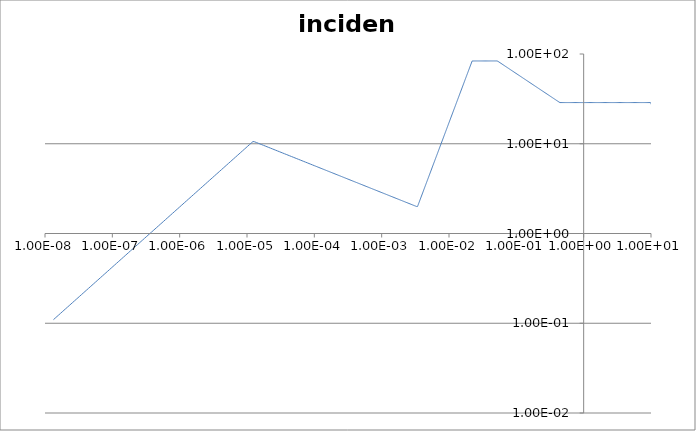
| Category | incident |
|---|---|
| 29929300.0 | 0 |
| 29829700.0 | 0 |
| 29730400.0 | 0 |
| 29631500.0 | 0 |
| 29532900.0 | 0 |
| 29434700.0 | 0 |
| 29336700.0 | 0 |
| 29239100.0 | 0 |
| 29141800.0 | 0 |
| 29044800.0 | 0 |
| 28948200.0 | 0 |
| 28851900.0 | 0 |
| 28755900.0 | 0 |
| 28660200.0 | 0 |
| 28564800.0 | 0 |
| 28469800.0 | 0 |
| 28375000.0 | 0 |
| 28280600.0 | 0 |
| 28186500.0 | 0 |
| 28092700.0 | 0 |
| 27999300.0 | 0 |
| 27906100.0 | 0 |
| 27813200.0 | 0 |
| 27720700.0 | 0 |
| 27628500.0 | 0 |
| 27536500.0 | 0 |
| 27444900.0 | 0 |
| 27353600.0 | 0 |
| 27262600.0 | 0 |
| 27171800.0 | 0 |
| 27081400.0 | 0 |
| 26991300.0 | 0 |
| 26901500.0 | 0 |
| 26812000.0 | 0 |
| 26722800.0 | 0 |
| 26633900.0 | 0 |
| 26545200.0 | 0 |
| 26456900.0 | 0 |
| 26368900.0 | 0 |
| 26281100.0 | 0 |
| 26193700.0 | 0 |
| 26106500.0 | 0 |
| 26019700.0 | 0 |
| 25933100.0 | 0 |
| 25846800.0 | 0 |
| 25760800.0 | 0 |
| 25675100.0 | 0 |
| 25589600.0 | 0 |
| 25504500.0 | 0 |
| 25419600.0 | 0 |
| 25335100.0 | 0 |
| 25250800.0 | 0 |
| 25166700.0 | 0 |
| 25083000.0 | 0 |
| 24999500.0 | 0 |
| 24916300.0 | 0 |
| 24833400.0 | 0 |
| 24750800.0 | 0 |
| 24668500.0 | 0 |
| 24586400.0 | 0 |
| 24504600.0 | 0 |
| 24423000.0 | 0 |
| 24341800.0 | 0 |
| 24260800.0 | 0 |
| 24180000.0 | 0 |
| 24099600.0 | 0 |
| 24019400.0 | 0 |
| 23939500.0 | 0 |
| 23859800.0 | 0 |
| 23780400.0 | 0 |
| 23701300.0 | 0 |
| 23622400.0 | 0 |
| 23543800.0 | 0 |
| 23465500.0 | 0 |
| 23387400.0 | 0 |
| 23309600.0 | 0 |
| 23232000.0 | 0 |
| 23154700.0 | 0 |
| 23077700.0 | 0 |
| 23000900.0 | 0 |
| 22924400.0 | 0 |
| 22848100.0 | 0 |
| 22772000.0 | 0 |
| 22696300.0 | 0 |
| 22620800.0 | 0 |
| 22545500.0 | 0 |
| 22470500.0 | 0 |
| 22395700.0 | 0 |
| 22321200.0 | 0 |
| 22246900.0 | 0 |
| 22172900.0 | 0 |
| 22099100.0 | 0 |
| 22025600.0 | 0 |
| 21952300.0 | 0 |
| 21879200.0 | 0 |
| 21806400.0 | 0 |
| 21733900.0 | 0 |
| 21661600.0 | 0 |
| 21589500.0 | 0 |
| 21517600.0 | 0 |
| 21446000.0 | 0 |
| 21374700.0 | 0 |
| 21303600.0 | 0 |
| 21232700.0 | 0 |
| 21162000.0 | 0 |
| 21091600.0 | 0 |
| 21021400.0 | 0 |
| 20951500.0 | 0 |
| 20881800.0 | 0 |
| 20812300.0 | 0 |
| 20743000.0 | 0 |
| 20674000.0 | 0 |
| 20605200.0 | 0 |
| 20536700.0 | 0 |
| 20468300.0 | 0 |
| 20400200.0 | 0 |
| 20332300.0 | 0 |
| 20264700.0 | 0 |
| 20197300.0 | 0 |
| 20130100.0 | 0 |
| 20063100.0 | 0 |
| 19996300.0 | 0 |
| 19929800.0 | 0 |
| 19863500.0 | 0 |
| 19797400.0 | 0 |
| 19731500.0 | 0 |
| 19665800.0 | 0 |
| 19600400.0 | 0 |
| 19535200.0 | 0 |
| 19470200.0 | 0 |
| 19405400.0 | 0 |
| 19340800.0 | 0 |
| 19276500.0 | 0 |
| 19212300.0 | 0 |
| 19148400.0 | 0 |
| 19084700.0 | 0 |
| 19021200.0 | 0 |
| 18957900.0 | 0 |
| 18894800.0 | 0 |
| 18831900.0 | 0 |
| 18769300.0 | 0 |
| 18706800.0 | 0 |
| 18644600.0 | 0 |
| 18582500.0 | 0 |
| 18520700.0 | 0 |
| 18459100.0 | 0 |
| 18397700.0 | 0 |
| 18336400.0 | 0 |
| 18275400.0 | 0 |
| 18214600.0 | 0 |
| 18154000.0 | 0 |
| 18093600.0 | 0 |
| 18033400.0 | 0 |
| 17973400.0 | 0 |
| 17913600.0 | 0 |
| 17854000.0 | 0 |
| 17794600.0 | 0 |
| 17735400.0 | 0 |
| 17676400.0 | 0 |
| 17617500.0 | 0 |
| 17558900.0 | 0 |
| 17500500.0 | 0 |
| 17442300.0 | 0 |
| 17384200.0 | 0 |
| 17326400.0 | 0 |
| 17268700.0 | 0 |
| 17211300.0 | 0 |
| 17154000.0 | 0 |
| 17096900.0 | 0 |
| 17040000.0 | 0 |
| 16983300.0 | 0 |
| 16926800.0 | 0 |
| 16870500.0 | 0 |
| 16814400.0 | 0 |
| 16758400.0 | 0 |
| 16702700.0 | 0 |
| 16647100.0 | 0 |
| 16591700.0 | 0 |
| 16536500.0 | 0 |
| 16481500.0 | 0 |
| 16426600.0 | 0 |
| 16372000.0 | 0 |
| 16317500.0 | 0 |
| 16263200.0 | 0 |
| 16209100.0 | 0 |
| 16155100.0 | 0 |
| 16101400.0 | 0 |
| 16047800.0 | 0 |
| 15994400.0 | 0 |
| 15941200.0 | 0 |
| 15888100.0 | 0 |
| 15835300.0 | 0 |
| 15782600.0 | 0 |
| 15730100.0 | 0 |
| 15677700.0 | 0 |
| 15625600.0 | 0 |
| 15573600.0 | 0 |
| 15521700.0 | 0 |
| 15470100.0 | 0 |
| 15418600.0 | 0 |
| 15367300.0 | 0 |
| 15316200.0 | 0 |
| 15265200.0 | 0 |
| 15214400.0 | 0 |
| 15163800.0 | 0 |
| 15113300.0 | 0 |
| 15063100.0 | 0 |
| 15012900.0 | 0 |
| 14963000.0 | 0 |
| 14913200.0 | 0 |
| 14863600.0 | 0 |
| 14814100.0 | 0 |
| 14764800.0 | 0 |
| 14715700.0 | 0 |
| 14666700.0 | 0 |
| 14617900.0 | 0 |
| 14569300.0 | 0 |
| 14520800.0 | 0 |
| 14472500.0 | 0 |
| 14424300.0 | 0 |
| 14376300.0 | 0 |
| 14328500.0 | 0 |
| 14280800.0 | 0 |
| 14233300.0 | 0 |
| 14185900.0 | 0 |
| 14138700.0 | 0 |
| 14091700.0 | 0 |
| 14044800.0 | 0 |
| 13998100.0 | 0 |
| 13951500.0 | 0 |
| 13905100.0 | 0 |
| 13858800.0 | 0 |
| 13812700.0 | 0 |
| 13766700.0 | 0 |
| 13720900.0 | 0 |
| 13675300.0 | 0 |
| 13629800.0 | 0 |
| 13584400.0 | 0 |
| 13539200.0 | 0 |
| 13494200.0 | 0 |
| 13449300.0 | 0 |
| 13404500.0 | 0 |
| 13359900.0 | 0 |
| 13315500.0 | 0 |
| 13271200.0 | 0 |
| 13227000.0 | 0 |
| 13183000.0 | 0 |
| 13139100.0 | 0 |
| 13095400.0 | 0 |
| 13051800.0 | 0 |
| 13008400.0 | 0 |
| 12965100.0 | 0 |
| 12922000.0 | 0 |
| 12879000.0 | 0 |
| 12836100.0 | 0 |
| 12793400.0 | 0 |
| 12750800.0 | 0 |
| 12708400.0 | 0 |
| 12666100.0 | 0 |
| 12624000.0 | 0 |
| 12582000.0 | 0 |
| 12540100.0 | 0 |
| 12498400.0 | 0 |
| 12456800.0 | 0 |
| 12415300.0 | 0 |
| 12374000.0 | 0 |
| 12332900.0 | 0 |
| 12291800.0 | 0 |
| 12250900.0 | 0 |
| 12210200.0 | 0 |
| 12169500.0 | 0 |
| 12129000.0 | 0 |
| 12088700.0 | 0 |
| 12048500.0 | 0 |
| 12008400.0 | 0 |
| 11968400.0 | 0 |
| 11928600.0 | 0 |
| 11888900.0 | 0 |
| 11849300.0 | 0 |
| 11809900.0 | 0 |
| 11770600.0 | 0 |
| 11731400.0 | 0 |
| 11692400.0 | 0 |
| 11653500.0 | 0 |
| 11614700.0 | 0 |
| 11576100.0 | 0 |
| 11537600.0 | 0 |
| 11499200.0 | 0 |
| 11460900.0 | 0 |
| 11422800.0 | 0 |
| 11384800.0 | 0 |
| 11346900.0 | 0 |
| 11309100.0 | 0 |
| 11271500.0 | 0 |
| 11234000.0 | 0 |
| 11196600.0 | 0 |
| 11159400.0 | 0 |
| 11122200.0 | 0 |
| 11085200.0 | 0 |
| 11048300.0 | 0 |
| 11011600.0 | 0 |
| 10974900.0 | 0 |
| 10938400.0 | 0 |
| 10902000.0 | 0 |
| 10865700.0 | 0 |
| 10829600.0 | 0 |
| 10793500.0 | 0 |
| 10757600.0 | 0 |
| 10721800.0 | 0 |
| 10686200.0 | 0 |
| 10650600.0 | 0 |
| 10615200.0 | 0 |
| 10579800.0 | 0 |
| 10544600.0 | 0 |
| 10509600.0 | 0 |
| 10474600.0 | 0 |
| 10439700.0 | 0 |
| 10405000.0 | 0 |
| 10370400.0 | 0 |
| 10335900.0 | 0 |
| 10301500.0 | 0 |
| 10267200.0 | 0 |
| 10233000.0 | 0 |
| 10199000.0 | 0 |
| 10165000.0 | 0 |
| 10131200.0 | 0 |
| 10097500.0 | 0 |
| 10063900.0 | 0 |
| 10030400.0 | 0 |
| 9997050.0 | 0 |
| 9963790.0 | 0 |
| 9930630.0 | 0 |
| 9897590.0 | 0 |
| 9864650.0 | 0 |
| 9831830.0 | 0 |
| 9799120.0 | 0 |
| 9766510.0 | 0 |
| 9734010.0 | 0 |
| 9701620.0 | 0 |
| 9669340.0 | 0 |
| 9637170.0 | 0 |
| 9605100.0 | 0 |
| 9573140.0 | 0 |
| 9541290.0 | 0 |
| 9509540.0 | 0 |
| 9477900.0 | 0 |
| 9446360.0 | 0 |
| 9414930.0 | 0 |
| 9383600.0 | 0 |
| 9352380.0 | 0 |
| 9321260.0 | 0 |
| 9290240.0 | 0 |
| 9259330.0 | 0 |
| 9228520.0 | 0 |
| 9197810.0 | 0 |
| 9167210.0 | 0 |
| 9136700.0 | 0 |
| 9106300.0 | 0 |
| 9076000.0 | 0 |
| 9045800.0 | 0 |
| 9015700.0 | 0 |
| 8985700.0 | 0 |
| 8955810.0 | 0 |
| 8926010.0 | 0 |
| 8896300.0 | 0 |
| 8866700.0 | 0 |
| 8837200.0 | 0 |
| 8807790.0 | 0 |
| 8778490.0 | 0 |
| 8749280.0 | 0 |
| 8720160.0 | 0 |
| 8691150.0 | 0 |
| 8662230.0 | 0 |
| 8633410.0 | 0 |
| 8604680.0 | 0 |
| 8576050.0 | 0 |
| 8547510.0 | 0 |
| 8519070.0 | 0 |
| 8490720.0 | 0 |
| 8462470.0 | 0 |
| 8434310.0 | 0 |
| 8406250.0 | 0 |
| 8378280.0 | 0 |
| 8350400.0 | 0 |
| 8322620.0 | 0 |
| 8294920.0 | 0 |
| 8267320.0 | 0 |
| 8239810.0 | 0 |
| 8212400.0 | 0 |
| 8185070.0 | 0 |
| 8157830.0 | 0 |
| 8130690.0 | 0 |
| 8103640.0 | 0 |
| 8076670.0 | 0 |
| 8049800.0 | 0 |
| 8023010.0 | 0 |
| 7996320.0 | 0 |
| 7969710.0 | 0 |
| 7943190.0 | 0 |
| 7916760.0 | 0 |
| 7890420.0 | 0 |
| 7864160.0 | 0 |
| 7838000.0 | 0 |
| 7811910.0 | 0 |
| 7785920.0 | 0 |
| 7760010.0 | 0 |
| 7734190.0 | 0 |
| 7708460.0 | 0 |
| 7682810.0 | 0 |
| 7657250.0 | 0 |
| 7631770.0 | 0 |
| 7606370.0 | 0 |
| 7581060.0 | 0 |
| 7555840.0 | 0 |
| 7530700.0 | 0 |
| 7505640.0 | 0 |
| 7480660.0 | 0 |
| 7455770.0 | 0 |
| 7430960.0 | 0 |
| 7406240.0 | 0 |
| 7381590.0 | 0 |
| 7357030.0 | 0 |
| 7332550.0 | 0 |
| 7308150.0 | 0 |
| 7283840.0 | 0 |
| 7259600.0 | 0 |
| 7235440.0 | 0 |
| 7211370.0 | 0 |
| 7187370.0 | 0 |
| 7163460.0 | 0 |
| 7139620.0 | 0 |
| 7115870.0 | 0 |
| 7092190.0 | 0 |
| 7068590.0 | 0 |
| 7045070.0 | 0 |
| 7021630.0 | 0 |
| 6998260.0 | 0 |
| 6974980.0 | 0 |
| 6951770.0 | 0 |
| 6928640.0 | 0 |
| 6905580.0 | 0 |
| 6882600.0 | 0 |
| 6859700.0 | 0 |
| 6836880.0 | 0 |
| 6814130.0 | 0 |
| 6791460.0 | 0 |
| 6768860.0 | 0 |
| 6746330.0 | 0 |
| 6723890.0 | 0 |
| 6701510.0 | 0 |
| 6679220.0 | 0 |
| 6656990.0 | 0 |
| 6634840.0 | 0 |
| 6612760.0 | 0 |
| 6590760.0 | 0 |
| 6568830.0 | 0 |
| 6546970.0 | 0 |
| 6525190.0 | 0 |
| 6503480.0 | 0 |
| 6481840.0 | 0 |
| 6460270.0 | 0 |
| 6438770.0 | 0 |
| 6417350.0 | 0 |
| 6395990.0 | 0 |
| 6374710.0 | 0 |
| 6353500.0 | 0 |
| 6332360.0 | 0 |
| 6311290.0 | 0 |
| 6290290.0 | 0 |
| 6269360.0 | 0 |
| 6248500.0 | 0 |
| 6227710.0 | 0 |
| 6206980.0 | 0 |
| 6186330.0 | 0 |
| 6165750.0 | 0 |
| 6145230.0 | 0 |
| 6124780.0 | 0 |
| 6104400.0 | 0 |
| 6084090.0 | 0 |
| 6063850.0 | 0 |
| 6043670.0 | 0 |
| 6023560.0 | 0 |
| 6003520.0 | 0 |
| 5983540.0 | 0 |
| 5963630.0 | 0 |
| 5943790.0 | 0 |
| 5924010.0 | 0 |
| 5904300.0 | 0 |
| 5884650.0 | 0 |
| 5865070.0 | 0 |
| 5845560.0 | 0 |
| 5826100.0 | 0 |
| 5806720.0 | 0 |
| 5787400.0 | 0 |
| 5768140.0 | 0 |
| 5748950.0 | 0 |
| 5729820.0 | 0 |
| 5710750.0 | 0 |
| 5691750.0 | 0 |
| 5672810.0 | 0 |
| 5653940.0 | 0 |
| 5635120.0 | 0 |
| 5616370.0 | 0 |
| 5597680.0 | 0 |
| 5579060.0 | 0 |
| 5560490.0 | 0 |
| 5541990.0 | 0 |
| 5523550.0 | 0 |
| 5505170.0 | 0 |
| 5486850.0 | 0 |
| 5468600.0 | 0 |
| 5450400.0 | 0 |
| 5432270.0 | 0 |
| 5414190.0 | 0 |
| 5396180.0 | 0 |
| 5378220.0 | 0 |
| 5360320.0 | 0 |
| 5342490.0 | 0 |
| 5324710.0 | 0 |
| 5306990.0 | 0 |
| 5289340.0 | 0 |
| 5271730.0 | 0 |
| 5254190.0 | 0 |
| 5236710.0 | 0 |
| 5219290.0 | 0 |
| 5201920.0 | 0 |
| 5184610.0 | 0 |
| 5167360.0 | 0 |
| 5150170.0 | 0 |
| 5133030.0 | 0 |
| 5115950.0 | 0 |
| 5098930.0 | 0 |
| 5081960.0 | 0 |
| 5065050.0 | 0 |
| 5048200.0 | 0 |
| 5031400.0 | 0 |
| 5014660.0 | 0 |
| 4997970.0 | 0 |
| 4981340.0 | 0 |
| 4964770.0 | 0 |
| 4948250.0 | 0 |
| 4931780.0 | 0 |
| 4915370.0 | 0 |
| 4899010.0 | 0 |
| 4882710.0 | 0 |
| 4866470.0 | 0 |
| 4850270.0 | 0 |
| 4834140.0 | 0 |
| 4818050.0 | 0 |
| 4802020.0 | 0 |
| 4786040.0 | 0 |
| 4770120.0 | 0 |
| 4754240.0 | 0 |
| 4738420.0 | 0 |
| 4722660.0 | 0 |
| 4706940.0 | 0 |
| 4691280.0 | 0 |
| 4675670.0 | 0 |
| 4660110.0 | 0 |
| 4644610.0 | 0 |
| 4629150.0 | 0 |
| 4613750.0 | 0 |
| 4598400.0 | 0 |
| 4583100.0 | 0 |
| 4567850.0 | 0 |
| 4552650.0 | 0 |
| 4537500.0 | 0 |
| 4522400.0 | 0 |
| 4507350.0 | 0 |
| 4492350.0 | 0 |
| 4477410.0 | 0 |
| 4462510.0 | 0 |
| 4447660.0 | 0 |
| 4432860.0 | 0 |
| 4418110.0 | 0 |
| 4403410.0 | 0 |
| 4388760.0 | 0 |
| 4374150.0 | 0 |
| 4359600.0 | 0 |
| 4345090.0 | 0 |
| 4330640.0 | 0 |
| 4316230.0 | 0 |
| 4301860.0 | 0 |
| 4287550.0 | 0 |
| 4273280.0 | 0 |
| 4259060.0 | 0 |
| 4244890.0 | 0 |
| 4230770.0 | 0 |
| 4216690.0 | 0 |
| 4202660.0 | 0 |
| 4188680.0 | 0 |
| 4174740.0 | 0 |
| 4160850.0 | 0 |
| 4147000.0 | 0 |
| 4133200.0 | 0 |
| 4119450.0 | 0 |
| 4105740.0 | 0 |
| 4092080.0 | 0 |
| 4078470.0 | 0 |
| 4064890.0 | 0 |
| 4051370.0 | 0 |
| 4037890.0 | 0 |
| 4024450.0 | 0 |
| 4011060.0 | 0 |
| 3997720.0 | 0 |
| 3984410.0 | 0 |
| 3971160.0 | 0 |
| 3957940.0 | 0 |
| 3944770.0 | 0 |
| 3931650.0 | 0 |
| 3918560.0 | 0 |
| 3905520.0 | 0 |
| 3892530.0 | 0 |
| 3879580.0 | 0 |
| 3866670.0 | 0 |
| 3853800.0 | 0 |
| 3840980.0 | 0 |
| 3828200.0 | 0 |
| 3815460.0 | 0 |
| 3802760.0 | 0 |
| 3790110.0 | 0 |
| 3777500.0 | 0 |
| 3764930.0 | 0 |
| 3752400.0 | 0 |
| 3739920.0 | 0 |
| 3727470.0 | 0 |
| 3715070.0 | 0 |
| 3702710.0 | 0 |
| 3690390.0 | 0 |
| 3678110.0 | 0 |
| 3665870.0 | 0 |
| 3653670.0 | 0 |
| 3641510.0 | 0 |
| 3629400.0 | 0 |
| 3617320.0 | 0 |
| 3605290.0 | 0 |
| 3593290.0 | 0 |
| 3581330.0 | 0 |
| 3569420.0 | 0 |
| 3557540.0 | 0 |
| 3545700.0 | 0 |
| 3533900.0 | 0 |
| 3522140.0 | 0 |
| 3510420.0 | 0 |
| 3498740.0 | 0 |
| 3487100.0 | 0 |
| 3475500.0 | 0 |
| 3463930.0 | 0 |
| 3452410.0 | 0 |
| 3440920.0 | 0 |
| 3429470.0 | 0 |
| 3418060.0 | 0 |
| 3406690.0 | 0 |
| 3395350.0 | 0 |
| 3384050.0 | 0 |
| 3372790.0 | 0 |
| 3361570.0 | 0 |
| 3350390.0 | 0 |
| 3339240.0 | 0 |
| 3328130.0 | 0 |
| 3317050.0 | 0 |
| 3306020.0 | 0 |
| 3295010.0 | 0 |
| 3284050.0 | 0 |
| 3273120.0 | 0 |
| 3262230.0 | 0 |
| 3251380.0 | 0 |
| 3240560.0 | 0 |
| 3229780.0 | 0 |
| 3219030.0 | 0 |
| 3208320.0 | 0 |
| 3197640.0 | 0 |
| 3187000.0 | 0 |
| 3176400.0 | 0 |
| 3165830.0 | 0 |
| 3155300.0 | 0 |
| 3144800.0 | 0 |
| 3134330.0 | 0 |
| 3123900.0 | 0 |
| 3113510.0 | 0 |
| 3103150.0 | 0 |
| 3092820.0 | 0 |
| 3082530.0 | 0 |
| 3072270.0 | 0 |
| 3062050.0 | 0 |
| 3051860.0 | 0 |
| 3041710.0 | 0 |
| 3031590.0 | 0 |
| 3021500.0 | 0 |
| 3011450.0 | 0 |
| 3001430.0 | 0 |
| 2991440.0 | 0 |
| 2981480.0 | 0 |
| 2971560.0 | 0 |
| 2961680.0 | 0 |
| 2951820.0 | 0 |
| 2942000.0 | 0 |
| 2932210.0 | 0 |
| 2922450.0 | 0 |
| 2912730.0 | 0 |
| 2903040.0 | 0 |
| 2893380.0 | 0 |
| 2883750.0 | 0 |
| 2874160.0 | 0 |
| 2864590.0 | 0 |
| 2855060.0 | 0 |
| 2845560.0 | 0 |
| 2836090.0 | 0 |
| 2826650.0 | 0 |
| 2817250.0 | 0 |
| 2807870.0 | 0 |
| 2798530.0 | 0 |
| 2789220.0 | 0 |
| 2779940.0 | 0 |
| 2770690.0 | 0 |
| 2761470.0 | 0 |
| 2752280.0 | 0 |
| 2743120.0 | 0 |
| 2734000.0 | 0 |
| 2724900.0 | 0 |
| 2715830.0 | 0 |
| 2706800.0 | 0 |
| 2697790.0 | 0 |
| 2688810.0 | 0 |
| 2679860.0 | 0 |
| 2670950.0 | 0 |
| 2662060.0 | 0 |
| 2653200.0 | 0 |
| 2644370.0 | 0 |
| 2635580.0 | 0 |
| 2626810.0 | 0 |
| 2618070.0 | 0 |
| 2609350.0 | 0 |
| 2600670.0 | 0 |
| 2592020.0 | 0 |
| 2583390.0 | 0 |
| 2574800.0 | 0 |
| 2566230.0 | 0 |
| 2557690.0 | 0 |
| 2549180.0 | 0 |
| 2540700.0 | 0 |
| 2532240.0 | 0 |
| 2523820.0 | 0 |
| 2515420.0 | 0 |
| 2507050.0 | 0 |
| 2498710.0 | 0 |
| 2490390.0 | 0 |
| 2482110.0 | 0 |
| 2473850.0 | 0 |
| 2465620.0 | 0 |
| 2457410.0 | 0 |
| 2449240.0 | 0 |
| 2441090.0 | 0 |
| 2432960.0 | 0 |
| 2424870.0 | 0 |
| 2416800.0 | 0 |
| 2408760.0 | 0 |
| 2400740.0 | 0 |
| 2392750.0 | 0 |
| 2384790.0 | 0 |
| 2376860.0 | 0 |
| 2368950.0 | 0 |
| 2361070.0 | 0 |
| 2353210.0 | 0 |
| 2345380.0 | 0 |
| 2337580.0 | 0 |
| 2329800.0 | 0 |
| 2322050.0 | 0 |
| 2314320.0 | 0 |
| 2306620.0 | 0 |
| 2298940.0 | 0 |
| 2291290.0 | 0 |
| 2283670.0 | 0 |
| 2276070.0 | 0 |
| 2268500.0 | 0 |
| 2260950.0 | 0 |
| 2253430.0 | 0 |
| 2245930.0 | 0 |
| 2238460.0 | 0 |
| 2231010.0 | 0 |
| 2223580.0 | 0 |
| 2216180.0 | 0 |
| 2208810.0 | 0 |
| 2201460.0 | 0 |
| 2194140.0 | 0 |
| 2186830.0 | 0 |
| 2179560.0 | 0 |
| 2172310.0 | 0 |
| 2165080.0 | 0 |
| 2157870.0 | 0 |
| 2150690.0 | 0 |
| 2143540.0 | 0 |
| 2136400.0 | 0 |
| 2129300.0 | 0 |
| 2122210.0 | 0 |
| 2115150.0 | 0 |
| 2108110.0 | 0 |
| 2101100.0 | 0 |
| 2094110.0 | 0 |
| 2087140.0 | 0 |
| 2080190.0 | 0 |
| 2073270.0 | 0 |
| 2066370.0 | 0 |
| 2059500.0 | 0 |
| 2052640.0 | 0 |
| 2045810.0 | 0 |
| 2039010.0 | 0 |
| 2032220.0 | 0 |
| 2025460.0 | 0 |
| 2018720.0 | 0 |
| 2012000.0 | 0 |
| 2005310.0 | 0 |
| 1998640.0 | 0 |
| 1991990.0 | 0 |
| 1985360.0 | 0 |
| 1978750.0 | 0 |
| 1972170.0 | 0 |
| 1965600.0 | 0 |
| 1959060.0 | 0 |
| 1952550.0 | 0 |
| 1946050.0 | 0 |
| 1939570.0 | 0 |
| 1933120.0 | 0 |
| 1926690.0 | 0 |
| 1920280.0 | 0 |
| 1913890.0 | 0 |
| 1907520.0 | 0 |
| 1901170.0 | 0 |
| 1894850.0 | 0 |
| 1888540.0 | 0 |
| 1882260.0 | 0 |
| 1875990.0 | 0 |
| 1869750.0 | 0 |
| 1863530.0 | 0 |
| 1857330.0 | 0 |
| 1851150.0 | 0 |
| 1844990.0 | 0 |
| 1838850.0 | 0 |
| 1832730.0 | 0 |
| 1826630.0 | 0 |
| 1820560.0 | 0 |
| 1814500.0 | 0 |
| 1808460.0 | 0 |
| 1802440.0 | 0 |
| 1796450.0 | 0 |
| 1790470.0 | 0 |
| 1784510.0 | 0 |
| 1778570.0 | 0 |
| 1772650.0 | 0 |
| 1766760.0 | 0 |
| 1760880.0 | 0 |
| 1755020.0 | 0 |
| 1749180.0 | 0 |
| 1743360.0 | 0 |
| 1737560.0 | 0 |
| 1731780.0 | 0 |
| 1726010.0 | 0 |
| 1720270.0 | 0 |
| 1714550.0 | 0 |
| 1708840.0 | 0 |
| 1703150.0 | 0 |
| 1697490.0 | 0 |
| 1691840.0 | 0 |
| 1686210.0 | 0 |
| 1680600.0 | 0 |
| 1675010.0 | 0 |
| 1669430.0 | 0 |
| 1663880.0 | 0 |
| 1658340.0 | 0 |
| 1652820.0 | 0 |
| 1647320.0 | 0 |
| 1641840.0 | 0 |
| 1636380.0 | 0 |
| 1630940.0 | 0 |
| 1625510.0 | 0 |
| 1620100.0 | 0 |
| 1614710.0 | 0 |
| 1609340.0 | 0 |
| 1603980.0 | 0 |
| 1598640.0 | 0 |
| 1593320.0 | 0 |
| 1588020.0 | 0 |
| 1582740.0 | 0 |
| 1577470.0 | 0 |
| 1572220.0 | 0 |
| 1566990.0 | 0 |
| 1561780.0 | 0 |
| 1556580.0 | 0 |
| 1551400.0 | 0 |
| 1546240.0 | 0 |
| 1541100.0 | 0 |
| 1535970.0 | 0 |
| 1530860.0 | 0 |
| 1525760.0 | 0 |
| 1520690.0 | 0 |
| 1515630.0 | 0 |
| 1510580.0 | 0 |
| 1505560.0 | 0 |
| 1500550.0 | 0 |
| 1495550.0 | 0 |
| 1490580.0 | 0 |
| 1485620.0 | 0 |
| 1480670.0 | 0 |
| 1475750.0 | 0 |
| 1470840.0 | 0 |
| 1465940.0 | 0 |
| 1461070.0 | 0 |
| 1456200.0 | 0 |
| 1451360.0 | 0 |
| 1446530.0 | 0 |
| 1441720.0 | 0 |
| 1436920.0 | 0 |
| 1432140.0 | 0 |
| 1427370.0 | 0 |
| 1422620.0 | 0 |
| 1417890.0 | 0 |
| 1413170.0 | 0 |
| 1408470.0 | 0 |
| 1403780.0 | 0 |
| 1399110.0 | 0 |
| 1394460.0 | 0 |
| 1389820.0 | 0 |
| 1385190.0 | 0 |
| 1380580.0 | 0 |
| 1375990.0 | 0 |
| 1371410.0 | 0 |
| 1366850.0 | 0 |
| 1362300.0 | 0 |
| 1357770.0 | 0 |
| 1353250.0 | 0 |
| 1348740.0 | 0 |
| 1344260.0 | 0 |
| 1339780.0 | 0 |
| 1335330.0 | 0 |
| 1330880.0 | 0 |
| 1326450.0 | 0 |
| 1322040.0 | 0 |
| 1317640.0 | 0 |
| 1313260.0 | 0 |
| 1308890.0 | 0 |
| 1304530.0 | 0 |
| 1300190.0 | 0 |
| 1295870.0 | 0 |
| 1291550.0 | 0 |
| 1287260.0 | 0 |
| 1282970.0 | 0 |
| 1278700.0 | 0 |
| 1274450.0 | 0 |
| 1270210.0 | 0 |
| 1265980.0 | 0 |
| 1261770.0 | 0 |
| 1257570.0 | 0 |
| 1253390.0 | 0 |
| 1249220.0 | 0 |
| 1245060.0 | 0 |
| 1240920.0 | 0 |
| 1236790.0 | 0 |
| 1232670.0 | 0 |
| 1228570.0 | 0 |
| 1224480.0 | 0 |
| 1220410.0 | 0 |
| 1216350.0 | 0 |
| 1212300.0 | 0 |
| 1208270.0 | 0 |
| 1204250.0 | 0 |
| 1200240.0 | 0 |
| 1196240.0 | 0 |
| 1192260.0 | 0 |
| 1188300.0 | 0 |
| 1184340.0 | 0 |
| 1180400.0 | 0 |
| 1176470.0 | 0 |
| 1172560.0 | 0 |
| 1168660.0 | 0 |
| 1164770.0 | 0 |
| 1160890.0 | 0 |
| 1157030.0 | 0 |
| 1153180.0 | 0 |
| 1149340.0 | 0 |
| 1145520.0 | 0 |
| 1141710.0 | 0 |
| 1137910.0 | 0 |
| 1134120.0 | 0 |
| 1130350.0 | 0 |
| 1126590.0 | 0 |
| 1122840.0 | 0 |
| 1119100.0 | 0 |
| 1115380.0 | 0 |
| 1111670.0 | 0 |
| 1107970.0 | 0 |
| 1104280.0 | 0 |
| 1100610.0 | 0 |
| 1096950.0 | 0 |
| 1093300.0 | 0 |
| 1089660.0 | 0 |
| 1086030.0 | 0 |
| 1082420.0 | 0 |
| 1078820.0 | 0 |
| 1075230.0 | 0 |
| 1071650.0 | 0 |
| 1068080.0 | 0 |
| 1064530.0 | 0 |
| 1060990.0 | 0 |
| 1057460.0 | 0 |
| 1053940.0 | 0 |
| 1050430.0 | 0 |
| 1046940.0 | 0 |
| 1043450.0 | 0 |
| 1039980.0 | 0 |
| 1036520.0 | 0 |
| 1033070.0 | 0 |
| 1029630.0 | 0 |
| 1026210.0 | 0 |
| 1022790.0 | 0 |
| 1019390.0 | 0 |
| 1016000.0 | 0 |
| 1012620.0 | 0 |
| 1009250.0 | 0 |
| 1005890.0 | 0 |
| 1002540.0 | 0 |
| 999207.0 | 0 |
| 995882.0 | 0 |
| 992569.0 | 0 |
| 989266.0 | 0 |
| 985974.0 | 0 |
| 982694.0 | 0 |
| 979424.0 | 0 |
| 976165.0 | 0 |
| 972917.0 | 0 |
| 969679.0 | 0 |
| 966453.0 | 0 |
| 963237.0 | 0 |
| 960032.0 | 0 |
| 956838.0 | 0 |
| 953654.0 | 0 |
| 950481.0 | 0 |
| 947318.0 | 0 |
| 944166.0 | 0 |
| 941024.0 | 0 |
| 937893.0 | 0 |
| 934772.0 | 0 |
| 931662.0 | 0 |
| 928562.0 | 0 |
| 925472.0 | 0 |
| 922393.0 | 0 |
| 919323.0 | 0 |
| 916264.0 | 0 |
| 913216.0 | 0 |
| 910177.0 | 0 |
| 907148.0 | 0 |
| 904130.0 | 0 |
| 901122.0 | 0 |
| 898123.0 | 0 |
| 895135.0 | 0 |
| 892156.0 | 0 |
| 889188.0 | 0 |
| 886229.0 | 0 |
| 883280.0 | 0 |
| 880341.0 | 0 |
| 877412.0 | 0 |
| 874492.0 | 0 |
| 871582.0 | 0 |
| 868682.0 | 0 |
| 865792.0 | 0 |
| 862911.0 | 0 |
| 860040.0 | 0 |
| 857178.0 | 0 |
| 854326.0 | 0 |
| 851483.0 | 0 |
| 848650.0 | 0 |
| 845826.0 | 0 |
| 843012.0 | 0 |
| 840207.0 | 0 |
| 837411.0 | 0 |
| 834624.0 | 0 |
| 831847.0 | 0 |
| 829079.0 | 0 |
| 826321.0 | 0 |
| 823571.0 | 0 |
| 820831.0 | 0 |
| 818100.0 | 0 |
| 815377.0 | 0 |
| 812664.0 | 0 |
| 809960.0 | 0 |
| 807265.0 | 0 |
| 804579.0 | 0 |
| 801902.0 | 0 |
| 799234.0 | 0 |
| 796574.0 | 0 |
| 793924.0 | 0 |
| 791282.0 | 0 |
| 788649.0 | 0 |
| 786025.0 | 0 |
| 783409.0 | 0 |
| 780803.0 | 0 |
| 778205.0 | 0 |
| 775615.0 | 0 |
| 773034.0 | 0 |
| 770462.0 | 0 |
| 767898.0 | 0 |
| 765343.0 | 0 |
| 762797.0 | 0 |
| 760259.0 | 0 |
| 757729.0 | 0 |
| 755208.0 | 0 |
| 752695.0 | 0 |
| 750190.0 | 0 |
| 747694.0 | 0 |
| 745206.0 | 0 |
| 742726.0 | 0 |
| 740255.0 | 0 |
| 737792.0 | 0 |
| 735337.0 | 0 |
| 732890.0 | 0 |
| 730452.0 | 0 |
| 728021.0 | 0 |
| 725599.0 | 0 |
| 723184.0 | 0 |
| 720778.0 | 0 |
| 718380.0 | 0 |
| 715989.0 | 0 |
| 713607.0 | 0 |
| 711232.0 | 0 |
| 708866.0 | 0 |
| 706507.0 | 0 |
| 704156.0 | 0 |
| 701813.0 | 0 |
| 699478.0 | 0 |
| 697151.0 | 0 |
| 694831.0 | 0 |
| 692519.0 | 0 |
| 690215.0 | 0 |
| 687918.0 | 0 |
| 685629.0 | 0 |
| 683348.0 | 0 |
| 681074.0 | 0 |
| 678807.0 | 0 |
| 676549.0 | 0 |
| 674298.0 | 0 |
| 672054.0 | 0 |
| 669818.0 | 0 |
| 667589.0 | 0 |
| 665368.0 | 0 |
| 663154.0 | 0 |
| 660947.0 | 0 |
| 658748.0 | 0 |
| 656556.0 | 0 |
| 654371.0 | 0 |
| 652194.0 | 0 |
| 650024.0 | 0 |
| 647861.0 | 0 |
| 645705.0 | 0 |
| 643557.0 | 0 |
| 641415.0 | 0 |
| 639281.0 | 0 |
| 637154.0 | 0 |
| 635034.0 | 0 |
| 632921.0 | 0 |
| 630815.0 | 0 |
| 628716.0 | 0 |
| 626624.0 | 0 |
| 624539.0 | 0 |
| 622461.0 | 0 |
| 620389.0 | 0 |
| 618325.0 | 0 |
| 616268.0 | 0 |
| 614217.0 | 0 |
| 612173.0 | 0 |
| 610136.0 | 0 |
| 608106.0 | 0 |
| 606083.0 | 0 |
| 604066.0 | 0 |
| 602056.0 | 0 |
| 600053.0 | 0 |
| 598056.0 | 0 |
| 596066.0 | 0 |
| 594083.0 | 0 |
| 592106.0 | 0 |
| 590136.0 | 0 |
| 588172.0 | 0 |
| 586215.0 | 0 |
| 584265.0 | 0 |
| 582320.0 | 0 |
| 580383.0 | 0 |
| 578452.0 | 0 |
| 576527.0 | 0 |
| 574609.0 | 0 |
| 572697.0 | 0 |
| 570791.0 | 0 |
| 568892.0 | 0 |
| 566999.0 | 0 |
| 565112.0 | 0 |
| 563232.0 | 0 |
| 561358.0 | 0 |
| 559490.0 | 0 |
| 557628.0 | 0 |
| 555773.0 | 0 |
| 553923.0 | 0 |
| 552080.0 | 0 |
| 550243.0 | 0 |
| 548412.0 | 0 |
| 546588.0 | 0 |
| 544769.0 | 0 |
| 542956.0 | 0 |
| 541150.0 | 0 |
| 539349.0 | 0 |
| 537554.0 | 0 |
| 535766.0 | 0 |
| 533983.0 | 0 |
| 532206.0 | 0 |
| 530435.0 | 0 |
| 528670.0 | 0 |
| 526911.0 | 0 |
| 525158.0 | 0 |
| 523410.0 | 0 |
| 521669.0 | 0 |
| 519933.0 | 0 |
| 518203.0 | 0 |
| 516479.0 | 0 |
| 514760.0 | 0 |
| 513047.0 | 0 |
| 511340.0 | 0 |
| 509639.0 | 0 |
| 507943.0 | 0 |
| 506253.0 | 0 |
| 504568.0 | 0 |
| 502889.0 | 0 |
| 501216.0 | 0 |
| 499548.0 | 0 |
| 497886.0 | 0 |
| 496229.0 | 0 |
| 494578.0 | 0 |
| 492933.0 | 0 |
| 491292.0 | 0 |
| 489658.0 | 0 |
| 488028.0 | 0 |
| 486404.0 | 0 |
| 484786.0 | 0 |
| 483173.0 | 0 |
| 481565.0 | 0 |
| 479963.0 | 0 |
| 478366.0 | 0 |
| 476774.0 | 0 |
| 475188.0 | 0 |
| 473606.0 | 0 |
| 472031.0 | 0 |
| 470460.0 | 0 |
| 468895.0 | 0 |
| 467334.0 | 0 |
| 465779.0 | 0 |
| 464229.0 | 0 |
| 462685.0 | 0 |
| 461145.0 | 0 |
| 459611.0 | 0 |
| 458081.0 | 0 |
| 456557.0 | 0 |
| 455038.0 | 0 |
| 453524.0 | 0 |
| 452015.0 | 0 |
| 450511.0 | 0 |
| 449012.0 | 0 |
| 447518.0 | 0 |
| 446029.0 | 0 |
| 444545.0 | 0 |
| 443065.0 | 0 |
| 441591.0 | 0 |
| 440122.0 | 0 |
| 438657.0 | 0 |
| 437198.0 | 0 |
| 435743.0 | 0 |
| 434293.0 | 0 |
| 432848.0 | 0 |
| 431408.0 | 0 |
| 429972.0 | 0 |
| 428542.0 | 0 |
| 427116.0 | 0 |
| 425694.0 | 0 |
| 424278.0 | 0 |
| 422866.0 | 0 |
| 421459.0 | 0 |
| 420057.0 | 0 |
| 418659.0 | 0 |
| 417266.0 | 0 |
| 415878.0 | 0 |
| 414494.0 | 0 |
| 413115.0 | 0 |
| 411740.0 | 0 |
| 410370.0 | 0 |
| 409004.0 | 0 |
| 407644.0 | 0 |
| 406287.0 | 0 |
| 404935.0 | 0 |
| 403588.0 | 0 |
| 402245.0 | 0 |
| 400906.0 | 0 |
| 399573.0 | 0 |
| 398243.0 | 0 |
| 396918.0 | 0 |
| 395597.0 | 0 |
| 394281.0 | 0 |
| 392969.0 | 0 |
| 391661.0 | 0 |
| 390358.0 | 0 |
| 389059.0 | 0 |
| 387765.0 | 0 |
| 386474.0 | 0 |
| 385188.0 | 0 |
| 383907.0 | 0 |
| 382629.0 | 0 |
| 381356.0 | 0 |
| 380087.0 | 0 |
| 378822.0 | 0 |
| 377562.0 | 0 |
| 376306.0 | 0 |
| 375054.0 | 0 |
| 373806.0 | 0 |
| 372562.0 | 0 |
| 371322.0 | 0 |
| 370087.0 | 0 |
| 368855.0 | 0 |
| 367628.0 | 0 |
| 366405.0 | 0 |
| 365185.0 | 0 |
| 363970.0 | 0 |
| 362759.0 | 0 |
| 361552.0 | 0 |
| 360349.0 | 0 |
| 359150.0 | 0 |
| 357955.0 | 0 |
| 356764.0 | 0 |
| 355577.0 | 0 |
| 354394.0 | 0 |
| 353214.0 | 0 |
| 352039.0 | 0 |
| 350868.0 | 0 |
| 349700.0 | 0 |
| 348537.0 | 0 |
| 347377.0 | 0 |
| 346221.0 | 0 |
| 345069.0 | 0 |
| 343921.0 | 0 |
| 342776.0 | 0 |
| 341636.0 | 0 |
| 340499.0 | 0 |
| 339366.0 | 0 |
| 338237.0 | 0 |
| 337111.0 | 0 |
| 335990.0 | 0 |
| 334872.0 | 0 |
| 333758.0 | 0 |
| 332647.0 | 0 |
| 331540.0 | 0 |
| 330437.0 | 0 |
| 329337.0 | 0 |
| 328242.0 | 0 |
| 327149.0 | 0 |
| 326061.0 | 0 |
| 324976.0 | 0 |
| 323895.0 | 0 |
| 322817.0 | 0 |
| 321743.0 | 0 |
| 320672.0 | 0 |
| 319605.0 | 0 |
| 318542.0 | 0 |
| 317482.0 | 0 |
| 316425.0 | 0 |
| 315372.0 | 0 |
| 314323.0 | 0 |
| 313277.0 | 0 |
| 312235.0 | 0 |
| 311196.0 | 0 |
| 310160.0 | 0 |
| 309128.0 | 0 |
| 308100.0 | 0 |
| 307075.0 | 0 |
| 306053.0 | 0 |
| 305034.0 | 0 |
| 304019.0 | 0 |
| 303008.0 | 0 |
| 302000.0 | 0 |
| 300995.0 | 0 |
| 299993.0 | 0 |
| 298995.0 | 0 |
| 298000.0 | 0 |
| 297009.0 | 0 |
| 296020.0 | 0 |
| 295035.0 | 0 |
| 294054.0 | 0 |
| 293075.0 | 0 |
| 292100.0 | 0 |
| 291128.0 | 0 |
| 290159.0 | 0 |
| 289194.0 | 0 |
| 288232.0 | 0 |
| 287272.0 | 0 |
| 286317.0 | 0 |
| 285364.0 | 0 |
| 284414.0 | 0 |
| 283468.0 | 0 |
| 282525.0 | 0 |
| 281585.0 | 0 |
| 280648.0 | 0 |
| 279714.0 | 0 |
| 278783.0 | 0 |
| 277856.0 | 0 |
| 276931.0 | 0 |
| 276010.0 | 0 |
| 275091.0 | 0 |
| 274176.0 | 0 |
| 273264.0 | 0 |
| 272354.0 | 0 |
| 271448.0 | 0 |
| 270545.0 | 0 |
| 269645.0 | 0 |
| 268747.0 | 0 |
| 267853.0 | 0 |
| 266962.0 | 0 |
| 266074.0 | 0 |
| 265188.0 | 0 |
| 264306.0 | 0 |
| 263426.0 | 0 |
| 262550.0 | 0 |
| 261676.0 | 0 |
| 260806.0 | 0 |
| 259938.0 | 0 |
| 259073.0 | 0 |
| 258211.0 | 0 |
| 257352.0 | 0 |
| 256495.0 | 0 |
| 255642.0 | 0 |
| 254791.0 | 0 |
| 253943.0 | 0 |
| 253098.0 | 0 |
| 252256.0 | 0 |
| 251417.0 | 0 |
| 250580.0 | 0 |
| 249746.0 | 0 |
| 248915.0 | 0 |
| 248087.0 | 0 |
| 247262.0 | 0 |
| 246439.0 | 0 |
| 245619.0 | 0 |
| 244802.0 | 0 |
| 243987.0 | 0 |
| 243175.0 | 0 |
| 242366.0 | 0 |
| 241560.0 | 0 |
| 240756.0 | 0 |
| 239955.0 | 0 |
| 239156.0 | 0 |
| 238361.0 | 0 |
| 237567.0 | 0 |
| 236777.0 | 0 |
| 235989.0 | 0 |
| 235204.0 | 0 |
| 234421.0 | 0 |
| 233641.0 | 0 |
| 232864.0 | 0 |
| 232089.0 | 0 |
| 231317.0 | 0 |
| 230547.0 | 0 |
| 229780.0 | 0 |
| 229015.0 | 0 |
| 228253.0 | 0 |
| 227494.0 | 0 |
| 226737.0 | 0 |
| 225982.0 | 0 |
| 225230.0 | 0 |
| 224481.0 | 0 |
| 223734.0 | 0 |
| 222990.0 | 0 |
| 222248.0 | 0 |
| 221508.0 | 0 |
| 220771.0 | 0 |
| 220036.0 | 0 |
| 219304.0 | 0 |
| 218575.0 | 0 |
| 217847.0 | 0 |
| 217122.0 | 0 |
| 216400.0 | 0 |
| 215680.0 | 0 |
| 214962.0 | 0 |
| 214247.0 | 0 |
| 213534.0 | 0 |
| 212824.0 | 0 |
| 212115.0 | 0 |
| 211410.0 | 0 |
| 210706.0 | 0 |
| 210005.0 | 0 |
| 209306.0 | 0 |
| 208610.0 | 0 |
| 207916.0 | 0 |
| 207224.0 | 0 |
| 206534.0 | 0 |
| 205847.0 | 0 |
| 205162.0 | 0 |
| 204480.0 | 0 |
| 203799.0 | 0 |
| 203121.0 | 0 |
| 202445.0 | 0 |
| 201772.0 | 0 |
| 201100.0 | 0 |
| 200431.0 | 0 |
| 199764.0 | 0 |
| 199099.0 | 0 |
| 198437.0 | 0 |
| 197777.0 | 0 |
| 197119.0 | 0 |
| 196463.0 | 0 |
| 195809.0 | 0 |
| 195157.0 | 0 |
| 194508.0 | 0 |
| 193861.0 | 0 |
| 193216.0 | 0 |
| 192573.0 | 0 |
| 191932.0 | 0 |
| 191293.0 | 0 |
| 190657.0 | 0 |
| 190023.0 | 0 |
| 189390.0 | 0 |
| 188760.0 | 0 |
| 188132.0 | 0 |
| 187506.0 | 0 |
| 186882.0 | 0 |
| 186260.0 | 0 |
| 185640.0 | 0 |
| 185023.0 | 0 |
| 184407.0 | 0 |
| 183794.0 | 0 |
| 183182.0 | 0 |
| 182572.0 | 0 |
| 181965.0 | 0 |
| 181359.0 | 0 |
| 180756.0 | 0 |
| 180155.0 | 0 |
| 179555.0 | 0 |
| 178958.0 | 0 |
| 178362.0 | 0 |
| 177769.0 | 0 |
| 177177.0 | 0 |
| 176588.0 | 0 |
| 176000.0 | 0 |
| 175414.0 | 0 |
| 174831.0 | 0 |
| 174249.0 | 0 |
| 173669.0 | 0 |
| 173091.0 | 0 |
| 172515.0 | 0 |
| 171941.0 | 0 |
| 171369.0 | 0 |
| 170799.0 | 0 |
| 170231.0 | 0 |
| 169664.0 | 0 |
| 169100.0 | 0 |
| 168537.0 | 0 |
| 167976.0 | 0 |
| 167417.0 | 0 |
| 166860.0 | 0 |
| 166305.0 | 0 |
| 165752.0 | 0 |
| 165200.0 | 0 |
| 164650.0 | 0 |
| 164103.0 | 0 |
| 163557.0 | 0 |
| 163012.0 | 0 |
| 162470.0 | 0 |
| 161929.0 | 0 |
| 161391.0 | 0 |
| 160854.0 | 0 |
| 160318.0 | 0 |
| 159785.0 | 0 |
| 159253.0 | 0 |
| 158723.0 | 0 |
| 158195.0 | 0 |
| 157669.0 | 0 |
| 157144.0 | 0 |
| 156621.0 | 0 |
| 156100.0 | 0 |
| 155581.0 | 0 |
| 155063.0 | 0 |
| 154547.0 | 0 |
| 154033.0 | 0 |
| 153520.0 | 0 |
| 153009.0 | 0 |
| 152500.0 | 0 |
| 151993.0 | 0 |
| 151487.0 | 0 |
| 150983.0 | 0 |
| 150481.0 | 0 |
| 149980.0 | 0 |
| 149481.0 | 0 |
| 148984.0 | 0 |
| 148488.0 | 0 |
| 147994.0 | 0 |
| 147501.0 | 0 |
| 147010.0 | 0 |
| 146521.0 | 0 |
| 146034.0 | 0 |
| 145548.0 | 0 |
| 145064.0 | 0 |
| 144581.0 | 0 |
| 144100.0 | 0 |
| 143620.0 | 0 |
| 143142.0 | 0 |
| 142666.0 | 0 |
| 142191.0 | 0 |
| 141718.0 | 0 |
| 141247.0 | 0 |
| 140777.0 | 0 |
| 140308.0 | 0 |
| 139841.0 | 0 |
| 139376.0 | 0 |
| 138912.0 | 0 |
| 138450.0 | 0 |
| 137989.0 | 0 |
| 137530.0 | 0 |
| 137073.0 | 0 |
| 136617.0 | 0 |
| 136162.0 | 0 |
| 135709.0 | 0 |
| 135257.0 | 0 |
| 134807.0 | 0 |
| 134359.0 | 0 |
| 133912.0 | 0 |
| 133466.0 | 0 |
| 133022.0 | 0 |
| 132579.0 | 0 |
| 132138.0 | 0 |
| 131699.0 | 0 |
| 131260.0 | 0 |
| 130824.0 | 0 |
| 130388.0 | 0 |
| 129954.0 | 0 |
| 129522.0 | 0 |
| 129091.0 | 0 |
| 128662.0 | 0 |
| 128233.0 | 0 |
| 127807.0 | 0 |
| 127381.0 | 0 |
| 126958.0 | 0 |
| 126535.0 | 0 |
| 126114.0 | 0 |
| 125694.0 | 0 |
| 125276.0 | 0 |
| 124859.0 | 0 |
| 124444.0 | 0 |
| 124030.0 | 0 |
| 123617.0 | 0 |
| 123206.0 | 0 |
| 122796.0 | 0 |
| 122387.0 | 0 |
| 121980.0 | 0 |
| 121574.0 | 0 |
| 121170.0 | 0 |
| 120766.0 | 0 |
| 120365.0 | 0 |
| 119964.0 | 0 |
| 119565.0 | 0 |
| 119167.0 | 0 |
| 118771.0 | 0 |
| 118375.0 | 0 |
| 117981.0 | 0 |
| 117589.0 | 0 |
| 117198.0 | 0 |
| 116808.0 | 0 |
| 116419.0 | 0 |
| 116032.0 | 0 |
| 115646.0 | 0 |
| 115261.0 | 0 |
| 114877.0 | 0 |
| 114495.0 | 0 |
| 114114.0 | 0 |
| 113734.0 | 0 |
| 113356.0 | 0 |
| 112979.0 | 0 |
| 112603.0 | 0 |
| 112228.0 | 0 |
| 111855.0 | 0 |
| 111482.0 | 0 |
| 111112.0 | 0 |
| 110742.0 | 0 |
| 110373.0 | 0 |
| 110006.0 | 0 |
| 109640.0 | 0 |
| 109275.0 | 0 |
| 108912.0 | 0 |
| 108549.0 | 0 |
| 108188.0 | 0 |
| 107828.0 | 0 |
| 107469.0 | 0 |
| 107112.0 | 0 |
| 106755.0 | 0 |
| 106400.0 | 0 |
| 106046.0 | 0 |
| 105693.0 | 0 |
| 105341.0 | 0 |
| 104991.0 | 0 |
| 104642.0 | 0 |
| 104293.0 | 0 |
| 103946.0 | 0 |
| 103600.0 | 0 |
| 103256.0 | 0 |
| 102912.0 | 0 |
| 102570.0 | 0 |
| 102228.0 | 0 |
| 101888.0 | 0 |
| 101549.0 | 0 |
| 101211.0 | 0 |
| 100875.0 | 0 |
| 100539.0 | 0 |
| 100204.0 | 0 |
| 99871.0 | 0 |
| 99538.7 | 0 |
| 99207.5 | 0 |
| 98877.4 | 0 |
| 98548.4 | 0 |
| 98220.4 | 0 |
| 97893.6 | 0 |
| 97567.9 | 0 |
| 97243.2 | 0 |
| 96919.7 | 0 |
| 96597.2 | 0 |
| 96275.8 | 0 |
| 95955.4 | 0 |
| 95636.1 | 0 |
| 95317.9 | 0 |
| 95000.7 | 0 |
| 94684.6 | 0 |
| 94369.6 | 0 |
| 94055.6 | 0 |
| 93742.6 | 0 |
| 93430.7 | 0 |
| 93119.8 | 0 |
| 92809.9 | 0 |
| 92501.1 | 0 |
| 92193.3 | 0 |
| 91886.6 | 0 |
| 91580.8 | 0 |
| 91276.1 | 0 |
| 90972.4 | 0 |
| 90669.7 | 0 |
| 90368.0 | 0 |
| 90067.3 | 0 |
| 89767.6 | 0 |
| 89468.9 | 0 |
| 89171.2 | 0 |
| 88874.5 | 0 |
| 88578.8 | 0 |
| 88284.0 | 0 |
| 87990.3 | 0 |
| 87697.5 | 0 |
| 87405.7 | 0 |
| 87114.9 | 0 |
| 86825.0 | 0 |
| 86536.1 | 0 |
| 86248.1 | 0 |
| 85961.2 | 0 |
| 85675.1 | 0 |
| 85390.1 | 0 |
| 85105.9 | 0 |
| 84822.7 | 0 |
| 84540.5 | 0 |
| 84259.2 | 0 |
| 83978.8 | 0 |
| 83699.4 | 0 |
| 83420.9 | 0 |
| 83143.3 | 0 |
| 82866.7 | 0 |
| 82590.9 | 0 |
| 82316.1 | 0 |
| 82042.2 | 0 |
| 81769.2 | 0 |
| 81497.1 | 0 |
| 81226.0 | 0 |
| 80955.7 | 0 |
| 80686.3 | 0 |
| 80417.9 | 0 |
| 80150.3 | 0 |
| 79883.6 | 0 |
| 79617.8 | 0 |
| 79352.8 | 0 |
| 79088.8 | 0 |
| 78825.6 | 0 |
| 78563.4 | 0 |
| 78301.9 | 0 |
| 78041.4 | 0 |
| 77781.7 | 0 |
| 77522.9 | 0 |
| 77265.0 | 0 |
| 77007.9 | 0 |
| 76751.6 | 0 |
| 76496.2 | 0 |
| 76241.7 | 0 |
| 75988.0 | 0 |
| 75735.2 | 0 |
| 75483.2 | 0 |
| 75232.0 | 0 |
| 74981.7 | 0 |
| 74732.2 | 0 |
| 74483.5 | 0 |
| 74235.7 | 0 |
| 73988.7 | 0 |
| 73742.5 | 0 |
| 73497.1 | 0 |
| 73252.5 | 0 |
| 73008.8 | 0 |
| 72765.9 | 0 |
| 72523.7 | 0 |
| 72282.4 | 0 |
| 72041.9 | 0 |
| 71802.2 | 0 |
| 71563.3 | 0 |
| 71325.2 | 0 |
| 71087.8 | 0 |
| 70851.3 | 0 |
| 70615.5 | 0 |
| 70380.6 | 0 |
| 70146.4 | 0 |
| 69913.0 | 0 |
| 69680.3 | 0 |
| 69448.5 | 0 |
| 69217.4 | 0 |
| 68987.1 | 0 |
| 68757.5 | 0 |
| 68528.8 | 0 |
| 68300.7 | 0 |
| 68073.5 | 0 |
| 67847.0 | 0 |
| 67621.2 | 0 |
| 67396.2 | 0 |
| 67171.9 | 0 |
| 66948.4 | 0 |
| 66725.7 | 0 |
| 66503.6 | 0 |
| 66282.4 | 0 |
| 66061.8 | 0 |
| 65842.0 | 0 |
| 65622.9 | 0 |
| 65404.6 | 0 |
| 65186.9 | 0 |
| 64970.0 | 0 |
| 64753.8 | 0 |
| 64538.4 | 0 |
| 64323.6 | 0 |
| 64109.6 | 0 |
| 63896.3 | 0 |
| 63683.7 | 0 |
| 63471.8 | 0 |
| 63260.6 | 0 |
| 63050.1 | 0 |
| 62840.3 | 0 |
| 62631.2 | 0 |
| 62422.8 | 0 |
| 62215.1 | 0 |
| 62008.1 | 0 |
| 61801.7 | 0 |
| 61596.1 | 0 |
| 61391.1 | 0 |
| 61186.9 | 0 |
| 60983.3 | 0 |
| 60780.3 | 0 |
| 60578.1 | 0 |
| 60376.5 | 0 |
| 60175.6 | 0 |
| 59975.4 | 0 |
| 59775.8 | 0 |
| 59576.9 | 0 |
| 59378.7 | 0 |
| 59181.1 | 0 |
| 58984.2 | 0 |
| 58787.9 | 0 |
| 58592.3 | 0 |
| 58397.4 | 0 |
| 58203.1 | 0 |
| 58009.4 | 0 |
| 57816.4 | 0 |
| 57624.0 | 0 |
| 57432.3 | 0 |
| 57241.2 | 0 |
| 57050.7 | 0 |
| 56860.9 | 0 |
| 56671.7 | 0 |
| 56483.1 | 0 |
| 56295.1 | 0 |
| 56107.8 | 0 |
| 55921.1 | 0 |
| 55735.1 | 0 |
| 55549.6 | 0 |
| 55364.8 | 0 |
| 55180.5 | 0 |
| 54996.9 | 0 |
| 54813.9 | 0 |
| 54631.5 | 0 |
| 54449.8 | 0 |
| 54268.6 | 0 |
| 54088.0 | 0 |
| 53908.0 | 0 |
| 53728.7 | 0 |
| 53549.9 | 0 |
| 53371.7 | 0 |
| 53194.1 | 0 |
| 53017.1 | 0 |
| 52840.7 | 0 |
| 52664.9 | 0 |
| 52489.6 | 0 |
| 52315.0 | 0 |
| 52140.9 | 0 |
| 51967.4 | 0 |
| 51794.5 | 0 |
| 51622.2 | 0 |
| 51450.4 | 0 |
| 51279.2 | 0 |
| 51108.6 | 0 |
| 50938.5 | 0 |
| 50769.0 | 0 |
| 50600.1 | 0 |
| 50431.7 | 0 |
| 50263.9 | 0 |
| 50096.7 | 0 |
| 49930.0 | 0 |
| 49763.8 | 0 |
| 49598.2 | 0 |
| 49433.2 | 0 |
| 49268.7 | 0 |
| 49104.8 | 0 |
| 48941.4 | 0 |
| 48778.5 | 0 |
| 48616.2 | 0 |
| 48454.5 | 0 |
| 48293.2 | 0 |
| 48132.5 | 0 |
| 47972.4 | 0 |
| 47812.8 | 0 |
| 47653.7 | 0 |
| 47495.1 | 0 |
| 47337.1 | 0 |
| 47179.6 | 0 |
| 47022.6 | 0 |
| 46866.1 | 0 |
| 46710.2 | 0 |
| 46554.7 | 0 |
| 46399.8 | 0 |
| 46245.4 | 0 |
| 46091.6 | 0 |
| 45938.2 | 0 |
| 45785.3 | 0 |
| 45633.0 | 0 |
| 45481.2 | 0 |
| 45329.8 | 0 |
| 45179.0 | 0 |
| 45028.7 | 0 |
| 44878.8 | 0 |
| 44729.5 | 0 |
| 44580.7 | 0 |
| 44432.3 | 0 |
| 44284.5 | 0 |
| 44137.1 | 0 |
| 43990.3 | 0 |
| 43843.9 | 0 |
| 43698.0 | 0 |
| 43552.6 | 0 |
| 43407.7 | 0 |
| 43263.2 | 0 |
| 43119.3 | 0 |
| 42975.8 | 0 |
| 42832.8 | 0 |
| 42690.3 | 0 |
| 42548.2 | 0 |
| 42406.7 | 0 |
| 42265.6 | 0 |
| 42124.9 | 0 |
| 41984.8 | 0 |
| 41845.1 | 0 |
| 41705.8 | 0 |
| 41567.1 | 0 |
| 41428.7 | 0 |
| 41290.9 | 0 |
| 41153.5 | 0 |
| 41016.6 | 0 |
| 40880.1 | 0 |
| 40744.1 | 0 |
| 40608.5 | 0 |
| 40473.4 | 0 |
| 40338.7 | 0 |
| 40204.5 | 0 |
| 40070.7 | 0 |
| 39937.4 | 0 |
| 39804.5 | 0 |
| 39672.0 | 0 |
| 39540.0 | 0 |
| 39408.5 | 0 |
| 39277.3 | 0 |
| 39146.6 | 0 |
| 39016.4 | 0 |
| 38886.6 | 0 |
| 38757.2 | 0 |
| 38628.2 | 0 |
| 38499.7 | 0 |
| 38371.6 | 0 |
| 38243.9 | 0 |
| 38116.6 | 0 |
| 37989.8 | 0 |
| 37863.4 | 0 |
| 37737.4 | 0 |
| 37611.8 | 0 |
| 37486.7 | 0 |
| 37361.9 | 0 |
| 37237.6 | 0 |
| 37113.7 | 0 |
| 36990.2 | 0 |
| 36867.1 | 0 |
| 36744.5 | 0 |
| 36622.2 | 0 |
| 36500.4 | 0 |
| 36378.9 | 0 |
| 36257.9 | 0 |
| 36137.2 | 0 |
| 36017.0 | 0 |
| 35897.1 | 0 |
| 35777.7 | 0 |
| 35658.6 | 0 |
| 35540.0 | 0 |
| 35421.7 | 0 |
| 35303.9 | 0 |
| 35186.4 | 0 |
| 35069.3 | 0 |
| 34952.6 | 0 |
| 34836.3 | 0 |
| 34720.4 | 0 |
| 34604.9 | 0 |
| 34489.7 | 0 |
| 34375.0 | 0 |
| 34260.6 | 0 |
| 34146.6 | 0 |
| 34033.0 | 0 |
| 33919.7 | 0 |
| 33806.9 | 0 |
| 33694.4 | 0 |
| 33582.3 | 0 |
| 33470.5 | 0 |
| 33359.1 | 0 |
| 33248.1 | 0 |
| 33137.5 | 0 |
| 33027.2 | 0 |
| 32917.4 | 0 |
| 32807.8 | 0 |
| 32698.7 | 0 |
| 32589.9 | 0 |
| 32481.4 | 0 |
| 32373.3 | 0 |
| 32265.6 | 0 |
| 32158.3 | 0 |
| 32051.2 | 0 |
| 31944.6 | 0 |
| 31838.3 | 0 |
| 31732.4 | 0 |
| 31626.8 | 0 |
| 31521.5 | 0 |
| 31416.7 | 0 |
| 31312.1 | 0 |
| 31207.9 | 0 |
| 31104.1 | 0 |
| 31000.6 | 0 |
| 30897.4 | 0 |
| 30794.6 | 0 |
| 30692.2 | 0 |
| 30590.0 | 0 |
| 30488.3 | 0 |
| 30386.8 | 0 |
| 30285.7 | 0 |
| 30184.9 | 0 |
| 30084.5 | 0 |
| 29984.4 | 0 |
| 29884.6 | 0 |
| 29785.2 | 0 |
| 29686.1 | 0 |
| 29587.3 | 0 |
| 29488.8 | 0 |
| 29390.7 | 0 |
| 29292.9 | 0 |
| 29195.5 | 0 |
| 29098.3 | 0 |
| 29001.5 | 0 |
| 28905.0 | 0 |
| 28808.8 | 0 |
| 28712.9 | 0 |
| 28617.4 | 0 |
| 28522.2 | 0 |
| 28427.3 | 0 |
| 28332.7 | 0 |
| 28238.4 | 0 |
| 28144.5 | 0 |
| 28050.8 | 0 |
| 27957.5 | 0 |
| 27864.4 | 0 |
| 27771.7 | 0 |
| 27679.3 | 0 |
| 27587.2 | 0 |
| 27495.4 | 0 |
| 27403.9 | 0 |
| 27312.7 | 0 |
| 27221.9 | 0 |
| 27131.3 | 0 |
| 27041.0 | 0 |
| 26951.0 | 0 |
| 26861.4 | 0 |
| 26772.0 | 0 |
| 26682.9 | 0 |
| 26594.1 | 0 |
| 26505.6 | 0 |
| 26417.4 | 0 |
| 26329.5 | 0 |
| 26241.9 | 0 |
| 26154.6 | 0 |
| 26067.6 | 0 |
| 25980.8 | 0 |
| 25894.4 | 0 |
| 25808.2 | 0 |
| 25722.3 | 0 |
| 25636.8 | 0 |
| 25551.5 | 0 |
| 25466.4 | 0 |
| 25381.7 | 0 |
| 25297.2 | 0 |
| 25213.1 | 0 |
| 25129.2 | 0 |
| 25045.6 | 0 |
| 24962.2 | 0 |
| 24879.2 | 0 |
| 24796.4 | 0 |
| 24713.9 | 0 |
| 24631.6 | 0 |
| 24549.7 | 0 |
| 24468.0 | 0 |
| 24386.6 | 0 |
| 24305.4 | 0 |
| 24224.5 | 0 |
| 24143.9 | 0 |
| 24063.6 | 0 |
| 23983.5 | 0 |
| 23903.7 | 0 |
| 23824.2 | 0 |
| 23744.9 | 0 |
| 23665.9 | 0 |
| 23587.2 | 0 |
| 23508.7 | 0 |
| 23430.5 | 0 |
| 23352.5 | 0 |
| 23274.8 | 0 |
| 23197.3 | 0 |
| 23120.2 | 0 |
| 23043.2 | 0 |
| 22966.6 | 0 |
| 22890.1 | 0 |
| 22814.0 | 0 |
| 22738.1 | 0 |
| 22662.4 | 0 |
| 22587.0 | 0 |
| 22511.8 | 0 |
| 22436.9 | 0 |
| 22362.3 | 0 |
| 22287.9 | 0 |
| 22213.7 | 0 |
| 22139.8 | 0 |
| 22066.1 | 0 |
| 21992.7 | 0 |
| 21919.5 | 0 |
| 21846.6 | 0 |
| 21773.9 | 0 |
| 21701.4 | 0 |
| 21629.2 | 0 |
| 21557.3 | 0 |
| 21485.5 | 0 |
| 21414.0 | 0 |
| 21342.8 | 0 |
| 21271.8 | 0 |
| 21201.0 | 0 |
| 21130.4 | 0 |
| 21060.1 | 0 |
| 20990.1 | 0 |
| 20920.2 | 0 |
| 20850.6 | 0 |
| 20781.2 | 0 |
| 20712.1 | 0 |
| 20643.2 | 0 |
| 20574.5 | 0 |
| 20506.0 | 0 |
| 20437.8 | 0 |
| 20369.8 | 0 |
| 20302.0 | 0 |
| 20234.4 | 0 |
| 20167.1 | 0 |
| 20100.0 | 0 |
| 20033.1 | 0 |
| 19966.5 | 0 |
| 19900.0 | 0 |
| 19833.8 | 0 |
| 19767.8 | 0 |
| 19702.0 | 0 |
| 19636.5 | 0 |
| 19571.1 | 0 |
| 19506.0 | 0 |
| 19441.1 | 0 |
| 19376.4 | 0 |
| 19312.0 | 0 |
| 19247.7 | 0 |
| 19183.7 | 0 |
| 19119.8 | 0 |
| 19056.2 | 0 |
| 18992.8 | 0 |
| 18929.6 | 0 |
| 18866.6 | 0 |
| 18803.8 | 0 |
| 18741.3 | 0 |
| 18678.9 | 0 |
| 18616.8 | 0 |
| 18554.8 | 0 |
| 18493.1 | 0 |
| 18431.5 | 0 |
| 18370.2 | 0 |
| 18309.1 | 0 |
| 18248.2 | 0 |
| 18187.4 | 0 |
| 18126.9 | 0 |
| 18066.6 | 0 |
| 18006.5 | 0 |
| 17946.6 | 0 |
| 17886.9 | 0 |
| 17827.3 | 0 |
| 17768.0 | 0 |
| 17708.9 | 0 |
| 17650.0 | 0 |
| 17591.2 | 0 |
| 17532.7 | 0 |
| 17474.4 | 0 |
| 17416.2 | 0 |
| 17358.3 | 0 |
| 17300.5 | 0 |
| 17243.0 | 0 |
| 17185.6 | 0 |
| 17128.4 | 0 |
| 17071.4 | 0 |
| 17014.6 | 0 |
| 16958.0 | 0 |
| 16901.6 | 0 |
| 16845.3 | 0 |
| 16789.3 | 0 |
| 16733.4 | 0 |
| 16677.7 | 0 |
| 16622.2 | 0 |
| 16566.9 | 0 |
| 16511.8 | 0 |
| 16456.9 | 0 |
| 16402.1 | 0 |
| 16347.5 | 0 |
| 16293.1 | 0 |
| 16238.9 | 0 |
| 16184.9 | 0 |
| 16131.0 | 0 |
| 16077.3 | 0 |
| 16023.8 | 0 |
| 15970.5 | 0 |
| 15917.4 | 0 |
| 15864.4 | 0 |
| 15811.6 | 0 |
| 15759.0 | 0 |
| 15706.6 | 0 |
| 15654.3 | 0 |
| 15602.2 | 0 |
| 15550.3 | 0 |
| 15498.6 | 0 |
| 15447.0 | 0 |
| 15395.6 | 0 |
| 15344.4 | 0 |
| 15293.3 | 0 |
| 15242.4 | 0 |
| 15191.7 | 0 |
| 15141.2 | 0 |
| 15090.8 | 0 |
| 15040.6 | 0 |
| 14990.5 | 0 |
| 14940.7 | 0 |
| 14890.9 | 0 |
| 14841.4 | 0 |
| 14792.0 | 0 |
| 14742.8 | 0 |
| 14693.7 | 0 |
| 14644.8 | 0 |
| 14596.1 | 0 |
| 14547.5 | 0 |
| 14499.1 | 0 |
| 14450.9 | 0 |
| 14402.8 | 0 |
| 14354.9 | 0 |
| 14307.1 | 0 |
| 14259.5 | 0 |
| 14212.1 | 0 |
| 14164.8 | 0 |
| 14117.6 | 0 |
| 14070.7 | 0 |
| 14023.8 | 0 |
| 13977.2 | 0 |
| 13930.7 | 0 |
| 13884.3 | 0 |
| 13838.1 | 0 |
| 13792.1 | 0 |
| 13746.2 | 0 |
| 13700.4 | 0 |
| 13654.9 | 0 |
| 13609.4 | 0 |
| 13564.1 | 0 |
| 13519.0 | 0 |
| 13474.0 | 0 |
| 13429.2 | 0 |
| 13384.5 | 0 |
| 13340.0 | 0 |
| 13295.6 | 0 |
| 13251.3 | 0 |
| 13207.2 | 0 |
| 13163.3 | 0 |
| 13119.5 | 0 |
| 13075.8 | 0 |
| 13032.3 | 0 |
| 12989.0 | 0 |
| 12945.8 | 0 |
| 12902.7 | 0 |
| 12859.7 | 0 |
| 12817.0 | 0 |
| 12774.3 | 0 |
| 12731.8 | 0 |
| 12689.4 | 0 |
| 12647.2 | 0 |
| 12605.1 | 0 |
| 12563.2 | 0 |
| 12521.4 | 0 |
| 12479.7 | 0 |
| 12438.2 | 0 |
| 12396.8 | 0 |
| 12355.6 | 0 |
| 12314.5 | 0 |
| 12273.5 | 0 |
| 12232.6 | 0 |
| 12191.9 | 0 |
| 12151.4 | 0 |
| 12110.9 | 0 |
| 12070.6 | 0 |
| 12030.5 | 0 |
| 11990.4 | 0 |
| 11950.5 | 0 |
| 11910.8 | 0 |
| 11871.1 | 0 |
| 11831.6 | 0 |
| 11792.3 | 0 |
| 11753.0 | 0 |
| 11713.9 | 0 |
| 11675.0 | 0 |
| 11636.1 | 0 |
| 11597.4 | 0 |
| 11558.8 | 0 |
| 11520.3 | 0 |
| 11482.0 | 0 |
| 11443.8 | 0 |
| 11405.7 | 0 |
| 11367.8 | 0 |
| 11329.9 | 0 |
| 11292.2 | 0 |
| 11254.7 | 0 |
| 11217.2 | 0 |
| 11179.9 | 0 |
| 11142.7 | 0 |
| 11105.6 | 0 |
| 11068.7 | 0 |
| 11031.8 | 0 |
| 10995.1 | 0 |
| 10958.5 | 0 |
| 10922.1 | 0 |
| 10885.7 | 0 |
| 10849.5 | 0 |
| 10813.4 | 0 |
| 10777.4 | 0 |
| 10741.6 | 0 |
| 10705.8 | 0 |
| 10670.2 | 0 |
| 10634.7 | 0 |
| 10599.3 | 0 |
| 10564.1 | 0 |
| 10528.9 | 0 |
| 10493.9 | 0 |
| 10458.9 | 0 |
| 10424.1 | 0 |
| 10389.5 | 0 |
| 10354.9 | 0 |
| 10320.4 | 0 |
| 10286.1 | 0 |
| 10251.9 | 0 |
| 10217.8 | 0 |
| 10183.8 | 0 |
| 10149.9 | 0 |
| 10116.1 | 0 |
| 10082.4 | 0 |
| 10048.9 | 0 |
| 10015.5 | 0 |
| 9982.13 | 0 |
| 9948.91 | 0 |
| 9915.81 | 0 |
| 9882.81 | 0 |
| 9849.93 | 0 |
| 9817.16 | 0 |
| 9784.49 | 0 |
| 9751.93 | 0 |
| 9719.48 | 0 |
| 9687.14 | 0 |
| 9654.91 | 0 |
| 9622.78 | 0 |
| 9590.76 | 0 |
| 9558.85 | 0 |
| 9527.05 | 0 |
| 9495.35 | 0 |
| 9463.75 | 0 |
| 9432.26 | 0 |
| 9400.87 | 0 |
| 9369.59 | 0 |
| 9338.42 | 0 |
| 9307.34 | 0 |
| 9276.38 | 0 |
| 9245.51 | 0 |
| 9214.75 | 0 |
| 9184.08 | 0 |
| 9153.52 | 0 |
| 9123.07 | 0 |
| 9092.71 | 0 |
| 9062.46 | 0 |
| 9032.3 | 0 |
| 9002.25 | 0 |
| 8972.29 | 0 |
| 8942.44 | 0 |
| 8912.68 | 0 |
| 8883.03 | 0 |
| 8853.47 | 0 |
| 8824.01 | 0 |
| 8794.65 | 0 |
| 8765.38 | 0 |
| 8736.22 | 0 |
| 8707.15 | 0 |
| 8678.18 | 0 |
| 8649.3 | 0 |
| 8620.52 | 0 |
| 8591.84 | 0 |
| 8563.25 | 0 |
| 8534.75 | 0 |
| 8506.36 | 0 |
| 8478.05 | 0 |
| 8449.84 | 0 |
| 8421.73 | 0 |
| 8393.7 | 0 |
| 8365.77 | 0 |
| 8337.94 | 0 |
| 8310.19 | 0 |
| 8282.54 | 0 |
| 8254.98 | 0 |
| 8227.51 | 0 |
| 8200.14 | 0 |
| 8172.85 | 0 |
| 8145.66 | 0 |
| 8118.55 | 0 |
| 8091.54 | 0 |
| 8064.62 | 0 |
| 8037.78 | 0 |
| 8011.04 | 0 |
| 7984.38 | 0 |
| 7957.81 | 0 |
| 7931.33 | 0 |
| 7904.94 | 0 |
| 7878.64 | 0 |
| 7852.42 | 0 |
| 7826.3 | 0 |
| 7800.25 | 0 |
| 7774.3 | 0 |
| 7748.43 | 0 |
| 7722.65 | 0 |
| 7696.95 | 0 |
| 7671.34 | 0 |
| 7645.82 | 0 |
| 7620.38 | 0 |
| 7595.02 | 0 |
| 7569.75 | 0 |
| 7544.56 | 0 |
| 7519.46 | 0 |
| 7494.44 | 0 |
| 7469.5 | 0 |
| 7444.64 | 0 |
| 7419.87 | 0 |
| 7395.18 | 0 |
| 7370.58 | 0 |
| 7346.05 | 0 |
| 7321.61 | 0 |
| 7297.25 | 0 |
| 7272.96 | 0 |
| 7248.76 | 0 |
| 7224.64 | 0 |
| 7200.61 | 0 |
| 7176.65 | 0 |
| 7152.77 | 0 |
| 7128.97 | 0 |
| 7105.24 | 0 |
| 7081.6 | 0 |
| 7058.04 | 0 |
| 7034.55 | 0 |
| 7011.15 | 0 |
| 6987.82 | 0 |
| 6964.57 | 0 |
| 6941.39 | 0 |
| 6918.3 | 0 |
| 6895.28 | 0 |
| 6872.33 | 0 |
| 6849.47 | 0 |
| 6826.67 | 0 |
| 6803.96 | 0 |
| 6781.32 | 0 |
| 6758.75 | 0 |
| 6736.27 | 0 |
| 6713.85 | 0 |
| 6691.51 | 0 |
| 6669.25 | 0 |
| 6647.05 | 0 |
| 6624.94 | 0 |
| 6602.89 | 0 |
| 6580.92 | 0 |
| 6559.02 | 0 |
| 6537.2 | 0 |
| 6515.45 | 0 |
| 6493.77 | 0 |
| 6472.16 | 0 |
| 6450.63 | 0 |
| 6429.16 | 0 |
| 6407.77 | 0 |
| 6386.45 | 0 |
| 6365.2 | 0 |
| 6344.02 | 0 |
| 6322.91 | 0 |
| 6301.87 | 0 |
| 6280.9 | 0 |
| 6260.0 | 0 |
| 6239.17 | 0 |
| 6218.41 | 0 |
| 6197.72 | 0 |
| 6177.1 | 0 |
| 6156.54 | 0 |
| 6136.06 | 0 |
| 6115.64 | 0 |
| 6095.29 | 0 |
| 6075.01 | 0 |
| 6054.8 | 0 |
| 6034.65 | 0 |
| 6014.57 | 0 |
| 5994.56 | 0 |
| 5974.61 | 0 |
| 5954.73 | 0 |
| 5934.92 | 0 |
| 5915.17 | 0 |
| 5895.49 | 0 |
| 5875.87 | 0 |
| 5856.32 | 0 |
| 5836.83 | 0 |
| 5817.41 | 0 |
| 5798.05 | 0 |
| 5778.76 | 0 |
| 5759.53 | 0 |
| 5740.37 | 0 |
| 5721.27 | 0 |
| 5702.23 | 0 |
| 5683.25 | 0 |
| 5664.34 | 0 |
| 5645.5 | 0 |
| 5626.71 | 0 |
| 5607.99 | 0 |
| 5589.33 | 0 |
| 5570.73 | 0 |
| 5552.2 | 0 |
| 5533.72 | 0 |
| 5515.31 | 0 |
| 5496.96 | 0 |
| 5478.67 | 0 |
| 5460.44 | 0 |
| 5442.27 | 0 |
| 5424.16 | 0 |
| 5406.11 | 0 |
| 5388.12 | 0 |
| 5370.19 | 0 |
| 5352.32 | 0 |
| 5334.51 | 0 |
| 5316.76 | 0 |
| 5299.07 | 0 |
| 5281.44 | 0 |
| 5263.87 | 0 |
| 5246.35 | 0 |
| 5228.89 | 0 |
| 5211.5 | 0 |
| 5194.15 | 0 |
| 5176.87 | 0 |
| 5159.65 | 0 |
| 5142.48 | 0 |
| 5125.37 | 0 |
| 5108.31 | 0 |
| 5091.31 | 0 |
| 5074.37 | 0 |
| 5057.49 | 0 |
| 5040.66 | 0 |
| 5023.89 | 0 |
| 5007.17 | 0 |
| 4990.51 | 0 |
| 4973.91 | 0 |
| 4957.35 | 0 |
| 4940.86 | 0 |
| 4924.42 | 0 |
| 4908.03 | 0 |
| 4891.7 | 0 |
| 4875.43 | 0 |
| 4859.2 | 0 |
| 4843.03 | 0 |
| 4826.92 | 0 |
| 4810.86 | 0 |
| 4794.85 | 0 |
| 4778.9 | 0 |
| 4763.0 | 0 |
| 4747.15 | 0 |
| 4731.35 | 0 |
| 4715.61 | 0 |
| 4699.92 | 0 |
| 4684.28 | 0 |
| 4668.69 | 0 |
| 4653.16 | 0 |
| 4637.67 | 0 |
| 4622.24 | 0 |
| 4606.86 | 0 |
| 4591.53 | 0 |
| 4576.26 | 0 |
| 4561.03 | 0 |
| 4545.85 | 0 |
| 4530.73 | 0 |
| 4515.65 | 0 |
| 4500.62 | 0 |
| 4485.65 | 0 |
| 4470.72 | 0 |
| 4455.85 | 0 |
| 4441.02 | 0 |
| 4426.24 | 0 |
| 4411.52 | 0 |
| 4396.84 | 0 |
| 4382.21 | 0 |
| 4367.63 | 0 |
| 4353.09 | 0 |
| 4338.61 | 0 |
| 4324.17 | 0 |
| 4309.78 | 0 |
| 4295.44 | 0 |
| 4281.15 | 0 |
| 4266.9 | 0 |
| 4252.71 | 0 |
| 4238.56 | 0 |
| 4224.45 | 0 |
| 4210.4 | 0 |
| 4196.39 | 0 |
| 4182.42 | 0 |
| 4168.51 | 0 |
| 4154.64 | 0 |
| 4140.81 | 0 |
| 4127.03 | 0 |
| 4113.3 | 0 |
| 4099.61 | 0 |
| 4085.97 | 0 |
| 4072.38 | 0 |
| 4058.83 | 0 |
| 4045.32 | 0 |
| 4031.86 | 0 |
| 4018.45 | 0 |
| 4005.07 | 0 |
| 3991.75 | 0 |
| 3978.47 | 0 |
| 3965.23 | 0 |
| 3952.03 | 0 |
| 3938.88 | 0 |
| 3925.78 | 0 |
| 3912.71 | 0 |
| 3899.7 | 0 |
| 3886.72 | 0 |
| 3873.79 | 0 |
| 3860.9 | 0 |
| 3848.05 | 0 |
| 3835.25 | 0 |
| 3822.48 | 0 |
| 3809.77 | 0 |
| 3797.09 | 0 |
| 3784.45 | 0 |
| 3771.86 | 0 |
| 3759.31 | 0 |
| 3746.8 | 0 |
| 3734.34 | 0 |
| 3721.91 | 0 |
| 3709.53 | 0 |
| 3697.18 | 0 |
| 3684.88 | 0 |
| 3672.62 | 0 |
| 3660.4 | 0 |
| 3648.22 | 0 |
| 3636.08 | 0 |
| 3623.98 | 0 |
| 3611.92 | 0 |
| 3599.9 | 0 |
| 3587.93 | 0 |
| 3575.99 | 0 |
| 3564.09 | 0 |
| 3552.23 | 0 |
| 3540.41 | 0 |
| 3528.63 | 0 |
| 3516.89 | 0 |
| 3505.19 | 0 |
| 3493.52 | 0 |
| 3481.9 | 0 |
| 3470.31 | 0 |
| 3458.76 | 0 |
| 3447.26 | 0 |
| 3435.79 | 0 |
| 3424.35 | 0 |
| 3412.96 | 0 |
| 3401.6 | 0 |
| 3390.28 | 0 |
| 3379.0 | 0 |
| 3367.76 | 0 |
| 3356.55 | 0 |
| 3345.38 | 0 |
| 3334.25 | 0 |
| 3323.16 | 0 |
| 3312.1 | 0 |
| 3301.08 | 0 |
| 3290.1 | 0 |
| 3279.15 | 0 |
| 3268.24 | 0 |
| 3257.36 | 0 |
| 3246.52 | 0 |
| 3235.72 | 0 |
| 3224.96 | 0 |
| 3214.22 | 0 |
| 3203.53 | 0 |
| 3192.87 | 0 |
| 3182.25 | 0 |
| 3171.66 | 0 |
| 3161.1 | 0 |
| 3150.59 | 0 |
| 3140.1 | 0 |
| 3129.65 | 0 |
| 3119.24 | 0 |
| 3108.86 | 0 |
| 3098.52 | 0 |
| 3088.21 | 0 |
| 3077.93 | 0 |
| 3067.69 | 0 |
| 3057.48 | 0 |
| 3047.31 | 0 |
| 3037.17 | 0 |
| 3027.06 | 0 |
| 3016.99 | 0 |
| 3006.95 | 0 |
| 2996.95 | 0 |
| 2986.97 | 0 |
| 2977.03 | 0 |
| 2967.13 | 0 |
| 2957.26 | 0 |
| 2947.42 | 0 |
| 2937.61 | 0 |
| 2927.83 | 0 |
| 2918.09 | 0 |
| 2908.38 | 0 |
| 2898.7 | 0 |
| 2889.06 | 0 |
| 2879.45 | 0 |
| 2869.87 | 0 |
| 2860.32 | 0 |
| 2850.8 | 0 |
| 2841.31 | 0 |
| 2831.86 | 0 |
| 2822.44 | 0 |
| 2813.04 | 0 |
| 2803.68 | 0 |
| 2794.35 | 0 |
| 2785.06 | 0 |
| 2775.79 | 0 |
| 2766.55 | 0 |
| 2757.35 | 0 |
| 2748.17 | 0 |
| 2739.03 | 0 |
| 2729.92 | 0 |
| 2720.83 | 0 |
| 2711.78 | 0 |
| 2702.75 | 0 |
| 2693.76 | 0 |
| 2684.8 | 0 |
| 2675.86 | 0 |
| 2666.96 | 0 |
| 2658.09 | 0 |
| 2649.24 | 0 |
| 2640.43 | 0 |
| 2631.64 | 0 |
| 2622.89 | 0 |
| 2614.16 | 0 |
| 2605.46 | 0 |
| 2596.79 | 0 |
| 2588.15 | 0 |
| 2579.54 | 0 |
| 2570.95 | 0 |
| 2562.4 | 0 |
| 2553.87 | 0 |
| 2545.38 | 0 |
| 2536.91 | 0 |
| 2528.46 | 0 |
| 2520.05 | 0 |
| 2511.67 | 0 |
| 2503.31 | 0 |
| 2494.98 | 0 |
| 2486.68 | 0 |
| 2478.4 | 0 |
| 2470.16 | 0 |
| 2461.94 | 0 |
| 2453.75 | 0 |
| 2445.58 | 0 |
| 2437.44 | 0 |
| 2429.33 | 0 |
| 2421.25 | 0 |
| 2413.19 | 0 |
| 2405.16 | 0 |
| 2397.16 | 0 |
| 2389.18 | 0 |
| 2381.23 | 0 |
| 2373.31 | 0 |
| 2365.41 | 0 |
| 2357.54 | 0 |
| 2349.7 | 0 |
| 2341.88 | 0 |
| 2334.09 | 0 |
| 2326.32 | 0 |
| 2318.58 | 0 |
| 2310.87 | 0 |
| 2303.18 | 0 |
| 2295.51 | 0 |
| 2287.87 | 0 |
| 2280.26 | 0 |
| 2272.67 | 0 |
| 2265.11 | 0 |
| 2257.57 | 0 |
| 2250.06 | 0 |
| 2242.58 | 0 |
| 2235.11 | 0 |
| 2227.68 | 0 |
| 2220.26 | 0 |
| 2212.88 | 0 |
| 2205.51 | 0 |
| 2198.17 | 0 |
| 2190.86 | 0 |
| 2183.57 | 0 |
| 2176.31 | 0 |
| 2169.06 | 0 |
| 2161.85 | 0 |
| 2154.65 | 0 |
| 2147.48 | 0 |
| 2140.34 | 0 |
| 2133.22 | 0 |
| 2126.12 | 0 |
| 2119.04 | 0 |
| 2111.99 | 0 |
| 2104.96 | 0 |
| 2097.96 | 0 |
| 2090.98 | 0 |
| 2084.02 | 0 |
| 2077.09 | 0 |
| 2070.18 | 0 |
| 2063.29 | 0 |
| 2056.42 | 0 |
| 2049.58 | 0 |
| 2042.76 | 0 |
| 2035.96 | 0 |
| 2029.19 | 0 |
| 2022.44 | 0 |
| 2015.71 | 0 |
| 2009.0 | 0 |
| 2002.32 | 0 |
| 1995.65 | 0 |
| 1989.01 | 0 |
| 1982.39 | 0 |
| 1975.8 | 0 |
| 1969.22 | 0 |
| 1962.67 | 0 |
| 1956.14 | 0 |
| 1949.63 | 0 |
| 1943.14 | 0 |
| 1936.68 | 0 |
| 1930.23 | 0 |
| 1923.81 | 0 |
| 1917.41 | 0 |
| 1911.03 | 0 |
| 1904.67 | 0 |
| 1898.33 | 0 |
| 1892.02 | 0 |
| 1885.72 | 0 |
| 1879.45 | 0 |
| 1873.19 | 0 |
| 1866.96 | 0 |
| 1860.75 | 0 |
| 1854.56 | 0 |
| 1848.39 | 0 |
| 1842.24 | 0 |
| 1836.11 | 0 |
| 1830.0 | 0 |
| 1823.91 | 0 |
| 1817.84 | 0 |
| 1811.79 | 0 |
| 1805.76 | 0 |
| 1799.75 | 0 |
| 1793.76 | 0 |
| 1787.8 | 0 |
| 1781.85 | 0 |
| 1775.92 | 0 |
| 1770.01 | 0 |
| 1764.12 | 0 |
| 1758.25 | 0 |
| 1752.4 | 0 |
| 1746.57 | 0 |
| 1740.76 | 0 |
| 1734.96 | 0 |
| 1729.19 | 0 |
| 1723.44 | 0 |
| 1717.7 | 0 |
| 1711.99 | 0 |
| 1706.29 | 0 |
| 1700.61 | 0 |
| 1694.95 | 0 |
| 1689.31 | 0 |
| 1683.69 | 0 |
| 1678.09 | 0 |
| 1672.51 | 0 |
| 1666.94 | 0 |
| 1661.4 | 0 |
| 1655.87 | 0 |
| 1650.36 | 0 |
| 1644.87 | 0 |
| 1639.39 | 0 |
| 1633.94 | 0 |
| 1628.5 | 0 |
| 1623.08 | 0 |
| 1617.68 | 0 |
| 1612.3 | 0 |
| 1606.93 | 0 |
| 1601.59 | 0 |
| 1596.26 | 0 |
| 1590.95 | 0 |
| 1585.65 | 0 |
| 1580.38 | 0 |
| 1575.12 | 0 |
| 1569.88 | 0 |
| 1564.65 | 0 |
| 1559.45 | 0 |
| 1554.26 | 0 |
| 1549.09 | 0 |
| 1543.93 | 0 |
| 1538.79 | 0 |
| 1533.67 | 0 |
| 1528.57 | 0 |
| 1523.49 | 0 |
| 1518.42 | 0 |
| 1513.36 | 0 |
| 1508.33 | 0 |
| 1503.31 | 0 |
| 1498.31 | 0 |
| 1493.32 | 0 |
| 1488.35 | 0 |
| 1483.4 | 0 |
| 1478.46 | 0 |
| 1473.54 | 0 |
| 1468.64 | 0 |
| 1463.75 | 0 |
| 1458.88 | 0 |
| 1454.03 | 0 |
| 1449.19 | 0 |
| 1444.37 | 0 |
| 1439.56 | 0 |
| 1434.77 | 0 |
| 1430.0 | 0 |
| 1425.24 | 0 |
| 1420.5 | 0 |
| 1415.77 | 0 |
| 1411.06 | 0 |
| 1406.37 | 0 |
| 1401.69 | 0 |
| 1397.02 | 0 |
| 1392.37 | 0 |
| 1387.74 | 0 |
| 1383.12 | 0 |
| 1378.52 | 0 |
| 1373.93 | 0 |
| 1369.36 | 0 |
| 1364.81 | 0 |
| 1360.27 | 0 |
| 1355.74 | 0 |
| 1351.23 | 0 |
| 1346.73 | 0 |
| 1342.25 | 0 |
| 1337.78 | 0 |
| 1333.33 | 0 |
| 1328.9 | 0 |
| 1324.47 | 0 |
| 1320.07 | 0 |
| 1315.68 | 0 |
| 1311.3 | 0 |
| 1306.93 | 0 |
| 1302.59 | 0 |
| 1298.25 | 0 |
| 1293.93 | 0 |
| 1289.63 | 0 |
| 1285.33 | 0 |
| 1281.06 | 0 |
| 1276.8 | 0 |
| 1272.55 | 0 |
| 1268.31 | 0 |
| 1264.09 | 0 |
| 1259.89 | 0 |
| 1255.69 | 0 |
| 1251.52 | 0 |
| 1247.35 | 0 |
| 1243.2 | 0 |
| 1239.06 | 0 |
| 1234.94 | 0 |
| 1230.83 | 0 |
| 1226.74 | 0 |
| 1222.65 | 0 |
| 1218.59 | 0 |
| 1214.53 | 0 |
| 1210.49 | 0 |
| 1206.46 | 0 |
| 1202.45 | 0 |
| 1198.45 | 0 |
| 1194.46 | 0 |
| 1190.48 | 0 |
| 1186.52 | 0 |
| 1182.58 | 0 |
| 1178.64 | 0 |
| 1174.72 | 0 |
| 1170.81 | 0 |
| 1166.91 | 0 |
| 1163.03 | 0 |
| 1159.16 | 0 |
| 1155.3 | 0 |
| 1151.46 | 0 |
| 1147.63 | 0 |
| 1143.81 | 0 |
| 1140.0 | 0 |
| 1136.21 | 0 |
| 1132.43 | 0 |
| 1128.66 | 0 |
| 1124.91 | 0 |
| 1121.16 | 0 |
| 1117.43 | 0 |
| 1113.72 | 0 |
| 1110.01 | 0 |
| 1106.32 | 0 |
| 1102.63 | 0 |
| 1098.97 | 0 |
| 1095.31 | 0 |
| 1091.66 | 0 |
| 1088.03 | 0 |
| 1084.41 | 0 |
| 1080.8 | 0 |
| 1077.21 | 0 |
| 1073.62 | 0 |
| 1070.05 | 0 |
| 1066.49 | 0 |
| 1062.94 | 0 |
| 1059.4 | 0 |
| 1055.88 | 0 |
| 1052.37 | 0 |
| 1048.86 | 0 |
| 1045.37 | 0 |
| 1041.9 | 0 |
| 1038.43 | 0 |
| 1034.97 | 0 |
| 1031.53 | 0 |
| 1028.1 | 0 |
| 1024.68 | 0 |
| 1021.27 | 0 |
| 1017.87 | 0 |
| 1014.48 | 0 |
| 1011.11 | 0 |
| 1007.74 | 0 |
| 1004.39 | 0 |
| 1001.05 | 0 |
| 997.716 | 0 |
| 994.396 | 0 |
| 991.087 | 0 |
| 987.79 | 0 |
| 984.503 | 0 |
| 981.227 | 0 |
| 977.962 | 0 |
| 974.708 | 0 |
| 971.465 | 0 |
| 968.232 | 0 |
| 965.01 | 0 |
| 961.799 | 0 |
| 958.599 | 0 |
| 955.409 | 0 |
| 952.23 | 0 |
| 949.062 | 0 |
| 945.904 | 0 |
| 942.757 | 0 |
| 939.62 | 0 |
| 936.493 | 0 |
| 933.377 | 0 |
| 930.271 | 0 |
| 927.176 | 0 |
| 924.091 | 0 |
| 921.016 | 0 |
| 917.951 | 0 |
| 914.897 | 0 |
| 911.853 | 0 |
| 908.818 | 0 |
| 905.794 | 0 |
| 902.78 | 0 |
| 899.777 | 0 |
| 896.783 | 0 |
| 893.799 | 0 |
| 890.825 | 0 |
| 887.86 | 0 |
| 884.906 | 0 |
| 881.962 | 0 |
| 879.027 | 0 |
| 876.102 | 0 |
| 873.187 | 0 |
| 870.281 | 0 |
| 867.386 | 0 |
| 864.5 | 0 |
| 861.623 | 0 |
| 858.756 | 0 |
| 855.899 | 0 |
| 853.051 | 0 |
| 850.212 | 0 |
| 847.383 | 0 |
| 844.564 | 0 |
| 841.753 | 0 |
| 838.952 | 0 |
| 836.161 | 0 |
| 833.379 | 0 |
| 830.606 | 0 |
| 827.842 | 0 |
| 825.087 | 0 |
| 822.342 | 0 |
| 819.606 | 0 |
| 816.878 | 0 |
| 814.16 | 0 |
| 811.451 | 0 |
| 808.751 | 0 |
| 806.06 | 0 |
| 803.378 | 0 |
| 800.705 | 0 |
| 798.041 | 0 |
| 795.385 | 0 |
| 792.739 | 0 |
| 790.101 | 0 |
| 787.472 | 0 |
| 784.852 | 0 |
| 782.24 | 0 |
| 779.637 | 0 |
| 777.043 | 0 |
| 774.457 | 0 |
| 771.881 | 0 |
| 769.312 | 0 |
| 766.752 | 0 |
| 764.201 | 0 |
| 761.658 | 0 |
| 759.124 | 0 |
| 756.598 | 0 |
| 754.08 | 0 |
| 751.571 | 0 |
| 749.07 | 0 |
| 746.578 | 0 |
| 744.094 | 0 |
| 741.618 | 0 |
| 739.15 | 0 |
| 736.691 | 0 |
| 734.239 | 0 |
| 731.796 | 0 |
| 729.361 | 0 |
| 726.934 | 0 |
| 724.516 | 0 |
| 722.105 | 0 |
| 719.702 | 0 |
| 717.307 | 0 |
| 714.921 | 0 |
| 712.542 | 0 |
| 710.171 | 0 |
| 707.808 | 0 |
| 705.453 | 0 |
| 703.105 | 0 |
| 700.766 | 0 |
| 698.434 | 0 |
| 696.11 | 0 |
| 693.794 | 0 |
| 691.485 | 0 |
| 689.184 | 0 |
| 686.891 | 0 |
| 684.606 | 0 |
| 682.328 | 0 |
| 680.057 | 0 |
| 677.794 | 0 |
| 675.539 | 0 |
| 673.291 | 0 |
| 671.051 | 0 |
| 668.818 | 0 |
| 666.593 | 0 |
| 664.375 | 0 |
| 662.164 | 0 |
| 659.961 | 0 |
| 657.765 | 0 |
| 655.576 | 0 |
| 653.395 | 0 |
| 651.22 | 0 |
| 649.054 | 0 |
| 646.894 | 0 |
| 644.741 | 0 |
| 642.596 | 0 |
| 640.458 | 0 |
| 638.327 | 0 |
| 636.203 | 0 |
| 634.086 | 0 |
| 631.976 | 0 |
| 629.873 | 0 |
| 627.777 | 0 |
| 625.688 | 0 |
| 623.607 | 0 |
| 621.532 | 0 |
| 619.463 | 0 |
| 617.402 | 0 |
| 615.348 | 0 |
| 613.3 | 0 |
| 611.26 | 0 |
| 609.226 | 0 |
| 607.199 | 0 |
| 605.178 | 0 |
| 603.164 | 0 |
| 601.157 | 0 |
| 599.157 | 0 |
| 597.163 | 0 |
| 595.177 | 0 |
| 593.196 | 0 |
| 591.222 | 0 |
| 589.255 | 0 |
| 587.294 | 0 |
| 585.34 | 0 |
| 583.393 | 0 |
| 581.451 | 0 |
| 579.517 | 0 |
| 577.588 | 0 |
| 575.666 | 0 |
| 573.751 | 0 |
| 571.842 | 0 |
| 569.939 | 0 |
| 568.043 | 0 |
| 566.153 | 0 |
| 564.269 | 0 |
| 562.391 | 0 |
| 560.52 | 0 |
| 558.655 | 0 |
| 556.796 | 0 |
| 554.943 | 0 |
| 553.097 | 0 |
| 551.256 | 0 |
| 549.422 | 0 |
| 547.594 | 0 |
| 545.772 | 0 |
| 543.956 | 0 |
| 542.146 | 0 |
| 540.342 | 0 |
| 538.544 | 0 |
| 536.752 | 0 |
| 534.966 | 0 |
| 533.186 | 0 |
| 531.412 | 0 |
| 529.643 | 0 |
| 527.881 | 0 |
| 526.125 | 0 |
| 524.374 | 0 |
| 522.629 | 0 |
| 520.89 | 0 |
| 519.157 | 0 |
| 517.429 | 0 |
| 515.708 | 0 |
| 513.992 | 0 |
| 512.282 | 0 |
| 510.577 | 0 |
| 508.878 | 0 |
| 507.185 | 0 |
| 505.497 | 0 |
| 503.815 | 0 |
| 502.139 | 0 |
| 500.468 | 0 |
| 498.803 | 0 |
| 497.143 | 0 |
| 495.489 | 0 |
| 493.84 | 0 |
| 492.197 | 0 |
| 490.559 | 0 |
| 488.927 | 0 |
| 487.3 | 0 |
| 485.678 | 0 |
| 484.062 | 0 |
| 482.452 | 0 |
| 480.846 | 0 |
| 479.246 | 0 |
| 477.652 | 0 |
| 476.062 | 0 |
| 474.478 | 0 |
| 472.9 | 0 |
| 471.326 | 0 |
| 469.758 | 0 |
| 468.195 | 0 |
| 466.637 | 0 |
| 465.084 | 0 |
| 463.537 | 0 |
| 461.994 | 0 |
| 460.457 | 0 |
| 458.925 | 0 |
| 457.398 | 0 |
| 455.876 | 0 |
| 454.359 | 0 |
| 452.847 | 0 |
| 451.34 | 0 |
| 449.838 | 0 |
| 448.342 | 0 |
| 446.85 | 0 |
| 445.363 | 0 |
| 443.881 | 0 |
| 442.404 | 0 |
| 440.932 | 0 |
| 439.465 | 0 |
| 438.003 | 0 |
| 436.545 | 0 |
| 435.093 | 0 |
| 433.645 | 0 |
| 432.202 | 0 |
| 430.764 | 0 |
| 429.33 | 0 |
| 427.902 | 0 |
| 426.478 | 0 |
| 425.059 | 0 |
| 423.645 | 0 |
| 422.235 | 0 |
| 420.83 | 0 |
| 419.43 | 0 |
| 418.034 | 0 |
| 416.643 | 0 |
| 415.257 | 0 |
| 413.875 | 0 |
| 412.498 | 0 |
| 411.125 | 0 |
| 409.757 | 0 |
| 408.394 | 0 |
| 407.035 | 0 |
| 405.681 | 0 |
| 404.331 | 0 |
| 402.985 | 0 |
| 401.645 | 0 |
| 400.308 | 0 |
| 398.976 | 0 |
| 397.649 | 0 |
| 396.325 | 0 |
| 395.007 | 0 |
| 393.692 | 0 |
| 392.382 | 0 |
| 391.077 | 0 |
| 389.775 | 0 |
| 388.478 | 0 |
| 387.186 | 0 |
| 385.898 | 0 |
| 384.613 | 0 |
| 383.334 | 0 |
| 382.058 | 0 |
| 380.787 | 0 |
| 379.52 | 0 |
| 378.257 | 0 |
| 376.998 | 0 |
| 375.744 | 0 |
| 374.494 | 0 |
| 373.248 | 0 |
| 372.006 | 0 |
| 370.768 | 0 |
| 369.534 | 0 |
| 368.305 | 0 |
| 367.079 | 0 |
| 365.858 | 0 |
| 364.64 | 0 |
| 363.427 | 0 |
| 362.218 | 0 |
| 361.012 | 0 |
| 359.811 | 0 |
| 358.614 | 0 |
| 357.421 | 0 |
| 356.231 | 0 |
| 355.046 | 0 |
| 353.865 | 0 |
| 352.687 | 0 |
| 351.514 | 0 |
| 350.344 | 0 |
| 349.178 | 0 |
| 348.016 | 0 |
| 346.858 | 0 |
| 345.704 | 0 |
| 344.554 | 0 |
| 343.408 | 0 |
| 342.265 | 0 |
| 341.126 | 0 |
| 339.991 | 0 |
| 338.86 | 0 |
| 337.732 | 0 |
| 336.608 | 0 |
| 335.488 | 0 |
| 334.372 | 0 |
| 333.259 | 0 |
| 332.15 | 0 |
| 331.045 | 0 |
| 329.944 | 0 |
| 328.846 | 0 |
| 327.752 | 0 |
| 326.661 | 0 |
| 325.574 | 0 |
| 324.491 | 0 |
| 323.411 | 0 |
| 322.335 | 0 |
| 321.262 | 0 |
| 320.193 | 0 |
| 319.128 | 0 |
| 318.066 | 0 |
| 317.008 | 0 |
| 315.953 | 0 |
| 314.902 | 0 |
| 313.854 | 0 |
| 312.81 | 0 |
| 311.769 | 0 |
| 310.731 | 0 |
| 309.697 | 0 |
| 308.667 | 0 |
| 307.64 | 0 |
| 306.616 | 0 |
| 305.596 | 0 |
| 304.579 | 0 |
| 303.566 | 0 |
| 302.556 | 0 |
| 301.549 | 0 |
| 300.545 | 0 |
| 299.545 | 0 |
| 298.549 | 0 |
| 297.555 | 0 |
| 296.565 | 0 |
| 295.578 | 0 |
| 294.595 | 0 |
| 293.615 | 0 |
| 292.638 | 0 |
| 291.664 | 0 |
| 290.693 | 0 |
| 289.726 | 0 |
| 288.762 | 0 |
| 287.801 | 0 |
| 286.844 | 0 |
| 285.889 | 0 |
| 284.938 | 0 |
| 283.99 | 0 |
| 283.045 | 0 |
| 282.103 | 0 |
| 281.164 | 0 |
| 280.229 | 0 |
| 279.296 | 0 |
| 278.367 | 0 |
| 277.441 | 0 |
| 276.518 | 0 |
| 275.598 | 0 |
| 274.681 | 0 |
| 273.767 | 0 |
| 272.856 | 0 |
| 271.948 | 0 |
| 271.043 | 0 |
| 270.141 | 0 |
| 269.242 | 0 |
| 268.346 | 0 |
| 267.453 | 0 |
| 266.563 | 0 |
| 265.676 | 0 |
| 264.792 | 0 |
| 263.911 | 0 |
| 263.033 | 0 |
| 262.158 | 0 |
| 261.286 | 0 |
| 260.416 | 0 |
| 259.55 | 0 |
| 258.686 | 0 |
| 257.825 | 0 |
| 256.967 | 0 |
| 256.112 | 0 |
| 255.26 | 0 |
| 254.411 | 0 |
| 253.564 | 0 |
| 252.721 | 0 |
| 251.88 | 0 |
| 251.042 | 0 |
| 250.206 | 0 |
| 249.374 | 0 |
| 248.544 | 0 |
| 247.717 | 0 |
| 246.893 | 0 |
| 246.071 | 0 |
| 245.252 | 0 |
| 244.436 | 0 |
| 243.623 | 0 |
| 242.812 | 0 |
| 242.004 | 0 |
| 241.199 | 0 |
| 240.397 | 0 |
| 239.597 | 0 |
| 238.799 | 0 |
| 238.005 | 0 |
| 237.213 | 0 |
| 236.424 | 0 |
| 235.637 | 0 |
| 234.853 | 0 |
| 234.071 | 0 |
| 233.293 | 0 |
| 232.516 | 0 |
| 231.743 | 0 |
| 230.971 | 0 |
| 230.203 | 0 |
| 229.437 | 0 |
| 228.674 | 0.001 |
| 227.913 | 0.001 |
| 227.154 | 0.001 |
| 226.398 | 0.001 |
| 225.645 | 0.001 |
| 224.894 | 0.001 |
| 224.146 | 0.001 |
| 223.4 | 0.001 |
| 222.657 | 0.001 |
| 221.916 | 0.001 |
| 221.178 | 0.001 |
| 220.442 | 0.001 |
| 219.708 | 0.001 |
| 218.977 | 0.001 |
| 218.248 | 0.001 |
| 217.522 | 0.001 |
| 216.798 | 0.001 |
| 216.077 | 0.001 |
| 215.358 | 0.001 |
| 214.641 | 0.001 |
| 213.927 | 0.001 |
| 213.215 | 0.001 |
| 212.506 | 0.001 |
| 211.799 | 0.001 |
| 211.094 | 0.001 |
| 210.392 | 0.001 |
| 209.692 | 0.001 |
| 208.994 | 0.001 |
| 208.299 | 0.001 |
| 207.605 | 0.001 |
| 206.915 | 0.001 |
| 206.226 | 0.001 |
| 205.54 | 0.001 |
| 204.856 | 0.001 |
| 204.174 | 0.001 |
| 203.495 | 0.001 |
| 202.818 | 0.001 |
| 202.143 | 0.001 |
| 201.47 | 0.001 |
| 200.8 | 0.001 |
| 200.132 | 0.001 |
| 199.466 | 0.001 |
| 198.802 | 0.001 |
| 198.141 | 0.001 |
| 197.481 | 0.001 |
| 196.824 | 0.001 |
| 196.169 | 0.001 |
| 195.517 | 0.001 |
| 194.866 | 0.001 |
| 194.218 | 0.001 |
| 193.571 | 0.001 |
| 192.927 | 0.001 |
| 192.285 | 0.001 |
| 191.646 | 0.001 |
| 191.008 | 0.001 |
| 190.372 | 0.001 |
| 189.739 | 0.001 |
| 189.108 | 0.001 |
| 188.478 | 0.001 |
| 187.851 | 0.001 |
| 187.226 | 0.001 |
| 186.603 | 0.001 |
| 185.982 | 0.001 |
| 185.363 | 0.001 |
| 184.747 | 0.001 |
| 184.132 | 0.001 |
| 183.519 | 0.001 |
| 182.909 | 0.001 |
| 182.3 | 0.001 |
| 181.693 | 0.001 |
| 181.089 | 0.001 |
| 180.486 | 0.001 |
| 179.886 | 0.001 |
| 179.287 | 0.001 |
| 178.691 | 0.001 |
| 178.096 | 0.001 |
| 177.503 | 0.001 |
| 176.913 | 0.001 |
| 176.324 | 0.001 |
| 175.737 | 0.001 |
| 175.153 | 0.001 |
| 174.57 | 0.001 |
| 173.989 | 0.001 |
| 173.41 | 0.001 |
| 172.833 | 0.001 |
| 172.258 | 0.001 |
| 171.685 | 0.001 |
| 171.113 | 0.001 |
| 170.544 | 0.001 |
| 169.977 | 0.001 |
| 169.411 | 0.001 |
| 168.847 | 0.001 |
| 168.286 | 0.001 |
| 167.726 | 0.001 |
| 167.167 | 0.002 |
| 166.611 | 0.002 |
| 166.057 | 0.002 |
| 165.504 | 0.002 |
| 164.954 | 0.002 |
| 164.405 | 0.002 |
| 163.858 | 0.002 |
| 163.312 | 0.002 |
| 162.769 | 0.002 |
| 162.227 | 0.002 |
| 161.688 | 0.002 |
| 161.15 | 0.002 |
| 160.613 | 0.002 |
| 160.079 | 0.002 |
| 159.546 | 0.002 |
| 159.015 | 0.002 |
| 158.486 | 0.002 |
| 157.959 | 0.002 |
| 157.433 | 0.002 |
| 156.91 | 0.002 |
| 156.387 | 0.002 |
| 155.867 | 0.002 |
| 155.348 | 0.002 |
| 154.832 | 0.002 |
| 154.316 | 0.002 |
| 153.803 | 0.002 |
| 153.291 | 0.002 |
| 152.781 | 0.002 |
| 152.273 | 0.002 |
| 151.766 | 0.002 |
| 151.261 | 0.002 |
| 150.758 | 0.002 |
| 150.256 | 0.002 |
| 149.756 | 0.002 |
| 149.258 | 0.002 |
| 148.761 | 0.002 |
| 148.266 | 0.002 |
| 147.773 | 0.002 |
| 147.281 | 0.002 |
| 146.791 | 0.002 |
| 146.303 | 0.002 |
| 145.816 | 0.002 |
| 145.331 | 0.002 |
| 144.847 | 0.002 |
| 144.365 | 0.003 |
| 143.885 | 0.003 |
| 143.406 | 0.003 |
| 142.929 | 0.003 |
| 142.453 | 0.003 |
| 141.979 | 0.003 |
| 141.507 | 0.003 |
| 141.036 | 0.003 |
| 140.567 | 0.003 |
| 140.099 | 0.003 |
| 139.633 | 0.003 |
| 139.168 | 0.003 |
| 138.705 | 0.003 |
| 138.244 | 0.003 |
| 137.784 | 0.003 |
| 137.325 | 0.003 |
| 136.868 | 0.003 |
| 136.413 | 0.003 |
| 135.959 | 0.003 |
| 135.506 | 0.003 |
| 135.056 | 0.003 |
| 134.606 | 0.003 |
| 134.158 | 0.003 |
| 133.712 | 0.003 |
| 133.267 | 0.003 |
| 132.823 | 0.003 |
| 132.382 | 0.003 |
| 131.941 | 0.003 |
| 131.502 | 0.003 |
| 131.064 | 0.004 |
| 130.628 | 0.004 |
| 130.194 | 0.004 |
| 129.76 | 0.004 |
| 129.329 | 0.004 |
| 128.898 | 0.004 |
| 128.469 | 0.004 |
| 128.042 | 0.004 |
| 127.616 | 0.004 |
| 127.191 | 0.004 |
| 126.768 | 0.004 |
| 126.346 | 0.004 |
| 125.926 | 0.004 |
| 125.507 | 0.004 |
| 125.089 | 0.004 |
| 124.673 | 0.004 |
| 124.258 | 0.004 |
| 123.845 | 0.004 |
| 123.433 | 0.004 |
| 123.022 | 0.004 |
| 122.613 | 0.004 |
| 122.205 | 0.004 |
| 121.798 | 0.005 |
| 121.393 | 0.005 |
| 120.989 | 0.005 |
| 120.586 | 0.005 |
| 120.185 | 0.005 |
| 119.785 | 0.005 |
| 119.386 | 0.005 |
| 118.989 | 0.005 |
| 118.593 | 0.005 |
| 118.199 | 0.005 |
| 117.805 | 0.005 |
| 117.413 | 0.005 |
| 117.023 | 0.005 |
| 116.633 | 0.005 |
| 116.245 | 0.005 |
| 115.858 | 0.005 |
| 115.473 | 0.005 |
| 115.089 | 0.006 |
| 114.706 | 0.006 |
| 114.324 | 0.006 |
| 113.944 | 0.006 |
| 113.565 | 0.006 |
| 113.187 | 0.006 |
| 112.81 | 0.006 |
| 112.435 | 0.006 |
| 112.061 | 0.006 |
| 111.688 | 0.006 |
| 111.316 | 0.006 |
| 110.946 | 0.006 |
| 110.577 | 0.006 |
| 110.209 | 0.006 |
| 109.842 | 0.007 |
| 109.476 | 0.007 |
| 109.112 | 0.007 |
| 108.749 | 0.007 |
| 108.387 | 0.007 |
| 108.027 | 0.007 |
| 107.667 | 0.007 |
| 107.309 | 0.007 |
| 106.952 | 0.007 |
| 106.596 | 0.007 |
| 106.241 | 0.007 |
| 105.888 | 0.007 |
| 105.535 | 0.008 |
| 105.184 | 0.008 |
| 104.834 | 0.008 |
| 104.485 | 0.008 |
| 104.138 | 0.008 |
| 103.791 | 0.008 |
| 103.446 | 0.008 |
| 103.102 | 0.008 |
| 102.759 | 0.008 |
| 102.417 | 0.008 |
| 102.076 | 0.008 |
| 101.736 | 0.009 |
| 101.398 | 0.009 |
| 101.06 | 0.009 |
| 100.724 | 0.009 |
| 100.389 | 0.009 |
| 100.055 | 0.009 |
| 99.7219 | 0.009 |
| 99.3901 | 0.009 |
| 99.0594 | 0.009 |
| 98.7298 | 0.009 |
| 98.4013 | 0.01 |
| 98.0738 | 0.01 |
| 97.7475 | 0.01 |
| 97.4223 | 0.01 |
| 97.0981 | 0.01 |
| 96.775 | 0.01 |
| 96.453 | 0.01 |
| 96.1321 | 0.01 |
| 95.8122 | 0.011 |
| 95.4934 | 0.011 |
| 95.1756 | 0.011 |
| 94.8589 | 0.011 |
| 94.5433 | 0.011 |
| 94.2287 | 0.011 |
| 93.9152 | 0.011 |
| 93.6027 | 0.011 |
| 93.2912 | 0.012 |
| 92.9808 | 0.012 |
| 92.6714 | 0.012 |
| 92.3631 | 0.012 |
| 92.0557 | 0.012 |
| 91.7494 | 0.012 |
| 91.4441 | 0.012 |
| 91.1399 | 0.013 |
| 90.8366 | 0.013 |
| 90.5344 | 0.013 |
| 90.2331 | 0.013 |
| 89.9329 | 0.013 |
| 89.6336 | 0.013 |
| 89.3354 | 0.013 |
| 89.0381 | 0.014 |
| 88.7418 | 0.014 |
| 88.4466 | 0.014 |
| 88.1523 | 0.014 |
| 87.8589 | 0.014 |
| 87.5666 | 0.014 |
| 87.2752 | 0.015 |
| 86.9848 | 0.015 |
| 86.6954 | 0.015 |
| 86.4069 | 0.015 |
| 86.1194 | 0.015 |
| 85.8329 | 0.015 |
| 85.5472 | 0.016 |
| 85.2626 | 0.016 |
| 84.9789 | 0.016 |
| 84.6961 | 0.016 |
| 84.4143 | 0.016 |
| 84.1334 | 0.017 |
| 83.8535 | 0.017 |
| 83.5745 | 0.017 |
| 83.2964 | 0.017 |
| 83.0192 | 0.017 |
| 82.743 | 0.018 |
| 82.4677 | 0.018 |
| 82.1933 | 0.018 |
| 81.9198 | 0.018 |
| 81.6472 | 0.018 |
| 81.3755 | 0.019 |
| 81.1047 | 0.019 |
| 80.8349 | 0.019 |
| 80.5659 | 0.019 |
| 80.2978 | 0.02 |
| 80.0306 | 0.02 |
| 79.7643 | 0.02 |
| 79.4989 | 0.02 |
| 79.2344 | 0.02 |
| 78.9707 | 0.021 |
| 78.708 | 0.021 |
| 78.4461 | 0.021 |
| 78.1851 | 0.021 |
| 77.9249 | 0.022 |
| 77.6656 | 0.022 |
| 77.4072 | 0.022 |
| 77.1496 | 0.022 |
| 76.8929 | 0.023 |
| 76.6371 | 0.023 |
| 76.3821 | 0.023 |
| 76.1279 | 0.024 |
| 75.8746 | 0.024 |
| 75.6221 | 0.024 |
| 75.3705 | 0.024 |
| 75.1197 | 0.025 |
| 74.8698 | 0.025 |
| 74.6206 | 0.025 |
| 74.3723 | 0.026 |
| 74.1249 | 0.026 |
| 73.8782 | 0.026 |
| 73.6324 | 0.026 |
| 73.3874 | 0.027 |
| 73.1432 | 0.027 |
| 72.8998 | 0.027 |
| 72.6573 | 0.028 |
| 72.4155 | 0.028 |
| 72.1745 | 0.028 |
| 71.9344 | 0.029 |
| 71.695 | 0.029 |
| 71.4565 | 0.029 |
| 71.2187 | 0.03 |
| 70.9817 | 0.03 |
| 70.7455 | 0.03 |
| 70.5101 | 0.031 |
| 70.2755 | 0.031 |
| 70.0417 | 0.032 |
| 69.8086 | 0.032 |
| 69.5763 | 0.032 |
| 69.3448 | 0.033 |
| 69.1141 | 0.033 |
| 68.8841 | 0.033 |
| 68.6549 | 0.034 |
| 68.4265 | 0.034 |
| 68.1988 | 0.035 |
| 67.9719 | 0.035 |
| 67.7457 | 0.035 |
| 67.5203 | 0.036 |
| 67.2956 | 0.036 |
| 67.0717 | 0.037 |
| 66.8485 | 0.037 |
| 66.6261 | 0.038 |
| 66.4044 | 0.038 |
| 66.1834 | 0.038 |
| 65.9632 | 0.039 |
| 65.7437 | 0.039 |
| 65.525 | 0.04 |
| 65.3069 | 0.04 |
| 65.0896 | 0.041 |
| 64.8731 | 0.041 |
| 64.6572 | 0.042 |
| 64.442 | 0.042 |
| 64.2276 | 0.043 |
| 64.0139 | 0.043 |
| 63.8009 | 0.044 |
| 63.5886 | 0.044 |
| 63.377 | 0.045 |
| 63.1661 | 0.045 |
| 62.956 | 0.046 |
| 62.7465 | 0.046 |
| 62.5377 | 0.047 |
| 62.3296 | 0.047 |
| 62.1222 | 0.048 |
| 61.9155 | 0.049 |
| 61.7095 | 0.049 |
| 61.5042 | 0.05 |
| 61.2995 | 0.05 |
| 61.0955 | 0.051 |
| 60.8922 | 0.052 |
| 60.6896 | 0.052 |
| 60.4877 | 0.053 |
| 60.2864 | 0.053 |
| 60.0858 | 0.054 |
| 59.8859 | 0.055 |
| 59.6866 | 0.055 |
| 59.488 | 0.056 |
| 59.2901 | 0.057 |
| 59.0928 | 0.057 |
| 58.8962 | 0.058 |
| 58.7002 | 0.059 |
| 58.5049 | 0.059 |
| 58.3102 | 0.06 |
| 58.1162 | 0.061 |
| 57.9228 | 0.061 |
| 57.7301 | 0.062 |
| 57.538 | 0.063 |
| 57.3465 | 0.064 |
| 57.1557 | 0.064 |
| 56.9655 | 0.065 |
| 56.776 | 0.066 |
| 56.5871 | 0.067 |
| 56.3988 | 0.067 |
| 56.2111 | 0.068 |
| 56.0241 | 0.069 |
| 55.8377 | 0.07 |
| 55.6519 | 0.071 |
| 55.4667 | 0.071 |
| 55.2821 | 0.072 |
| 55.0982 | 0.073 |
| 54.9148 | 0.074 |
| 54.7321 | 0.075 |
| 54.55 | 0.076 |
| 54.3685 | 0.077 |
| 54.1876 | 0.077 |
| 54.0073 | 0.078 |
| 53.8276 | 0.079 |
| 53.6485 | 0.08 |
| 53.47 | 0.081 |
| 53.292 | 0.082 |
| 53.1147 | 0.083 |
| 52.938 | 0.084 |
| 52.7618 | 0.085 |
| 52.5863 | 0.086 |
| 52.4113 | 0.087 |
| 52.2369 | 0.088 |
| 52.0631 | 0.089 |
| 51.8898 | 0.09 |
| 51.7172 | 0.091 |
| 51.5451 | 0.092 |
| 51.3736 | 0.093 |
| 51.2026 | 0.094 |
| 51.0323 | 0.096 |
| 50.8625 | 0.097 |
| 50.6932 | 0.098 |
| 50.5246 | 0.099 |
| 50.3564 | 0.1 |
| 50.1889 | 0.101 |
| 50.0219 | 0.102 |
| 49.8554 | 0.104 |
| 49.6895 | 0.105 |
| 49.5242 | 0.106 |
| 49.3594 | 0.107 |
| 49.1952 | 0.109 |
| 49.0315 | 0.11 |
| 48.8683 | 0.111 |
| 48.7057 | 0.112 |
| 48.5437 | 0.114 |
| 48.3821 | 0.115 |
| 48.2212 | 0.116 |
| 48.0607 | 0.118 |
| 47.9008 | 0.119 |
| 47.7414 | 0.121 |
| 47.5825 | 0.122 |
| 47.4242 | 0.124 |
| 47.2664 | 0.125 |
| 47.1091 | 0.126 |
| 46.9524 | 0.128 |
| 46.7962 | 0.129 |
| 46.6404 | 0.131 |
| 46.4853 | 0.132 |
| 46.3306 | 0.134 |
| 46.1764 | 0.136 |
| 46.0228 | 0.137 |
| 45.8696 | 0.139 |
| 45.717 | 0.14 |
| 45.5649 | 0.142 |
| 45.4133 | 0.144 |
| 45.2622 | 0.145 |
| 45.1116 | 0.147 |
| 44.9614 | 0.149 |
| 44.8118 | 0.151 |
| 44.6627 | 0.152 |
| 44.5141 | 0.154 |
| 44.366 | 0.156 |
| 44.2184 | 0.158 |
| 44.0712 | 0.16 |
| 43.9246 | 0.162 |
| 43.7785 | 0.163 |
| 43.6328 | 0.165 |
| 43.4876 | 0.167 |
| 43.3429 | 0.169 |
| 43.1987 | 0.171 |
| 43.0549 | 0.173 |
| 42.9117 | 0.175 |
| 42.7689 | 0.177 |
| 42.6266 | 0.179 |
| 42.4847 | 0.182 |
| 42.3434 | 0.184 |
| 42.2025 | 0.186 |
| 42.0621 | 0.188 |
| 41.9221 | 0.19 |
| 41.7826 | 0.192 |
| 41.6436 | 0.195 |
| 41.505 | 0.197 |
| 41.3669 | 0.199 |
| 41.2293 | 0.202 |
| 41.0921 | 0.204 |
| 40.9553 | 0.206 |
| 40.8191 | 0.209 |
| 40.6832 | 0.211 |
| 40.5479 | 0.214 |
| 40.413 | 0.216 |
| 40.2785 | 0.219 |
| 40.1445 | 0.221 |
| 40.0109 | 0.224 |
| 39.8777 | 0.226 |
| 39.7451 | 0.229 |
| 39.6128 | 0.232 |
| 39.481 | 0.235 |
| 39.3496 | 0.237 |
| 39.2187 | 0.24 |
| 39.0882 | 0.243 |
| 38.9581 | 0.246 |
| 38.8285 | 0.249 |
| 38.6993 | 0.252 |
| 38.5705 | 0.255 |
| 38.4422 | 0.258 |
| 38.3143 | 0.261 |
| 38.1868 | 0.264 |
| 38.0597 | 0.267 |
| 37.9331 | 0.27 |
| 37.8069 | 0.273 |
| 37.6811 | 0.276 |
| 37.5557 | 0.28 |
| 37.4307 | 0.283 |
| 37.3062 | 0.286 |
| 37.1821 | 0.289 |
| 37.0583 | 0.293 |
| 36.935 | 0.296 |
| 36.8121 | 0.3 |
| 36.6896 | 0.303 |
| 36.5676 | 0.307 |
| 36.4459 | 0.31 |
| 36.3246 | 0.314 |
| 36.2037 | 0.318 |
| 36.0833 | 0.322 |
| 35.9632 | 0.325 |
| 35.8435 | 0.329 |
| 35.7243 | 0.333 |
| 35.6054 | 0.337 |
| 35.4869 | 0.341 |
| 35.3689 | 0.345 |
| 35.2512 | 0.349 |
| 35.1339 | 0.353 |
| 35.017 | 0.357 |
| 34.9004 | 0.361 |
| 34.7843 | 0.366 |
| 34.6686 | 0.37 |
| 34.5532 | 0.374 |
| 34.4382 | 0.378 |
| 34.3237 | 0.383 |
| 34.2094 | 0.387 |
| 34.0956 | 0.392 |
| 33.9822 | 0.397 |
| 33.8691 | 0.401 |
| 33.7564 | 0.406 |
| 33.6441 | 0.411 |
| 33.5321 | 0.416 |
| 33.4206 | 0.42 |
| 33.3093 | 0.425 |
| 33.1985 | 0.43 |
| 33.088 | 0.435 |
| 32.9779 | 0.44 |
| 32.8682 | 0.446 |
| 32.7589 | 0.451 |
| 32.6498 | 0.456 |
| 32.5412 | 0.462 |
| 32.4329 | 0.467 |
| 32.325 | 0.472 |
| 32.2175 | 0.478 |
| 32.1103 | 0.484 |
| 32.0034 | 0.489 |
| 31.8969 | 0.495 |
| 31.7908 | 0.501 |
| 31.685 | 0.507 |
| 31.5796 | 0.513 |
| 31.4745 | 0.519 |
| 31.3698 | 0.525 |
| 31.2654 | 0.531 |
| 31.1614 | 0.537 |
| 31.0577 | 0.543 |
| 30.9543 | 0.55 |
| 30.8513 | 0.556 |
| 30.7487 | 0.563 |
| 30.6464 | 0.569 |
| 30.5444 | 0.576 |
| 30.4427 | 0.583 |
| 30.3415 | 0.59 |
| 30.2405 | 0.596 |
| 30.1399 | 0.604 |
| 30.0396 | 0.611 |
| 29.9396 | 0.618 |
| 29.84 | 0.625 |
| 29.7407 | 0.632 |
| 29.6418 | 0.64 |
| 29.5431 | 0.647 |
| 29.4448 | 0.655 |
| 29.3468 | 0.663 |
| 29.2492 | 0.67 |
| 29.1519 | 0.678 |
| 29.0549 | 0.686 |
| 28.9582 | 0.694 |
| 28.8618 | 0.702 |
| 28.7658 | 0.711 |
| 28.6701 | 0.719 |
| 28.5747 | 0.727 |
| 28.4796 | 0.736 |
| 28.3848 | 0.744 |
| 28.2904 | 0.753 |
| 28.1963 | 0.762 |
| 28.1024 | 0.771 |
| 28.0089 | 0.78 |
| 27.9157 | 0.789 |
| 27.8228 | 0.798 |
| 27.7303 | 0.808 |
| 27.638 | 0.817 |
| 27.546 | 0.827 |
| 27.4544 | 0.837 |
| 27.363 | 0.846 |
| 27.272 | 0.856 |
| 27.1812 | 0.866 |
| 27.0908 | 0.877 |
| 27.0006 | 0.887 |
| 26.9108 | 0.897 |
| 26.8213 | 0.908 |
| 26.732 | 0.918 |
| 26.6431 | 0.929 |
| 26.5544 | 0.94 |
| 26.4661 | 0.951 |
| 26.378 | 0.962 |
| 26.2902 | 0.974 |
| 26.2027 | 0.985 |
| 26.1156 | 0.997 |
| 26.0287 | 1.008 |
| 25.9421 | 1.02 |
| 25.8557 | 1.032 |
| 25.7697 | 1.044 |
| 25.684 | 1.056 |
| 25.5985 | 1.069 |
| 25.5133 | 1.081 |
| 25.4284 | 1.094 |
| 25.3438 | 1.107 |
| 25.2595 | 1.12 |
| 25.1754 | 1.133 |
| 25.0917 | 1.146 |
| 25.0082 | 1.16 |
| 24.925 | 1.173 |
| 24.842 | 1.187 |
| 24.7594 | 1.201 |
| 24.677 | 1.215 |
| 24.5949 | 1.229 |
| 24.513 | 1.244 |
| 24.4315 | 1.259 |
| 24.3502 | 1.273 |
| 24.2691 | 1.288 |
| 24.1884 | 1.303 |
| 24.1079 | 1.319 |
| 24.0277 | 1.334 |
| 23.9477 | 1.35 |
| 23.8681 | 1.366 |
| 23.7886 | 1.382 |
| 23.7095 | 1.398 |
| 23.6306 | 1.414 |
| 23.552 | 1.431 |
| 23.4736 | 1.448 |
| 23.3955 | 1.465 |
| 23.3176 | 1.482 |
| 23.2401 | 1.499 |
| 23.1627 | 1.517 |
| 23.0857 | 1.535 |
| 23.0088 | 1.553 |
| 22.9323 | 1.571 |
| 22.856 | 1.589 |
| 22.7799 | 1.608 |
| 22.7041 | 1.627 |
| 22.6286 | 1.646 |
| 22.5533 | 1.665 |
| 22.4782 | 1.685 |
| 22.4034 | 1.704 |
| 22.3289 | 1.724 |
| 22.2546 | 1.745 |
| 22.1805 | 1.765 |
| 22.1067 | 1.786 |
| 22.0332 | 1.807 |
| 21.9599 | 1.828 |
| 21.8868 | 1.849 |
| 21.814 | 1.871 |
| 21.7414 | 1.893 |
| 21.669 | 1.915 |
| 21.5969 | 1.938 |
| 21.5251 | 1.96 |
| 21.4535 | 1.984 |
| 21.3821 | 2.007 |
| 21.3109 | 2.03 |
| 21.24 | 2.054 |
| 21.1693 | 2.078 |
| 21.0989 | 2.103 |
| 21.0287 | 2.127 |
| 20.9587 | 2.152 |
| 20.889 | 2.178 |
| 20.8195 | 2.203 |
| 20.7502 | 2.229 |
| 20.6812 | 2.255 |
| 20.6123 | 2.282 |
| 20.5438 | 2.308 |
| 20.4754 | 2.335 |
| 20.4073 | 2.363 |
| 20.3394 | 2.39 |
| 20.2717 | 2.419 |
| 20.2042 | 2.447 |
| 20.137 | 2.476 |
| 20.07 | 2.505 |
| 20.0032 | 2.534 |
| 19.9367 | 2.564 |
| 19.8703 | 2.594 |
| 19.8042 | 2.624 |
| 19.7383 | 2.655 |
| 19.6726 | 2.686 |
| 19.6072 | 2.718 |
| 19.5419 | 2.75 |
| 19.4769 | 2.782 |
| 19.4121 | 2.815 |
| 19.3475 | 2.848 |
| 19.2831 | 2.881 |
| 19.219 | 2.915 |
| 19.155 | 2.949 |
| 19.0913 | 2.984 |
| 19.0278 | 3.019 |
| 18.9644 | 3.054 |
| 18.9013 | 3.09 |
| 18.8385 | 3.126 |
| 18.7758 | 3.163 |
| 18.7133 | 3.2 |
| 18.651 | 3.237 |
| 18.589 | 3.275 |
| 18.5271 | 3.314 |
| 18.4655 | 3.353 |
| 18.404 | 3.392 |
| 18.3428 | 3.432 |
| 18.2817 | 3.472 |
| 18.2209 | 3.513 |
| 18.1603 | 3.554 |
| 18.0999 | 3.596 |
| 18.0396 | 3.638 |
| 17.9796 | 3.681 |
| 17.9198 | 3.724 |
| 17.8602 | 3.768 |
| 17.8007 | 3.812 |
| 17.7415 | 3.856 |
| 17.6825 | 3.902 |
| 17.6236 | 3.948 |
| 17.565 | 3.994 |
| 17.5065 | 4.041 |
| 17.4483 | 4.088 |
| 17.3902 | 4.136 |
| 17.3324 | 4.185 |
| 17.2747 | 4.234 |
| 17.2172 | 4.283 |
| 17.1599 | 4.334 |
| 17.1028 | 4.384 |
| 17.0459 | 4.436 |
| 16.9892 | 4.488 |
| 16.9327 | 4.541 |
| 16.8763 | 4.594 |
| 16.8202 | 4.648 |
| 16.7642 | 4.702 |
| 16.7084 | 4.758 |
| 16.6528 | 4.813 |
| 16.5974 | 4.87 |
| 16.5422 | 4.927 |
| 16.4871 | 4.985 |
| 16.4323 | 5.043 |
| 16.3776 | 5.102 |
| 16.3231 | 5.162 |
| 16.2688 | 5.223 |
| 16.2147 | 5.284 |
| 16.1607 | 5.346 |
| 16.1069 | 5.409 |
| 16.0533 | 5.472 |
| 15.9999 | 5.537 |
| 15.9467 | 5.602 |
| 15.8936 | 5.667 |
| 15.8407 | 5.734 |
| 15.788 | 5.801 |
| 15.7355 | 5.869 |
| 15.6831 | 5.938 |
| 15.631 | 6.008 |
| 15.5789 | 6.078 |
| 15.5271 | 6.149 |
| 15.4754 | 6.222 |
| 15.424 | 6.295 |
| 15.3726 | 6.368 |
| 15.3215 | 6.443 |
| 15.2705 | 6.519 |
| 15.2197 | 6.595 |
| 15.169 | 6.673 |
| 15.1186 | 6.751 |
| 15.0683 | 6.83 |
| 15.0181 | 6.91 |
| 14.9682 | 6.991 |
| 14.9183 | 7.073 |
| 14.8687 | 7.156 |
| 14.8192 | 7.24 |
| 14.7699 | 7.325 |
| 14.7208 | 7.411 |
| 14.6718 | 7.498 |
| 14.623 | 7.586 |
| 14.5743 | 7.675 |
| 14.5258 | 7.765 |
| 14.4775 | 7.856 |
| 14.4293 | 7.948 |
| 14.3813 | 8.042 |
| 14.3335 | 8.136 |
| 14.2858 | 8.232 |
| 14.2382 | 8.328 |
| 14.1909 | 8.426 |
| 14.1436 | 8.525 |
| 14.0966 | 8.625 |
| 14.0497 | 8.726 |
| 14.0029 | 8.828 |
| 13.9563 | 8.932 |
| 13.9099 | 9.037 |
| 13.8636 | 9.143 |
| 13.8175 | 9.25 |
| 13.7715 | 9.359 |
| 13.7257 | 9.468 |
| 13.68 | 9.579 |
| 13.6345 | 9.692 |
| 13.5891 | 9.806 |
| 13.5439 | 9.921 |
| 13.4988 | 10.04 |
| 13.4539 | 10.15 |
| 13.4091 | 10.27 |
| 13.3645 | 10.39 |
| 13.3201 | 10.52 |
| 13.2757 | 10.64 |
| 13.2316 | 10.76 |
| 13.1875 | 10.89 |
| 13.1437 | 11.02 |
| 13.0999 | 11.15 |
| 13.0563 | 11.28 |
| 13.0129 | 11.41 |
| 12.9696 | 11.55 |
| 12.9264 | 11.68 |
| 12.8834 | 11.82 |
| 12.8406 | 11.96 |
| 12.7978 | 12.1 |
| 12.7552 | 12.24 |
| 12.7128 | 12.38 |
| 12.6705 | 12.53 |
| 12.6283 | 12.67 |
| 12.5863 | 12.82 |
| 12.5444 | 12.97 |
| 12.5027 | 13.13 |
| 12.4611 | 13.28 |
| 12.4196 | 13.44 |
| 12.3783 | 13.59 |
| 12.3371 | 13.75 |
| 12.2961 | 13.91 |
| 12.2552 | 14.08 |
| 12.2144 | 14.24 |
| 12.1737 | 14.41 |
| 12.1332 | 14.58 |
| 12.0929 | 14.75 |
| 12.0526 | 14.92 |
| 12.0125 | 15.1 |
| 11.9725 | 15.27 |
| 11.9327 | 15.45 |
| 11.893 | 15.64 |
| 11.8534 | 15.82 |
| 11.814 | 16 |
| 11.7747 | 16.19 |
| 11.7355 | 16.38 |
| 11.6964 | 16.57 |
| 11.6575 | 16.77 |
| 11.6187 | 16.97 |
| 11.5801 | 17.16 |
| 11.5415 | 17.37 |
| 11.5031 | 17.57 |
| 11.4649 | 17.78 |
| 11.4267 | 17.98 |
| 11.3887 | 18.2 |
| 11.3508 | 18.41 |
| 11.313 | 18.63 |
| 11.2754 | 18.84 |
| 11.2379 | 19.06 |
| 11.2005 | 19.29 |
| 11.1632 | 19.51 |
| 11.1261 | 19.74 |
| 11.089 | 19.98 |
| 11.0521 | 20.21 |
| 11.0154 | 20.45 |
| 10.9787 | 20.69 |
| 10.9422 | 20.93 |
| 10.9058 | 21.18 |
| 10.8695 | 21.42 |
| 10.8333 | 21.67 |
| 10.7973 | 21.93 |
| 10.7613 | 22.19 |
| 10.7255 | 22.45 |
| 10.6899 | 22.71 |
| 10.6543 | 22.98 |
| 10.6188 | 23.25 |
| 10.5835 | 23.52 |
| 10.5483 | 23.8 |
| 10.5132 | 24.07 |
| 10.4782 | 24.36 |
| 10.4433 | 24.64 |
| 10.4086 | 24.93 |
| 10.374 | 25.22 |
| 10.3394 | 25.52 |
| 10.305 | 25.82 |
| 10.2707 | 26.12 |
| 10.2366 | 26.43 |
| 10.2025 | 26.74 |
| 10.1686 | 27.05 |
| 10.1347 | 27.37 |
| 10.101 | 27.69 |
| 10.0674 | 28.02 |
| 10.0339 | 28.34 |
| 10.0005 | 28.68 |
| 9.96723 | 28.76 |
| 9.93406 | 28.76 |
| 9.90101 | 28.76 |
| 9.86806 | 28.76 |
| 9.83523 | 28.76 |
| 9.8025 | 28.76 |
| 9.76989 | 28.76 |
| 9.73738 | 28.76 |
| 9.70498 | 28.76 |
| 9.67268 | 28.76 |
| 9.6405 | 28.76 |
| 9.60842 | 28.76 |
| 9.57645 | 28.76 |
| 9.54458 | 28.76 |
| 9.51283 | 28.76 |
| 9.48117 | 28.76 |
| 9.44962 | 28.76 |
| 9.41818 | 28.76 |
| 9.38684 | 28.76 |
| 9.35561 | 28.76 |
| 9.32448 | 28.76 |
| 9.29345 | 28.76 |
| 9.26253 | 28.76 |
| 9.23171 | 28.76 |
| 9.20099 | 28.76 |
| 9.17038 | 28.76 |
| 9.13986 | 28.76 |
| 9.10945 | 28.76 |
| 9.07914 | 28.76 |
| 9.04893 | 28.76 |
| 9.01882 | 28.76 |
| 8.98881 | 28.76 |
| 8.9589 | 28.76 |
| 8.92909 | 28.76 |
| 8.89938 | 28.76 |
| 8.86977 | 28.76 |
| 8.84025 | 28.76 |
| 8.81084 | 28.76 |
| 8.78152 | 28.76 |
| 8.7523 | 28.76 |
| 8.72318 | 28.76 |
| 8.69415 | 28.76 |
| 8.66522 | 28.76 |
| 8.63639 | 28.76 |
| 8.60765 | 28.76 |
| 8.57901 | 28.76 |
| 8.55047 | 28.76 |
| 8.52202 | 28.76 |
| 8.49366 | 28.76 |
| 8.4654 | 28.76 |
| 8.43723 | 28.76 |
| 8.40915 | 28.76 |
| 8.38117 | 28.76 |
| 8.35329 | 28.76 |
| 8.32549 | 28.76 |
| 8.29779 | 28.76 |
| 8.27018 | 28.76 |
| 8.24266 | 28.76 |
| 8.21523 | 28.76 |
| 8.1879 | 28.76 |
| 8.16065 | 28.76 |
| 8.1335 | 28.76 |
| 8.10644 | 28.76 |
| 8.07946 | 28.76 |
| 8.05258 | 28.76 |
| 8.02578 | 28.76 |
| 7.99908 | 28.76 |
| 7.97246 | 28.76 |
| 7.94594 | 28.76 |
| 7.9195 | 28.76 |
| 7.89314 | 28.76 |
| 7.86688 | 28.76 |
| 7.8407 | 28.76 |
| 7.81461 | 28.76 |
| 7.78861 | 28.76 |
| 7.7627 | 28.76 |
| 7.73687 | 28.76 |
| 7.71112 | 28.76 |
| 7.68546 | 28.76 |
| 7.65989 | 28.76 |
| 7.6344 | 28.76 |
| 7.609 | 28.76 |
| 7.58368 | 28.76 |
| 7.55845 | 28.76 |
| 7.5333 | 28.76 |
| 7.50823 | 28.76 |
| 7.48325 | 28.76 |
| 7.45835 | 28.76 |
| 7.43353 | 28.76 |
| 7.4088 | 28.76 |
| 7.38415 | 28.76 |
| 7.35957 | 28.76 |
| 7.33509 | 28.76 |
| 7.31068 | 28.76 |
| 7.28635 | 28.76 |
| 7.26211 | 28.76 |
| 7.23794 | 28.76 |
| 7.21386 | 28.76 |
| 7.18986 | 28.76 |
| 7.16593 | 28.76 |
| 7.14209 | 28.76 |
| 7.11833 | 28.76 |
| 7.09464 | 28.76 |
| 7.07103 | 28.76 |
| 7.0475 | 28.76 |
| 7.02405 | 28.76 |
| 7.00068 | 28.76 |
| 6.97739 | 28.76 |
| 6.95417 | 28.76 |
| 6.93103 | 28.76 |
| 6.90797 | 28.76 |
| 6.88498 | 28.76 |
| 6.86207 | 28.76 |
| 6.83924 | 28.76 |
| 6.81648 | 28.76 |
| 6.7938 | 28.76 |
| 6.7712 | 28.76 |
| 6.74867 | 28.76 |
| 6.72621 | 28.76 |
| 6.70383 | 28.76 |
| 6.68152 | 28.76 |
| 6.65929 | 28.76 |
| 6.63713 | 28.76 |
| 6.61505 | 28.76 |
| 6.59304 | 28.76 |
| 6.5711 | 28.76 |
| 6.54923 | 28.76 |
| 6.52744 | 28.76 |
| 6.50572 | 28.76 |
| 6.48408 | 28.76 |
| 6.4625 | 28.76 |
| 6.441 | 28.76 |
| 6.41957 | 28.76 |
| 6.3982 | 28.76 |
| 6.37691 | 28.76 |
| 6.3557 | 28.76 |
| 6.33455 | 28.76 |
| 6.31347 | 28.76 |
| 6.29246 | 28.76 |
| 6.27153 | 28.76 |
| 6.25066 | 28.76 |
| 6.22986 | 28.76 |
| 6.20913 | 28.76 |
| 6.18847 | 28.76 |
| 6.16788 | 28.76 |
| 6.14735 | 28.76 |
| 6.1269 | 28.76 |
| 6.10651 | 28.76 |
| 6.08619 | 28.76 |
| 6.06594 | 28.76 |
| 6.04576 | 28.76 |
| 6.02564 | 28.76 |
| 6.00559 | 28.76 |
| 5.98561 | 28.76 |
| 5.96569 | 28.76 |
| 5.94584 | 28.76 |
| 5.92606 | 28.76 |
| 5.90634 | 28.76 |
| 5.88669 | 28.76 |
| 5.8671 | 28.76 |
| 5.84758 | 28.76 |
| 5.82812 | 28.76 |
| 5.80873 | 28.76 |
| 5.7894 | 28.76 |
| 5.77013 | 28.76 |
| 5.75093 | 28.76 |
| 5.7318 | 28.76 |
| 5.71273 | 28.76 |
| 5.69372 | 28.76 |
| 5.67477 | 28.76 |
| 5.65589 | 28.76 |
| 5.637069999999999 | 28.76 |
| 5.61831 | 28.76 |
| 5.59962 | 28.76 |
| 5.58099 | 28.76 |
| 5.56242 | 28.76 |
| 5.54391 | 28.76 |
| 5.52546 | 28.76 |
| 5.50708 | 28.76 |
| 5.48875 | 28.76 |
| 5.47049 | 28.76 |
| 5.45229 | 28.76 |
| 5.43414 | 28.76 |
| 5.41606 | 28.76 |
| 5.39804 | 28.76 |
| 5.38008 | 28.76 |
| 5.36218 | 28.76 |
| 5.34433 | 28.76 |
| 5.32655 | 28.76 |
| 5.30883 | 28.76 |
| 5.29116 | 28.76 |
| 5.27356 | 28.76 |
| 5.25601 | 28.76 |
| 5.23852 | 28.76 |
| 5.22109 | 28.76 |
| 5.20372 | 28.76 |
| 5.1864 | 28.76 |
| 5.16914 | 28.76 |
| 5.15194 | 28.76 |
| 5.1348 | 28.76 |
| 5.11772 | 28.76 |
| 5.10069 | 28.76 |
| 5.08372 | 28.76 |
| 5.0668 | 28.76 |
| 5.04994 | 28.76 |
| 5.03314 | 28.76 |
| 5.01639 | 28.76 |
| 4.9997 | 28.76 |
| 4.98306 | 28.76 |
| 4.96648 | 28.76 |
| 4.94996 | 28.76 |
| 4.93348 | 28.76 |
| 4.91707 | 28.76 |
| 4.90071 | 28.76 |
| 4.8844 | 28.76 |
| 4.86815 | 28.76 |
| 4.85195 | 28.76 |
| 4.83581 | 28.76 |
| 4.81972 | 28.76 |
| 4.80368 | 28.76 |
| 4.787689999999999 | 28.76 |
| 4.77176 | 28.76 |
| 4.75589 | 28.76 |
| 4.74006 | 28.76 |
| 4.72429 | 28.76 |
| 4.70857 | 28.76 |
| 4.6929 | 28.76 |
| 4.67729 | 28.76 |
| 4.66172 | 28.76 |
| 4.64621 | 28.76 |
| 4.63075 | 28.76 |
| 4.61534 | 28.76 |
| 4.59999 | 28.76 |
| 4.58468 | 28.76 |
| 4.56942 | 28.76 |
| 4.55422 | 28.76 |
| 4.53907 | 28.76 |
| 4.52396 | 28.76 |
| 4.50891 | 28.76 |
| 4.49391 | 28.76 |
| 4.47895 | 28.76 |
| 4.46405 | 28.76 |
| 4.4492 | 28.76 |
| 4.43439 | 28.76 |
| 4.41964 | 28.76 |
| 4.40493 | 28.76 |
| 4.39027 | 28.76 |
| 4.37567 | 28.76 |
| 4.36111 | 28.76 |
| 4.34659 | 28.76 |
| 4.33213 | 28.76 |
| 4.31772 | 28.76 |
| 4.30335 | 28.76 |
| 4.28903 | 28.76 |
| 4.27476 | 28.76 |
| 4.26054 | 28.76 |
| 4.24636 | 28.76 |
| 4.23223 | 28.76 |
| 4.21815 | 28.76 |
| 4.20411 | 28.76 |
| 4.19012 | 28.76 |
| 4.17618 | 28.76 |
| 4.16228 | 28.76 |
| 4.14843 | 28.76 |
| 4.13463 | 28.76 |
| 4.12087 | 28.76 |
| 4.10716 | 28.76 |
| 4.0935 | 28.76 |
| 4.07987 | 28.76 |
| 4.0663 | 28.76 |
| 4.05277 | 28.76 |
| 4.03928 | 28.76 |
| 4.02584 | 28.76 |
| 4.01245 | 28.76 |
| 3.9991 | 28.76 |
| 3.98579 | 28.76 |
| 3.97253 | 28.76 |
| 3.95931 | 28.76 |
| 3.94613 | 28.76 |
| 3.933 | 28.76 |
| 3.91992 | 28.76 |
| 3.90687 | 28.76 |
| 3.89387 | 28.76 |
| 3.88092 | 28.76 |
| 3.868 | 28.76 |
| 3.85513 | 28.76 |
| 3.84231 | 28.76 |
| 3.82952 | 28.76 |
| 3.81678 | 28.76 |
| 3.80408 | 28.76 |
| 3.79142 | 28.76 |
| 3.77881 | 28.76 |
| 3.76623 | 28.76 |
| 3.7537 | 28.76 |
| 3.74121 | 28.76 |
| 3.72876 | 28.76 |
| 3.71635 | 28.76 |
| 3.70399 | 28.76 |
| 3.69166 | 28.76 |
| 3.67938 | 28.76 |
| 3.66714 | 28.76 |
| 3.65493 | 28.76 |
| 3.64277 | 28.76 |
| 3.63065 | 28.76 |
| 3.61857 | 28.76 |
| 3.60653 | 28.76 |
| 3.59453 | 28.76 |
| 3.58257 | 28.76 |
| 3.57065 | 28.76 |
| 3.55877 | 28.76 |
| 3.54693 | 28.76 |
| 3.53512 | 28.76 |
| 3.52336 | 28.76 |
| 3.51164 | 28.76 |
| 3.49995 | 28.76 |
| 3.48831 | 28.76 |
| 3.4767 | 28.76 |
| 3.46513 | 28.76 |
| 3.4536 | 28.76 |
| 3.44211 | 28.76 |
| 3.43066 | 28.76 |
| 3.41924 | 28.76 |
| 3.40786 | 28.76 |
| 3.39652 | 28.76 |
| 3.38522 | 28.76 |
| 3.37396 | 28.76 |
| 3.36273 | 28.76 |
| 3.35154 | 28.76 |
| 3.34039 | 28.76 |
| 3.32928 | 28.76 |
| 3.3182 | 28.76 |
| 3.30716 | 28.76 |
| 3.29615 | 28.76 |
| 3.28519 | 28.76 |
| 3.27425 | 28.76 |
| 3.26336 | 28.76 |
| 3.2525 | 28.76 |
| 3.24168 | 28.76 |
| 3.23089 | 28.76 |
| 3.22014 | 28.76 |
| 3.20943 | 28.76 |
| 3.19875 | 28.76 |
| 3.1881 | 28.76 |
| 3.1775 | 28.76 |
| 3.16692 | 28.76 |
| 3.15639 | 28.76 |
| 3.14588 | 28.76 |
| 3.13542 | 28.76 |
| 3.12498 | 28.76 |
| 3.11458 | 28.76 |
| 3.10422 | 28.76 |
| 3.09389 | 28.76 |
| 3.0836 | 28.76 |
| 3.07334 | 28.76 |
| 3.06311 | 28.76 |
| 3.05292 | 28.76 |
| 3.04276 | 28.76 |
| 3.03263 | 28.76 |
| 3.02254 | 28.76 |
| 3.01249 | 28.76 |
| 3.00246 | 28.76 |
| 2.99247 | 28.76 |
| 2.98252 | 28.76 |
| 2.97259 | 28.76 |
| 2.9627 | 28.76 |
| 2.95284 | 28.76 |
| 2.94302 | 28.76 |
| 2.93322 | 28.76 |
| 2.92346 | 28.76 |
| 2.91374 | 28.76 |
| 2.90404 | 28.76 |
| 2.89438 | 28.76 |
| 2.88475 | 28.76 |
| 2.87515 | 28.76 |
| 2.86558 | 28.76 |
| 2.85605 | 28.76 |
| 2.84654 | 28.76 |
| 2.83707 | 28.76 |
| 2.82763 | 28.76 |
| 2.81822 | 28.76 |
| 2.80885 | 28.76 |
| 2.7995 | 28.76 |
| 2.79018 | 28.76 |
| 2.7809 | 28.76 |
| 2.77165 | 28.76 |
| 2.76242 | 28.76 |
| 2.75323 | 28.76 |
| 2.74407 | 28.76 |
| 2.73494 | 28.76 |
| 2.72584 | 28.76 |
| 2.71677 | 28.76 |
| 2.70773 | 28.76 |
| 2.69872 | 28.76 |
| 2.68974 | 28.76 |
| 2.68079 | 28.76 |
| 2.67187 | 28.76 |
| 2.66298 | 28.76 |
| 2.65412 | 28.76 |
| 2.64529 | 28.76 |
| 2.63649 | 28.76 |
| 2.62771 | 28.76 |
| 2.61897 | 28.76 |
| 2.61026 | 28.76 |
| 2.60157 | 28.76 |
| 2.59291 | 28.76 |
| 2.58429 | 28.76 |
| 2.57569 | 28.76 |
| 2.56712 | 28.76 |
| 2.55857 | 28.76 |
| 2.55006 | 28.76 |
| 2.54158 | 28.76 |
| 2.53312 | 28.76 |
| 2.52469 | 28.76 |
| 2.51629 | 28.76 |
| 2.50792 | 28.76 |
| 2.49957 | 28.76 |
| 2.49125 | 28.76 |
| 2.48297 | 28.76 |
| 2.4747 | 28.76 |
| 2.46647 | 28.76 |
| 2.45826 | 28.76 |
| 2.45008 | 28.76 |
| 2.44193 | 28.76 |
| 2.4338 | 28.76 |
| 2.42571 | 28.76 |
| 2.41764 | 28.76 |
| 2.40959 | 28.76 |
| 2.40157 | 28.76 |
| 2.39358 | 28.76 |
| 2.38562 | 28.76 |
| 2.37768 | 28.76 |
| 2.36977 | 28.76 |
| 2.36188 | 28.76 |
| 2.35402 | 28.76 |
| 2.34619 | 28.76 |
| 2.33838 | 28.76 |
| 2.3306 | 28.76 |
| 2.32285 | 28.76 |
| 2.31512 | 28.76 |
| 2.30742 | 28.76 |
| 2.29974 | 28.76 |
| 2.29209 | 28.76 |
| 2.28446 | 28.76 |
| 2.27686 | 28.76 |
| 2.26928 | 28.76 |
| 2.26173 | 28.76 |
| 2.25421 | 28.76 |
| 2.2467 | 28.76 |
| 2.23923 | 28.76 |
| 2.23178 | 28.76 |
| 2.22435 | 28.76 |
| 2.21695 | 28.76 |
| 2.20957 | 28.76 |
| 2.20222 | 28.76 |
| 2.19489 | 28.76 |
| 2.18759 | 28.76 |
| 2.18031 | 28.76 |
| 2.17306 | 28.76 |
| 2.16583 | 28.76 |
| 2.15862 | 28.76 |
| 2.15144 | 28.76 |
| 2.14428 | 28.76 |
| 2.13714 | 28.76 |
| 2.13003 | 28.76 |
| 2.12294 | 28.76 |
| 2.11588 | 28.76 |
| 2.10884 | 28.76 |
| 2.10182 | 28.76 |
| 2.09483 | 28.76 |
| 2.08786 | 28.76 |
| 2.08091 | 28.76 |
| 2.07399 | 28.76 |
| 2.06709 | 28.76 |
| 2.06021 | 28.76 |
| 2.05335 | 28.76 |
| 2.04652 | 28.76 |
| 2.03971 | 28.76 |
| 2.03292 | 28.76 |
| 2.02616 | 28.76 |
| 2.01942 | 28.76 |
| 2.0127 | 28.76 |
| 2.006 | 28.76 |
| 1.99933 | 28.76 |
| 1.99267 | 28.76 |
| 1.98604 | 28.76 |
| 1.97944 | 28.76 |
| 1.97285 | 28.76 |
| 1.96628 | 28.76 |
| 1.95974 | 28.76 |
| 1.95322 | 28.76 |
| 1.94672 | 28.76 |
| 1.94024 | 28.76 |
| 1.93379 | 28.76 |
| 1.92735 | 28.76 |
| 1.92094 | 28.76 |
| 1.91455 | 28.76 |
| 1.90818 | 28.76 |
| 1.90183 | 28.76 |
| 1.8955 | 28.76 |
| 1.88919 | 28.76 |
| 1.88291 | 28.76 |
| 1.87664 | 28.76 |
| 1.8704 | 28.76 |
| 1.86417 | 28.76 |
| 1.85797 | 28.76 |
| 1.85179 | 28.76 |
| 1.84563 | 28.76 |
| 1.83949 | 28.76 |
| 1.83337 | 28.76 |
| 1.82726 | 28.76 |
| 1.82118 | 28.76 |
| 1.81512 | 28.76 |
| 1.80909 | 28.76 |
| 1.80307 | 28.76 |
| 1.79707 | 28.76 |
| 1.79109 | 28.76 |
| 1.78513 | 28.76 |
| 1.77919 | 28.76 |
| 1.77327 | 28.76 |
| 1.76737 | 28.76 |
| 1.76149 | 28.76 |
| 1.75562 | 28.76 |
| 1.74978 | 28.76 |
| 1.74396 | 28.76 |
| 1.73816 | 28.76 |
| 1.73237 | 28.76 |
| 1.72661 | 28.76 |
| 1.72086 | 28.76 |
| 1.71514 | 28.76 |
| 1.70943 | 28.76 |
| 1.70374 | 28.76 |
| 1.69807 | 28.76 |
| 1.69242 | 28.76 |
| 1.68679 | 28.76 |
| 1.68118 | 28.76 |
| 1.67559 | 28.76 |
| 1.67001 | 28.76 |
| 1.66445 | 28.76 |
| 1.65892 | 28.76 |
| 1.6534 | 28.76 |
| 1.64789 | 28.76 |
| 1.64241 | 28.76 |
| 1.63695 | 28.76 |
| 1.6315 | 28.76 |
| 1.62607 | 28.76 |
| 1.62066 | 28.76 |
| 1.61527 | 28.76 |
| 1.60989 | 28.76 |
| 1.60454 | 28.76 |
| 1.5992 | 28.76 |
| 1.59388 | 28.76 |
| 1.58857 | 28.76 |
| 1.58329 | 28.76 |
| 1.57802 | 28.76 |
| 1.57277 | 28.76 |
| 1.56753 | 28.76 |
| 1.56232 | 28.76 |
| 1.55712 | 28.76 |
| 1.55194 | 28.76 |
| 1.54677 | 28.76 |
| 1.54163 | 28.76 |
| 1.5365 | 28.76 |
| 1.53139 | 28.76 |
| 1.52629 | 28.76 |
| 1.52121 | 28.76 |
| 1.51615 | 28.76 |
| 1.5111 | 28.76 |
| 1.50608 | 28.76 |
| 1.50107 | 28.76 |
| 1.49607 | 28.76 |
| 1.49109 | 28.76 |
| 1.48613 | 28.76 |
| 1.48119 | 28.76 |
| 1.47626 | 28.76 |
| 1.47135 | 28.76 |
| 1.46645 | 28.76 |
| 1.46157 | 28.76 |
| 1.45671 | 28.76 |
| 1.45186 | 28.76 |
| 1.44703 | 28.76 |
| 1.44221 | 28.76 |
| 1.43742 | 28.76 |
| 1.43263 | 28.76 |
| 1.42787 | 28.76 |
| 1.42311 | 28.76 |
| 1.41838 | 28.76 |
| 1.41366 | 28.76 |
| 1.40896 | 28.76 |
| 1.40427 | 28.76 |
| 1.39959 | 28.76 |
| 1.39494 | 28.76 |
| 1.3903 | 28.76 |
| 1.38567 | 28.76 |
| 1.38106 | 28.76 |
| 1.37646 | 28.76 |
| 1.37188 | 28.76 |
| 1.36732 | 28.76 |
| 1.36277 | 28.76 |
| 1.35823 | 28.76 |
| 1.35372 | 28.76 |
| 1.34921 | 28.76 |
| 1.34472 | 28.76 |
| 1.34025 | 28.76 |
| 1.33579 | 28.76 |
| 1.33134 | 28.76 |
| 1.32691 | 28.76 |
| 1.3225 | 28.76 |
| 1.3181 | 28.76 |
| 1.31371 | 28.76 |
| 1.30934 | 28.76 |
| 1.30498 | 28.76 |
| 1.30064 | 28.76 |
| 1.29631 | 28.76 |
| 1.292 | 28.76 |
| 1.2877 | 28.76 |
| 1.28342 | 28.76 |
| 1.27915 | 28.76 |
| 1.27489 | 28.76 |
| 1.27065 | 28.76 |
| 1.26642 | 28.76 |
| 1.26221 | 28.76 |
| 1.25801 | 28.76 |
| 1.25382 | 28.76 |
| 1.24965 | 28.76 |
| 1.24549 | 28.76 |
| 1.24135 | 28.76 |
| 1.23721 | 28.76 |
| 1.2331 | 28.76 |
| 1.22899 | 28.76 |
| 1.22491 | 28.76 |
| 1.22083 | 28.76 |
| 1.21677 | 28.76 |
| 1.21272 | 28.76 |
| 1.20868 | 28.76 |
| 1.20466 | 28.76 |
| 1.20065 | 28.76 |
| 1.19666 | 28.76 |
| 1.19268 | 28.76 |
| 1.18871 | 28.76 |
| 1.18475 | 28.76 |
| 1.18081 | 28.76 |
| 1.17688 | 28.76 |
| 1.17297 | 28.76 |
| 1.16906 | 28.76 |
| 1.16517 | 28.76 |
| 1.1613 | 28.76 |
| 1.15743 | 28.76 |
| 1.15358 | 28.76 |
| 1.14974 | 28.76 |
| 1.14592 | 28.76 |
| 1.1421 | 28.76 |
| 1.1383 | 28.76 |
| 1.13452 | 28.76 |
| 1.13074 | 28.76 |
| 1.12698 | 28.76 |
| 1.12323 | 28.76 |
| 1.11949 | 28.76 |
| 1.11577 | 28.76 |
| 1.11205 | 28.76 |
| 1.10835 | 28.76 |
| 1.10466 | 28.76 |
| 1.10099 | 28.76 |
| 1.09733 | 28.76 |
| 1.09367 | 28.76 |
| 1.09003 | 28.76 |
| 1.08641 | 28.76 |
| 1.08279 | 28.76 |
| 1.07919 | 28.76 |
| 1.0756 | 28.76 |
| 1.07202 | 28.76 |
| 1.06845 | 28.76 |
| 1.0649 | 28.76 |
| 1.06135 | 28.76 |
| 1.05782 | 28.76 |
| 1.0543 | 28.76 |
| 1.0508 | 28.76 |
| 1.0473 | 28.76 |
| 1.04381 | 28.76 |
| 1.04034 | 28.76 |
| 1.03688 | 28.76 |
| 1.03343 | 28.76 |
| 1.02999 | 28.76 |
| 1.02656 | 28.76 |
| 1.02315 | 28.76 |
| 1.01974 | 28.76 |
| 1.01635 | 28.76 |
| 1.01297 | 28.76 |
| 1.0096 | 28.76 |
| 1.00624 | 28.76 |
| 1.00289 | 28.76 |
| 0.999553 | 28.76 |
| 0.996227 | 28.76 |
| 0.992912 | 28.76 |
| 0.989608 | 28.76 |
| 0.986315 | 28.76 |
| 0.983033 | 28.76 |
| 0.979762 | 28.76 |
| 0.976502 | 28.76 |
| 0.973253 | 28.76 |
| 0.970014 | 28.76 |
| 0.966787 | 28.76 |
| 0.96357 | 28.76 |
| 0.960364 | 28.76 |
| 0.957168 | 28.76 |
| 0.953983 | 28.76 |
| 0.950809 | 28.76 |
| 0.947645 | 28.76 |
| 0.944492 | 28.76 |
| 0.941349 | 28.76 |
| 0.938217 | 28.76 |
| 0.935095 | 28.76 |
| 0.931984 | 28.76 |
| 0.928883 | 28.76 |
| 0.925792 | 28.76 |
| 0.922711 | 28.76 |
| 0.919641 | 28.76 |
| 0.916581 | 28.76 |
| 0.913531 | 28.76 |
| 0.910492 | 28.76 |
| 0.907462 | 28.76 |
| 0.904442 | 28.76 |
| 0.901433 | 28.76 |
| 0.898434 | 28.76 |
| 0.895444 | 28.76 |
| 0.892465 | 28.76 |
| 0.889495 | 28.76 |
| 0.886535 | 28.76 |
| 0.883585 | 28.76 |
| 0.880645 | 28.76 |
| 0.877715 | 28.76 |
| 0.874794 | 28.76 |
| 0.871884 | 28.76 |
| 0.868983 | 28.76 |
| 0.866091 | 28.76 |
| 0.863209 | 28.76 |
| 0.860337 | 28.76 |
| 0.857474 | 28.76 |
| 0.854621 | 28.76 |
| 0.851777 | 28.76 |
| 0.848943 | 28.76 |
| 0.846118 | 28.76 |
| 0.843303 | 28.76 |
| 0.840497 | 28.76 |
| 0.8377 | 28.76 |
| 0.834913 | 28.76 |
| 0.832135 | 28.76 |
| 0.829366 | 28.76 |
| 0.826606 | 28.76 |
| 0.823856 | 28.76 |
| 0.821114 | 28.76 |
| 0.818382 | 28.76 |
| 0.815659 | 28.76 |
| 0.812945 | 28.76 |
| 0.81024 | 28.76 |
| 0.807544 | 28.76 |
| 0.804857 | 28.76 |
| 0.802179 | 28.76 |
| 0.79951 | 28.76 |
| 0.796849 | 28.76 |
| 0.794198 | 28.76 |
| 0.791555 | 28.76 |
| 0.788921 | 28.76 |
| 0.786296 | 28.76 |
| 0.78368 | 28.76 |
| 0.781072 | 28.76 |
| 0.778473 | 28.76 |
| 0.775883 | 28.76 |
| 0.773301 | 28.76 |
| 0.770728 | 28.76 |
| 0.768164 | 28.76 |
| 0.765608 | 28.76 |
| 0.76306 | 28.76 |
| 0.760521 | 28.76 |
| 0.757991 | 28.76 |
| 0.755469 | 28.76 |
| 0.752955 | 28.76 |
| 0.750449 | 28.76 |
| 0.747952 | 28.76 |
| 0.745464 | 28.76 |
| 0.742983 | 28.76 |
| 0.740511 | 28.76 |
| 0.738047 | 28.76 |
| 0.735591 | 28.76 |
| 0.733144 | 28.76 |
| 0.730704 | 28.76 |
| 0.728273 | 28.76 |
| 0.725849 | 28.76 |
| 0.723434 | 28.76 |
| 0.721027 | 28.76 |
| 0.718628 | 28.76 |
| 0.716237 | 28.76 |
| 0.713853 | 28.76 |
| 0.711478 | 28.76 |
| 0.709111 | 28.76 |
| 0.706751 | 28.76 |
| 0.7044 | 28.76 |
| 0.702056 | 28.76 |
| 0.69972 | 28.76 |
| 0.697391 | 28.76 |
| 0.695071 | 28.76 |
| 0.692758 | 28.76 |
| 0.690453 | 28.76 |
| 0.688156 | 28.76 |
| 0.685866 | 28.76 |
| 0.683584 | 28.76 |
| 0.681309 | 28.76 |
| 0.679042 | 28.76 |
| 0.676783 | 28.76 |
| 0.674531 | 28.76 |
| 0.672286 | 28.76 |
| 0.670049 | 28.76 |
| 0.66782 | 28.76 |
| 0.665598 | 28.76 |
| 0.663383 | 28.76 |
| 0.661176 | 28.76 |
| 0.658976 | 28.76 |
| 0.656783 | 28.76 |
| 0.654597 | 28.76 |
| 0.652419 | 28.76 |
| 0.650248 | 28.76 |
| 0.648085 | 28.76 |
| 0.645928 | 28.76 |
| 0.643779 | 28.76 |
| 0.641637 | 28.76 |
| 0.639502 | 28.76 |
| 0.637374 | 28.76 |
| 0.635253 | 28.76 |
| 0.633139 | 28.76 |
| 0.631033 | 28.76 |
| 0.628933 | 28.76 |
| 0.62684 | 28.76 |
| 0.624755 | 28.76 |
| 0.622676 | 28.76 |
| 0.620604 | 28.76 |
| 0.618539 | 28.76 |
| 0.616481 | 28.76 |
| 0.614429 | 28.76 |
| 0.612385 | 28.76 |
| 0.610347 | 28.76 |
| 0.608316 | 28.76 |
| 0.606292 | 28.76 |
| 0.604275 | 28.76 |
| 0.602264 | 28.76 |
| 0.60026 | 28.76 |
| 0.598263 | 28.76 |
| 0.596272 | 28.76 |
| 0.594288 | 28.76 |
| 0.592311 | 28.76 |
| 0.59034 | 28.76 |
| 0.588376 | 28.76 |
| 0.586418 | 28.76 |
| 0.584466 | 28.76 |
| 0.582522 | 28.76 |
| 0.580583 | 28.76 |
| 0.578652 | 28.76 |
| 0.576726 | 28.76 |
| 0.574807 | 28.76 |
| 0.572895 | 28.76 |
| 0.570988 | 28.76 |
| 0.569088 | 28.76 |
| 0.567195 | 28.76 |
| 0.565307 | 28.76 |
| 0.563426 | 28.76 |
| 0.561552 | 28.76 |
| 0.559683 | 28.76 |
| 0.557821 | 28.76 |
| 0.555965 | 28.76 |
| 0.554115 | 28.76 |
| 0.552271 | 28.76 |
| 0.550433 | 28.76 |
| 0.548602 | 28.76 |
| 0.546776 | 28.76 |
| 0.544957 | 28.76 |
| 0.543144 | 28.76 |
| 0.541336 | 28.76 |
| 0.539535 | 28.76 |
| 0.53774 | 28.76 |
| 0.535951 | 28.76 |
| 0.534167 | 28.76 |
| 0.53239 | 28.76 |
| 0.530618 | 28.76 |
| 0.528853 | 28.76 |
| 0.527093 | 28.76 |
| 0.525339 | 28.76 |
| 0.523591 | 28.76 |
| 0.521849 | 28.76 |
| 0.520113 | 28.76 |
| 0.518382 | 28.76 |
| 0.516657 | 28.76 |
| 0.514938 | 28.76 |
| 0.513225 | 28.76 |
| 0.511517 | 28.76 |
| 0.509815 | 28.76 |
| 0.508118 | 28.76 |
| 0.506428 | 28.76 |
| 0.504743 | 28.76 |
| 0.503063 | 28.76 |
| 0.501389 | 28.76 |
| 0.499721 | 28.76 |
| 0.498058 | 28.76 |
| 0.496401 | 28.76 |
| 0.494749 | 28.76 |
| 0.493103 | 28.76 |
| 0.491462 | 28.76 |
| 0.489827 | 28.76 |
| 0.488197 | 28.76 |
| 0.486573 | 28.76 |
| 0.484954 | 28.76 |
| 0.48334 | 28.76 |
| 0.481732 | 28.76 |
| 0.480129 | 28.76 |
| 0.478531 | 28.76 |
| 0.476939 | 28.76 |
| 0.475352 | 28.76 |
| 0.47377 | 28.76 |
| 0.472194 | 28.76 |
| 0.470623 | 28.76 |
| 0.469057 | 28.76 |
| 0.467496 | 28.76 |
| 0.46594 | 28.76 |
| 0.46439 | 28.76 |
| 0.462845 | 28.76 |
| 0.461305 | 28.76 |
| 0.45977 | 28.76 |
| 0.45824 | 28.76 |
| 0.456715 | 28.76 |
| 0.455195 | 28.76 |
| 0.453681 | 28.76 |
| 0.452171 | 28.76 |
| 0.450667 | 28.76 |
| 0.449167 | 28.76 |
| 0.447672 | 28.76 |
| 0.446183 | 28.76 |
| 0.444698 | 28.76 |
| 0.443218 | 28.76 |
| 0.441744 | 28.78 |
| 0.440274 | 28.83 |
| 0.438809 | 28.88 |
| 0.437349 | 28.93 |
| 0.435893 | 28.97 |
| 0.434443 | 29.02 |
| 0.432998 | 29.07 |
| 0.431557 | 29.12 |
| 0.430121 | 29.17 |
| 0.42869 | 29.22 |
| 0.427263 | 29.27 |
| 0.425841 | 29.31 |
| 0.424425 | 29.36 |
| 0.423012 | 29.41 |
| 0.421605 | 29.46 |
| 0.420202 | 29.51 |
| 0.418804 | 29.56 |
| 0.41741 | 29.61 |
| 0.416021 | 29.66 |
| 0.414637 | 29.71 |
| 0.413257 | 29.76 |
| 0.411882 | 29.81 |
| 0.410512 | 29.86 |
| 0.409146 | 29.91 |
| 0.407784 | 29.96 |
| 0.406427 | 30.01 |
| 0.405075 | 30.06 |
| 0.403727 | 30.11 |
| 0.402384 | 30.16 |
| 0.401045 | 30.21 |
| 0.399711 | 30.26 |
| 0.398381 | 30.31 |
| 0.397055 | 30.36 |
| 0.395734 | 30.41 |
| 0.394417 | 30.46 |
| 0.393105 | 30.51 |
| 0.391797 | 30.56 |
| 0.390493 | 30.61 |
| 0.389194 | 30.66 |
| 0.387899 | 30.71 |
| 0.386608 | 30.77 |
| 0.385321 | 30.82 |
| 0.384039 | 30.87 |
| 0.382762 | 30.92 |
| 0.381488 | 30.97 |
| 0.380219 | 31.02 |
| 0.378953 | 31.08 |
| 0.377692 | 31.13 |
| 0.376436 | 31.18 |
| 0.375183 | 31.23 |
| 0.373935 | 31.28 |
| 0.372691 | 31.34 |
| 0.37145 | 31.39 |
| 0.370214 | 31.44 |
| 0.368983 | 31.49 |
| 0.367755 | 31.55 |
| 0.366531 | 31.6 |
| 0.365312 | 31.65 |
| 0.364096 | 31.7 |
| 0.362885 | 31.76 |
| 0.361678 | 31.81 |
| 0.360474 | 31.86 |
| 0.359275 | 31.92 |
| 0.35808 | 31.97 |
| 0.356888 | 32.02 |
| 0.355701 | 32.08 |
| 0.354518 | 32.13 |
| 0.353338 | 32.18 |
| 0.352163 | 32.24 |
| 0.350991 | 32.29 |
| 0.349823 | 32.34 |
| 0.34866 | 32.4 |
| 0.3475 | 32.45 |
| 0.346344 | 32.51 |
| 0.345191 | 32.56 |
| 0.344043 | 32.61 |
| 0.342898 | 32.67 |
| 0.341758 | 32.72 |
| 0.340621 | 32.78 |
| 0.339487 | 32.83 |
| 0.338358 | 32.89 |
| 0.337232 | 32.94 |
| 0.33611 | 33 |
| 0.334992 | 33.05 |
| 0.333878 | 33.11 |
| 0.332767 | 33.16 |
| 0.33166 | 33.22 |
| 0.330556 | 33.27 |
| 0.329457 | 33.33 |
| 0.328361 | 33.38 |
| 0.327268 | 33.44 |
| 0.326179 | 33.5 |
| 0.325094 | 33.55 |
| 0.324013 | 33.61 |
| 0.322935 | 33.66 |
| 0.32186 | 33.72 |
| 0.320789 | 33.78 |
| 0.319722 | 33.83 |
| 0.318659 | 33.89 |
| 0.317598 | 33.95 |
| 0.316542 | 34 |
| 0.315489 | 34.06 |
| 0.314439 | 34.12 |
| 0.313393 | 34.17 |
| 0.31235 | 34.23 |
| 0.311311 | 34.29 |
| 0.310276 | 34.34 |
| 0.309243 | 34.4 |
| 0.308214 | 34.46 |
| 0.307189 | 34.52 |
| 0.306167 | 34.57 |
| 0.305148 | 34.63 |
| 0.304133 | 34.69 |
| 0.303122 | 34.75 |
| 0.302113 | 34.8 |
| 0.301108 | 34.86 |
| 0.300106 | 34.92 |
| 0.299108 | 34.98 |
| 0.298113 | 35.04 |
| 0.297121 | 35.1 |
| 0.296132 | 35.15 |
| 0.295147 | 35.21 |
| 0.294165 | 35.27 |
| 0.293187 | 35.33 |
| 0.292211 | 35.39 |
| 0.291239 | 35.45 |
| 0.29027 | 35.51 |
| 0.289304 | 35.57 |
| 0.288342 | 35.63 |
| 0.287383 | 35.69 |
| 0.286427 | 35.75 |
| 0.285474 | 35.8 |
| 0.284524 | 35.86 |
| 0.283577 | 35.92 |
| 0.282634 | 35.98 |
| 0.281694 | 36.04 |
| 0.280756 | 36.1 |
| 0.279822 | 36.16 |
| 0.278891 | 36.23 |
| 0.277964 | 36.29 |
| 0.277039 | 36.35 |
| 0.276117 | 36.41 |
| 0.275199 | 36.47 |
| 0.274283 | 36.53 |
| 0.273371 | 36.59 |
| 0.272461 | 36.65 |
| 0.271555 | 36.71 |
| 0.270651 | 36.77 |
| 0.269751 | 36.83 |
| 0.268853 | 36.9 |
| 0.267959 | 36.96 |
| 0.267067 | 37.02 |
| 0.266179 | 37.08 |
| 0.265293 | 37.14 |
| 0.264411 | 37.2 |
| 0.263531 | 37.27 |
| 0.262654 | 37.33 |
| 0.261781 | 37.39 |
| 0.26091 | 37.45 |
| 0.260042 | 37.52 |
| 0.259176 | 37.58 |
| 0.258314 | 37.64 |
| 0.257455 | 37.7 |
| 0.256598 | 37.77 |
| 0.255745 | 37.83 |
| 0.254894 | 37.89 |
| 0.254046 | 37.96 |
| 0.253201 | 38.02 |
| 0.252358 | 38.08 |
| 0.251519 | 38.15 |
| 0.250682 | 38.21 |
| 0.249848 | 38.27 |
| 0.249017 | 38.34 |
| 0.248188 | 38.4 |
| 0.247363 | 38.47 |
| 0.24654 | 38.53 |
| 0.245719 | 38.59 |
| 0.244902 | 38.66 |
| 0.244087 | 38.72 |
| 0.243275 | 38.79 |
| 0.242466 | 38.85 |
| 0.241659 | 38.92 |
| 0.240855 | 38.98 |
| 0.240054 | 39.05 |
| 0.239255 | 39.11 |
| 0.238459 | 39.18 |
| 0.237666 | 39.24 |
| 0.236875 | 39.31 |
| 0.236087 | 39.37 |
| 0.235302 | 39.44 |
| 0.234519 | 39.5 |
| 0.233739 | 39.57 |
| 0.232961 | 39.64 |
| 0.232186 | 39.7 |
| 0.231414 | 39.77 |
| 0.230644 | 39.84 |
| 0.229876 | 39.9 |
| 0.229112 | 39.97 |
| 0.228349 | 40.03 |
| 0.22759 | 40.1 |
| 0.226832 | 40.17 |
| 0.226078 | 40.24 |
| 0.225326 | 40.3 |
| 0.224576 | 40.37 |
| 0.223829 | 40.44 |
| 0.223084 | 40.5 |
| 0.222342 | 40.57 |
| 0.221602 | 40.64 |
| 0.220865 | 40.71 |
| 0.22013 | 40.78 |
| 0.219398 | 40.84 |
| 0.218668 | 40.91 |
| 0.217941 | 40.98 |
| 0.217215 | 41.05 |
| 0.216493 | 41.12 |
| 0.215773 | 41.19 |
| 0.215055 | 41.25 |
| 0.214339 | 41.32 |
| 0.213626 | 41.39 |
| 0.212915 | 41.46 |
| 0.212207 | 41.53 |
| 0.211501 | 41.6 |
| 0.210797 | 41.67 |
| 0.210096 | 41.74 |
| 0.209397 | 41.81 |
| 0.208701 | 41.88 |
| 0.208006 | 41.95 |
| 0.207314 | 42.02 |
| 0.206625 | 42.09 |
| 0.205937 | 42.16 |
| 0.205252 | 42.23 |
| 0.204569 | 42.3 |
| 0.203889 | 42.37 |
| 0.20321 | 42.44 |
| 0.202534 | 42.51 |
| 0.20186 | 42.58 |
| 0.201189 | 42.65 |
| 0.200519 | 42.72 |
| 0.199852 | 42.79 |
| 0.199187 | 42.87 |
| 0.198525 | 42.94 |
| 0.197864 | 43.01 |
| 0.197206 | 43.08 |
| 0.19655 | 43.15 |
| 0.195896 | 43.22 |
| 0.195244 | 43.3 |
| 0.194595 | 43.37 |
| 0.193947 | 43.44 |
| 0.193302 | 43.51 |
| 0.192659 | 43.59 |
| 0.192018 | 43.66 |
| 0.191379 | 43.73 |
| 0.190743 | 43.81 |
| 0.190108 | 43.88 |
| 0.189476 | 43.95 |
| 0.188845 | 44.02 |
| 0.188217 | 44.1 |
| 0.187591 | 44.17 |
| 0.186967 | 44.25 |
| 0.186345 | 44.32 |
| 0.185725 | 44.39 |
| 0.185107 | 44.47 |
| 0.184491 | 44.54 |
| 0.183877 | 44.62 |
| 0.183265 | 44.69 |
| 0.182656 | 44.76 |
| 0.182048 | 44.84 |
| 0.181442 | 44.91 |
| 0.180839 | 44.99 |
| 0.180237 | 45.06 |
| 0.179637 | 45.14 |
| 0.17904 | 45.21 |
| 0.178444 | 45.29 |
| 0.177851 | 45.37 |
| 0.177259 | 45.44 |
| 0.176669 | 45.52 |
| 0.176081 | 45.59 |
| 0.175496 | 45.67 |
| 0.174912 | 45.74 |
| 0.17433 | 45.82 |
| 0.17375 | 45.9 |
| 0.173172 | 45.97 |
| 0.172596 | 46.05 |
| 0.172021 | 46.13 |
| 0.171449 | 46.2 |
| 0.170879 | 46.28 |
| 0.17031 | 46.36 |
| 0.169744 | 46.44 |
| 0.169179 | 46.51 |
| 0.168616 | 46.59 |
| 0.168055 | 46.67 |
| 0.167496 | 46.75 |
| 0.166939 | 46.82 |
| 0.166383 | 46.9 |
| 0.16583 | 46.98 |
| 0.165278 | 47.06 |
| 0.164728 | 47.14 |
| 0.16418 | 47.22 |
| 0.163634 | 47.3 |
| 0.16309 | 47.37 |
| 0.162547 | 47.45 |
| 0.162006 | 47.53 |
| 0.161467 | 47.61 |
| 0.16093 | 47.69 |
| 0.160395 | 47.77 |
| 0.159861 | 47.85 |
| 0.159329 | 47.93 |
| 0.158799 | 48.01 |
| 0.158271 | 48.09 |
| 0.157744 | 48.17 |
| 0.15722 | 48.25 |
| 0.156697 | 48.33 |
| 0.156175 | 48.41 |
| 0.155656 | 48.49 |
| 0.155138 | 48.57 |
| 0.154622 | 48.65 |
| 0.154107 | 48.74 |
| 0.153595 | 48.82 |
| 0.153084 | 48.9 |
| 0.152574 | 48.98 |
| 0.152067 | 49.06 |
| 0.151561 | 49.14 |
| 0.151057 | 49.23 |
| 0.150554 | 49.31 |
| 0.150053 | 49.39 |
| 0.149554 | 49.47 |
| 0.149056 | 49.55 |
| 0.14856 | 49.64 |
| 0.148066 | 49.72 |
| 0.147574 | 49.8 |
| 0.147083 | 49.89 |
| 0.146593 | 49.97 |
| 0.146106 | 50.05 |
| 0.14562 | 50.14 |
| 0.145135 | 50.22 |
| 0.144652 | 50.3 |
| 0.144171 | 50.39 |
| 0.143691 | 50.47 |
| 0.143213 | 50.56 |
| 0.142737 | 50.64 |
| 0.142262 | 50.72 |
| 0.141789 | 50.81 |
| 0.141317 | 50.89 |
| 0.140847 | 50.98 |
| 0.140378 | 51.06 |
| 0.139911 | 51.15 |
| 0.139446 | 51.23 |
| 0.138982 | 51.32 |
| 0.138519 | 51.41 |
| 0.138059 | 51.49 |
| 0.137599 | 51.58 |
| 0.137142 | 51.66 |
| 0.136685 | 51.75 |
| 0.136231 | 51.84 |
| 0.135777 | 51.92 |
| 0.135326 | 52.01 |
| 0.134875 | 52.1 |
| 0.134427 | 52.18 |
| 0.133979 | 52.27 |
| 0.133534 | 52.36 |
| 0.133089 | 52.44 |
| 0.132647 | 52.53 |
| 0.132205 | 52.62 |
| 0.131766 | 52.71 |
| 0.131327 | 52.79 |
| 0.13089 | 52.88 |
| 0.130455 | 52.97 |
| 0.130021 | 53.06 |
| 0.129588 | 53.15 |
| 0.129157 | 53.24 |
| 0.128727 | 53.33 |
| 0.128299 | 53.41 |
| 0.127872 | 53.5 |
| 0.127447 | 53.59 |
| 0.127023 | 53.68 |
| 0.1266 | 53.77 |
| 0.126179 | 53.86 |
| 0.125759 | 53.95 |
| 0.125341 | 54.04 |
| 0.124924 | 54.13 |
| 0.124508 | 54.22 |
| 0.124094 | 54.31 |
| 0.123681 | 54.4 |
| 0.12327 | 54.49 |
| 0.12286 | 54.58 |
| 0.122451 | 54.68 |
| 0.122044 | 54.77 |
| 0.121638 | 54.86 |
| 0.121233 | 54.95 |
| 0.12083 | 55.04 |
| 0.120428 | 55.13 |
| 0.120027 | 55.22 |
| 0.119628 | 55.32 |
| 0.11923 | 55.41 |
| 0.118833 | 55.5 |
| 0.118438 | 55.59 |
| 0.118044 | 55.69 |
| 0.117651 | 55.78 |
| 0.117259 | 55.87 |
| 0.116869 | 55.97 |
| 0.11648 | 56.06 |
| 0.116093 | 56.15 |
| 0.115707 | 56.25 |
| 0.115322 | 56.34 |
| 0.114938 | 56.43 |
| 0.114556 | 56.53 |
| 0.114175 | 56.62 |
| 0.113795 | 56.72 |
| 0.113416 | 56.81 |
| 0.113039 | 56.91 |
| 0.112663 | 57 |
| 0.112288 | 57.1 |
| 0.111914 | 57.19 |
| 0.111542 | 57.29 |
| 0.111171 | 57.38 |
| 0.110801 | 57.48 |
| 0.110433 | 57.57 |
| 0.110065 | 57.67 |
| 0.109699 | 57.77 |
| 0.109334 | 57.86 |
| 0.10897 | 57.96 |
| 0.108608 | 58.06 |
| 0.108246 | 58.15 |
| 0.107886 | 58.25 |
| 0.107527 | 58.35 |
| 0.10717 | 58.44 |
| 0.106813 | 58.54 |
| 0.106458 | 58.64 |
| 0.106104 | 58.74 |
| 0.105751 | 58.84 |
| 0.105399 | 58.93 |
| 0.105048 | 59.03 |
| 0.104699 | 59.13 |
| 0.10435 | 59.23 |
| 0.104003 | 59.33 |
| 0.103657 | 59.43 |
| 0.103312 | 59.53 |
| 0.102969 | 59.63 |
| 0.102626 | 59.72 |
| 0.102285 | 59.82 |
| 0.101944 | 59.92 |
| 0.101605 | 60.02 |
| 0.101267 | 60.12 |
| 0.10093 | 60.22 |
| 0.100594 | 60.32 |
| 0.10026 | 60.43 |
| 0.0999262 | 60.53 |
| 0.0995937 | 60.63 |
| 0.0992624 | 60.73 |
| 0.0989322 | 60.83 |
| 0.098603 | 60.93 |
| 0.098275 | 61.03 |
| 0.097948 | 61.13 |
| 0.0976222 | 61.24 |
| 0.0972974 | 61.34 |
| 0.0969737 | 61.44 |
| 0.0966511 | 61.54 |
| 0.0963295 | 61.65 |
| 0.096009 | 61.75 |
| 0.0956896 | 61.85 |
| 0.0953713 | 61.95 |
| 0.095054 | 62.06 |
| 0.0947378 | 62.16 |
| 0.0944226 | 62.27 |
| 0.0941084 | 62.37 |
| 0.0937954 | 62.47 |
| 0.0934833 | 62.58 |
| 0.0931723 | 62.68 |
| 0.0928623 | 62.79 |
| 0.0925534 | 62.89 |
| 0.0922455 | 63 |
| 0.0919386 | 63.1 |
| 0.0916327 | 63.21 |
| 0.0913279 | 63.31 |
| 0.0911592 | 63.37 |
| 0.0909909 | 63.43 |
| 0.0906888 | 63.53 |
| 0.0903877 | 63.64 |
| 0.0900877 | 63.75 |
| 0.0897886 | 63.85 |
| 0.0894905 | 63.96 |
| 0.0891934 | 64.07 |
| 0.0888973 | 64.17 |
| 0.0886022 | 64.28 |
| 0.088308 | 64.39 |
| 0.0880148 | 64.49 |
| 0.0877227 | 64.6 |
| 0.0874314 | 64.71 |
| 0.0871412 | 64.82 |
| 0.0868519 | 64.92 |
| 0.0865635 | 65.03 |
| 0.0862762 | 65.14 |
| 0.0859897 | 65.25 |
| 0.0857043 | 65.36 |
| 0.0854197 | 65.47 |
| 0.0851362 | 65.57 |
| 0.0848535 | 65.68 |
| 0.0845718 | 65.79 |
| 0.084291 | 65.9 |
| 0.0840112 | 66.01 |
| 0.0837323 | 66.12 |
| 0.0834543 | 66.23 |
| 0.0831773 | 66.34 |
| 0.0829011 | 66.45 |
| 0.0826259 | 66.56 |
| 0.0823516 | 66.67 |
| 0.0820782 | 66.79 |
| 0.0818057 | 66.9 |
| 0.0815341 | 67.01 |
| 0.0812635 | 67.12 |
| 0.0809937 | 67.23 |
| 0.0807248 | 67.34 |
| 0.0804568 | 67.45 |
| 0.0801897 | 67.57 |
| 0.0799235 | 67.68 |
| 0.0796581 | 67.79 |
| 0.0793937 | 67.91 |
| 0.0791301 | 68.02 |
| 0.0788674 | 68.13 |
| 0.0786056 | 68.24 |
| 0.0783446 | 68.36 |
| 0.0780845 | 68.47 |
| 0.0778253 | 68.59 |
| 0.0775669 | 68.7 |
| 0.0773094 | 68.81 |
| 0.0770528 | 68.93 |
| 0.076797 | 69.04 |
| 0.076542 | 69.16 |
| 0.0762879 | 69.27 |
| 0.0760346 | 69.39 |
| 0.0757822 | 69.5 |
| 0.0755306 | 69.62 |
| 0.0752799 | 69.74 |
| 0.0750299 | 69.85 |
| 0.0747809 | 69.97 |
| 0.0745326 | 70.08 |
| 0.0742852 | 70.2 |
| 0.0740385 | 70.32 |
| 0.0737927 | 70.44 |
| 0.0735478 | 70.55 |
| 0.0733036 | 70.67 |
| 0.0730602 | 70.79 |
| 0.0728177 | 70.91 |
| 0.0725759 | 71.02 |
| 0.072335 | 71.14 |
| 0.0720949 | 71.26 |
| 0.0718555 | 71.38 |
| 0.071617 | 71.5 |
| 0.0713792 | 71.62 |
| 0.0711422 | 71.74 |
| 0.0709061 | 71.86 |
| 0.0706707 | 71.97 |
| 0.070436 | 72.09 |
| 0.0702022 | 72.21 |
| 0.0699692 | 72.33 |
| 0.0697369 | 72.46 |
| 0.0695053 | 72.58 |
| 0.0692746 | 72.7 |
| 0.0690446 | 72.82 |
| 0.0688154 | 72.94 |
| 0.0685869 | 73.06 |
| 0.0683592 | 73.18 |
| 0.0681323 | 73.3 |
| 0.0679061 | 73.43 |
| 0.0676807 | 73.55 |
| 0.067456 | 73.67 |
| 0.067232 | 73.79 |
| 0.0670088 | 73.92 |
| 0.0667864 | 74.04 |
| 0.0665647 | 74.16 |
| 0.0663437 | 74.29 |
| 0.0661234 | 74.41 |
| 0.0659039 | 74.53 |
| 0.0656851 | 74.66 |
| 0.065467 | 74.78 |
| 0.0652497 | 74.91 |
| 0.0650331 | 75.03 |
| 0.0648172 | 75.16 |
| 0.064602 | 75.28 |
| 0.0643875 | 75.41 |
| 0.0641738 | 75.53 |
| 0.0639607 | 75.66 |
| 0.0637484 | 75.78 |
| 0.0635367 | 75.91 |
| 0.0633258 | 76.04 |
| 0.0631156 | 76.16 |
| 0.062906 | 76.29 |
| 0.0626972 | 76.42 |
| 0.0624891 | 76.54 |
| 0.0622816 | 76.67 |
| 0.0620748 | 76.8 |
| 0.0618688 | 76.93 |
| 0.0616634 | 77.05 |
| 0.0614587 | 77.18 |
| 0.0612546 | 77.31 |
| 0.0610513 | 77.44 |
| 0.0608486 | 77.57 |
| 0.0606466 | 77.7 |
| 0.0604452 | 77.83 |
| 0.0602446 | 77.96 |
| 0.0600446 | 78.09 |
| 0.0598452 | 78.22 |
| 0.0596465 | 78.35 |
| 0.0594485 | 78.48 |
| 0.0592512 | 78.61 |
| 0.0590545 | 78.74 |
| 0.0588584 | 78.87 |
| 0.058663 | 79 |
| 0.0584683 | 79.13 |
| 0.0582741 | 79.26 |
| 0.0580807 | 79.4 |
| 0.0578879 | 79.53 |
| 0.0576957 | 79.66 |
| 0.0575041 | 79.79 |
| 0.0573132 | 79.93 |
| 0.057123 | 80.06 |
| 0.0569333 | 80.19 |
| 0.0567443 | 80.33 |
| 0.0565559 | 80.46 |
| 0.0563682 | 80.59 |
| 0.056181 | 80.73 |
| 0.0559945 | 80.86 |
| 0.0558086 | 81 |
| 0.0556234 | 81.13 |
| 0.0554387 | 81.27 |
| 0.0552547 | 81.4 |
| 0.0550712 | 81.54 |
| 0.0548884 | 81.67 |
| 0.0547062 | 81.81 |
| 0.0545245 | 81.94 |
| 0.0543435 | 82.08 |
| 0.0541631 | 82.22 |
| 0.0539833 | 82.35 |
| 0.0538041 | 82.49 |
| 0.0536255 | 82.63 |
| 0.0534474 | 82.77 |
| 0.05327 | 82.9 |
| 0.0530932 | 83.04 |
| 0.0529169 | 83.18 |
| 0.0527412 | 83.32 |
| 0.0525661 | 83.46 |
| 0.0523916 | 83.6 |
| 0.0522177 | 83.68 |
| 0.0520443 | 83.68 |
| 0.0518715 | 83.68 |
| 0.0516993 | 83.68 |
| 0.0515277 | 83.68 |
| 0.0513566 | 83.68 |
| 0.0511861 | 83.68 |
| 0.0510162 | 83.68 |
| 0.0508468 | 83.68 |
| 0.050678 | 83.68 |
| 0.0505098 | 83.68 |
| 0.0503421 | 83.68 |
| 0.0501749 | 83.68 |
| 0.0500083 | 83.68 |
| 0.0498422 | 83.68 |
| 0.0496767 | 83.68 |
| 0.0495117 | 83.68 |
| 0.0493473 | 83.68 |
| 0.0491834 | 83.68 |
| 0.0490201 | 83.68 |
| 0.0488573 | 83.68 |
| 0.048695 | 83.68 |
| 0.0485333 | 83.68 |
| 0.0483721 | 83.68 |
| 0.0482115 | 83.68 |
| 0.0480514 | 83.68 |
| 0.0478918 | 83.68 |
| 0.0477328 | 83.68 |
| 0.0475742 | 83.68 |
| 0.0474163 | 83.68 |
| 0.0472588 | 83.68 |
| 0.0471018 | 83.68 |
| 0.0469454 | 83.68 |
| 0.0467895 | 83.68 |
| 0.0466341 | 83.68 |
| 0.0464793 | 83.68 |
| 0.0463249 | 83.67 |
| 0.0461711 | 83.67 |
| 0.0460177 | 83.67 |
| 0.0458649 | 83.67 |
| 0.0457126 | 83.67 |
| 0.0455608 | 83.67 |
| 0.0454095 | 83.67 |
| 0.0452587 | 83.67 |
| 0.0451084 | 83.67 |
| 0.0449586 | 83.67 |
| 0.0448093 | 83.67 |
| 0.0446605 | 83.67 |
| 0.0445122 | 83.67 |
| 0.0443643 | 83.67 |
| 0.044217 | 83.67 |
| 0.0440702 | 83.67 |
| 0.0439238 | 83.67 |
| 0.0437779 | 83.67 |
| 0.0436326 | 83.67 |
| 0.0434877 | 83.67 |
| 0.0433432 | 83.67 |
| 0.0431993 | 83.67 |
| 0.0430558 | 83.67 |
| 0.0429128 | 83.67 |
| 0.0427703 | 83.67 |
| 0.0426283 | 83.67 |
| 0.0424867 | 83.67 |
| 0.0423456 | 83.67 |
| 0.042205 | 83.67 |
| 0.0420649 | 83.67 |
| 0.0419252 | 83.67 |
| 0.0417859 | 83.67 |
| 0.0416472 | 83.67 |
| 0.0415089 | 83.67 |
| 0.041371 | 83.67 |
| 0.0412336 | 83.67 |
| 0.0410967 | 83.67 |
| 0.0409602 | 83.67 |
| 0.0408242 | 83.66 |
| 0.0406886 | 83.66 |
| 0.0405535 | 83.66 |
| 0.0404188 | 83.66 |
| 0.0402846 | 83.66 |
| 0.0401508 | 83.66 |
| 0.0400174 | 83.66 |
| 0.0398846 | 83.66 |
| 0.0397521 | 83.66 |
| 0.0396201 | 83.66 |
| 0.0394885 | 83.66 |
| 0.0393574 | 83.66 |
| 0.0392267 | 83.66 |
| 0.0390964 | 83.66 |
| 0.0389666 | 83.66 |
| 0.0388372 | 83.66 |
| 0.0387082 | 83.66 |
| 0.0385796 | 83.66 |
| 0.0384515 | 83.66 |
| 0.0383238 | 83.66 |
| 0.0381966 | 83.66 |
| 0.0380697 | 83.66 |
| 0.0379433 | 83.66 |
| 0.0378173 | 83.66 |
| 0.0376917 | 83.66 |
| 0.0375665 | 83.66 |
| 0.0374418 | 83.66 |
| 0.0373174 | 83.66 |
| 0.0371935 | 83.66 |
| 0.03707 | 83.66 |
| 0.0369469 | 83.66 |
| 0.0368242 | 83.66 |
| 0.0367019 | 83.66 |
| 0.03658 | 83.66 |
| 0.0364585 | 83.66 |
| 0.0363374 | 83.66 |
| 0.0362168 | 83.66 |
| 0.0360965 | 83.66 |
| 0.0359766 | 83.66 |
| 0.0358571 | 83.65 |
| 0.0357381 | 83.65 |
| 0.0356194 | 83.65 |
| 0.0355011 | 83.65 |
| 0.0353832 | 83.65 |
| 0.0352657 | 83.65 |
| 0.0351486 | 83.65 |
| 0.0350318 | 83.65 |
| 0.0349155 | 83.65 |
| 0.0347995 | 83.65 |
| 0.034684 | 83.65 |
| 0.0345688 | 83.65 |
| 0.034454 | 83.65 |
| 0.0343396 | 83.65 |
| 0.0342255 | 83.65 |
| 0.0341119 | 83.65 |
| 0.0339986 | 83.65 |
| 0.0338857 | 83.65 |
| 0.0337732 | 83.65 |
| 0.033661 | 83.65 |
| 0.0335492 | 83.65 |
| 0.0334378 | 83.65 |
| 0.0333268 | 83.65 |
| 0.0332161 | 83.65 |
| 0.0331058 | 83.65 |
| 0.0329958 | 83.65 |
| 0.0328862 | 83.65 |
| 0.032777 | 83.65 |
| 0.0326682 | 83.65 |
| 0.0325597 | 83.65 |
| 0.0324516 | 83.65 |
| 0.0323438 | 83.65 |
| 0.0322364 | 83.65 |
| 0.0321293 | 83.65 |
| 0.0320226 | 83.65 |
| 0.0319163 | 83.65 |
| 0.0318103 | 83.65 |
| 0.0317047 | 83.65 |
| 0.0315994 | 83.65 |
| 0.0314944 | 83.64 |
| 0.0313898 | 83.64 |
| 0.0312856 | 83.64 |
| 0.0311817 | 83.64 |
| 0.0310781 | 83.64 |
| 0.0309749 | 83.64 |
| 0.0308721 | 83.64 |
| 0.0307695 | 83.64 |
| 0.0306674 | 83.64 |
| 0.0305655 | 83.64 |
| 0.030464 | 83.64 |
| 0.0303628 | 83.64 |
| 0.030262 | 83.64 |
| 0.0301615 | 83.64 |
| 0.0300613 | 83.64 |
| 0.0299615 | 83.64 |
| 0.029862 | 83.64 |
| 0.0297628 | 83.64 |
| 0.029664 | 83.64 |
| 0.0295655 | 83.64 |
| 0.0294673 | 83.64 |
| 0.0293694 | 83.64 |
| 0.0292719 | 83.64 |
| 0.0291747 | 83.64 |
| 0.0290778 | 83.64 |
| 0.0289813 | 83.64 |
| 0.028885 | 83.64 |
| 0.0287891 | 83.64 |
| 0.0286935 | 83.64 |
| 0.0285982 | 83.64 |
| 0.0285032 | 83.64 |
| 0.0284086 | 83.64 |
| 0.0283142 | 83.64 |
| 0.0282202 | 83.64 |
| 0.0281265 | 83.64 |
| 0.0280331 | 83.64 |
| 0.02794 | 83.64 |
| 0.0278472 | 83.64 |
| 0.0277547 | 83.64 |
| 0.0276625 | 83.63 |
| 0.0275707 | 83.63 |
| 0.0274791 | 83.63 |
| 0.0273878 | 83.63 |
| 0.0272969 | 83.63 |
| 0.0272062 | 83.63 |
| 0.0271159 | 83.63 |
| 0.0270258 | 83.63 |
| 0.0269361 | 83.63 |
| 0.0268466 | 83.63 |
| 0.0267575 | 83.63 |
| 0.0266686 | 83.63 |
| 0.0265801 | 83.63 |
| 0.0264918 | 83.63 |
| 0.0264038 | 83.63 |
| 0.0263161 | 83.63 |
| 0.0262287 | 83.63 |
| 0.0261416 | 83.63 |
| 0.0260548 | 83.63 |
| 0.0259683 | 83.63 |
| 0.025882 | 83.63 |
| 0.0257961 | 83.63 |
| 0.0257104 | 83.63 |
| 0.025625 | 83.63 |
| 0.0255399 | 83.63 |
| 0.0254551 | 83.63 |
| 0.0253706 | 83.63 |
| 0.0252863 | 83.63 |
| 0.0252024 | 83.63 |
| 0.0251187 | 83.63 |
| 0.0250352 | 83.63 |
| 0.0249527 | 83.63 |
| 0.024871 | 83.63 |
| 0.0247896 | 83.63 |
| 0.0247085 | 83.63 |
| 0.0246276 | 83.63 |
| 0.024547 | 83.63 |
| 0.0244666 | 83.63 |
| 0.0243865 | 83.63 |
| 0.0243067 | 83.62 |
| 0.0242271 | 83.62 |
| 0.0241478 | 83.62 |
| 0.0240688 | 83.62 |
| 0.02399 | 83.62 |
| 0.0239114 | 83.62 |
| 0.0238332 | 83.62 |
| 0.0237552 | 83.62 |
| 0.0236774 | 83.62 |
| 0.0236024 | 83.62 |
| 0.0235303 | 83.62 |
| 0.0234583 | 83.62 |
| 0.0233866 | 83.62 |
| 0.023315 | 83.62 |
| 0.0232437 | 83.62 |
| 0.0231727 | 83.62 |
| 0.0231018 | 83.62 |
| 0.0230311 | 83.62 |
| 0.0229607 | 83.62 |
| 0.0228905 | 83.62 |
| 0.0228205 | 83.62 |
| 0.0227476 | 83.62 |
| 0.0226719 | 83.62 |
| 0.0225965 | 83.62 |
| 0.0225213 | 83.62 |
| 0.0224464 | 83.62 |
| 0.0223717 | 83.62 |
| 0.0222972 | 83.62 |
| 0.022223 | 83.62 |
| 0.0221491 | 83.62 |
| 0.0220754 | 83.62 |
| 0.0220019 | 83.14 |
| 0.0219287 | 82.59 |
| 0.0218558 | 82.04 |
| 0.021783 | 81.5 |
| 0.0217105 | 80.96 |
| 0.0216383 | 80.42 |
| 0.0215663 | 79.88 |
| 0.0214945 | 79.35 |
| 0.021423 | 78.83 |
| 0.0213517 | 78.3 |
| 0.0212807 | 77.78 |
| 0.0212099 | 77.27 |
| 0.0211393 | 76.75 |
| 0.0210689 | 76.24 |
| 0.0209988 | 75.74 |
| 0.020929 | 75.23 |
| 0.0208593 | 74.73 |
| 0.0207899 | 74.24 |
| 0.0207207 | 73.74 |
| 0.0206518 | 73.25 |
| 0.0205831 | 72.77 |
| 0.0205146 | 72.28 |
| 0.0204463 | 71.8 |
| 0.0203783 | 71.33 |
| 0.0203105 | 70.85 |
| 0.0202429 | 70.38 |
| 0.0201755 | 69.91 |
| 0.0201084 | 69.45 |
| 0.0200415 | 68.99 |
| 0.0199748 | 68.53 |
| 0.0199083 | 68.08 |
| 0.0198421 | 67.62 |
| 0.019776 | 67.17 |
| 0.0197102 | 66.73 |
| 0.0196447 | 66.28 |
| 0.0195793 | 65.84 |
| 0.0195141 | 65.41 |
| 0.0194492 | 64.97 |
| 0.0193845 | 64.54 |
| 0.01932 | 64.11 |
| 0.0192557 | 63.69 |
| 0.0191916 | 63.26 |
| 0.0191278 | 62.84 |
| 0.0190641 | 62.43 |
| 0.0190007 | 62.01 |
| 0.0189374 | 61.6 |
| 0.0188744 | 61.19 |
| 0.0188116 | 60.78 |
| 0.018749 | 60.38 |
| 0.0186866 | 59.98 |
| 0.0186245 | 59.58 |
| 0.0185625 | 59.18 |
| 0.0185007 | 58.79 |
| 0.0184392 | 58.4 |
| 0.0183778 | 58.01 |
| 0.0183166 | 57.63 |
| 0.0182557 | 57.24 |
| 0.0181949 | 56.86 |
| 0.0181344 | 56.49 |
| 0.0180741 | 56.11 |
| 0.0180139 | 55.74 |
| 0.017954 | 55.37 |
| 0.0178942 | 55 |
| 0.0178347 | 54.63 |
| 0.0177753 | 54.27 |
| 0.0177162 | 53.91 |
| 0.0176572 | 53.55 |
| 0.0175985 | 53.2 |
| 0.0175399 | 52.84 |
| 0.0174816 | 52.49 |
| 0.0174234 | 52.14 |
| 0.0173654 | 51.8 |
| 0.0173076 | 51.45 |
| 0.01725 | 51.11 |
| 0.0171926 | 50.77 |
| 0.0171354 | 50.44 |
| 0.0170784 | 50.1 |
| 0.0170216 | 49.77 |
| 0.0169649 | 49.44 |
| 0.0169085 | 49.11 |
| 0.0168522 | 48.78 |
| 0.0167962 | 48.46 |
| 0.0167403 | 48.14 |
| 0.0166846 | 47.82 |
| 0.016629 | 47.5 |
| 0.0165737 | 47.18 |
| 0.0165186 | 46.87 |
| 0.0164636 | 46.56 |
| 0.0164088 | 46.25 |
| 0.0163542 | 45.94 |
| 0.0162998 | 45.64 |
| 0.0162455 | 45.33 |
| 0.0161915 | 45.03 |
| 0.0161376 | 44.73 |
| 0.0160839 | 44.44 |
| 0.0160304 | 44.14 |
| 0.0159771 | 43.85 |
| 0.0159239 | 43.56 |
| 0.0158709 | 43.27 |
| 0.0158181 | 42.98 |
| 0.0157655 | 42.69 |
| 0.015713 | 42.41 |
| 0.0156607 | 42.13 |
| 0.0156086 | 41.85 |
| 0.0155567 | 41.57 |
| 0.0155049 | 41.3 |
| 0.0154533 | 41.02 |
| 0.0154019 | 40.75 |
| 0.0153506 | 40.48 |
| 0.0152995 | 40.21 |
| 0.0152486 | 39.94 |
| 0.0151979 | 39.68 |
| 0.0151473 | 39.41 |
| 0.0150969 | 39.15 |
| 0.0150467 | 38.89 |
| 0.0149966 | 38.63 |
| 0.0149467 | 38.38 |
| 0.014897 | 38.12 |
| 0.0148474 | 37.87 |
| 0.014798 | 37.62 |
| 0.0147488 | 37.37 |
| 0.0146997 | 37.12 |
| 0.0146508 | 36.87 |
| 0.014602 | 36.63 |
| 0.0145534 | 36.38 |
| 0.014505 | 36.14 |
| 0.0144567 | 35.9 |
| 0.0144086 | 35.66 |
| 0.0143607 | 35.43 |
| 0.0143129 | 35.19 |
| 0.0142653 | 34.96 |
| 0.0142178 | 34.72 |
| 0.0141705 | 34.49 |
| 0.0141233 | 34.26 |
| 0.0140763 | 34.04 |
| 0.0140295 | 33.81 |
| 0.0139828 | 33.59 |
| 0.0139363 | 33.36 |
| 0.0138899 | 33.14 |
| 0.0138437 | 32.92 |
| 0.0137976 | 32.7 |
| 0.0137517 | 32.49 |
| 0.013706 | 32.27 |
| 0.0136604 | 32.06 |
| 0.0136149 | 31.84 |
| 0.0135696 | 31.63 |
| 0.0135244 | 31.42 |
| 0.0134794 | 31.21 |
| 0.0134346 | 31.01 |
| 0.0133899 | 30.8 |
| 0.0133453 | 30.59 |
| 0.0133009 | 30.39 |
| 0.0132567 | 30.19 |
| 0.0132126 | 29.99 |
| 0.0131686 | 29.79 |
| 0.0131248 | 29.59 |
| 0.0130811 | 29.4 |
| 0.0130376 | 29.2 |
| 0.0129942 | 29.01 |
| 0.0129509 | 28.81 |
| 0.0129078 | 28.62 |
| 0.0128649 | 28.43 |
| 0.0128221 | 28.24 |
| 0.0127794 | 28.06 |
| 0.0127369 | 27.87 |
| 0.0126945 | 27.68 |
| 0.0126523 | 27.5 |
| 0.0126102 | 27.32 |
| 0.0125682 | 27.14 |
| 0.0125264 | 26.96 |
| 0.0124847 | 26.78 |
| 0.0124432 | 26.6 |
| 0.0124018 | 26.42 |
| 0.0123605 | 26.25 |
| 0.0123194 | 26.07 |
| 0.0122784 | 25.9 |
| 0.0122375 | 25.73 |
| 0.0121968 | 25.56 |
| 0.0121562 | 25.39 |
| 0.0121158 | 25.22 |
| 0.0120754 | 25.05 |
| 0.0120353 | 24.88 |
| 0.0119952 | 24.72 |
| 0.0119553 | 24.55 |
| 0.0119155 | 24.39 |
| 0.0118759 | 24.23 |
| 0.0118363 | 24.07 |
| 0.011797 | 23.91 |
| 0.0117577 | 23.75 |
| 0.0117186 | 23.59 |
| 0.0116796 | 23.43 |
| 0.0116407 | 23.28 |
| 0.011602 | 23.12 |
| 0.0115634 | 22.97 |
| 0.0115249 | 22.82 |
| 0.0114866 | 22.67 |
| 0.0114483 | 22.52 |
| 0.0114102 | 22.37 |
| 0.0113723 | 22.22 |
| 0.0113344 | 22.07 |
| 0.0112967 | 21.92 |
| 0.0112591 | 21.78 |
| 0.0112217 | 21.63 |
| 0.0111843 | 21.49 |
| 0.0111471 | 21.35 |
| 0.01111 | 21.21 |
| 0.011073 | 21.06 |
| 0.0110362 | 20.92 |
| 0.0109995 | 20.79 |
| 0.0109629 | 20.65 |
| 0.0109264 | 20.51 |
| 0.01089 | 20.37 |
| 0.0108538 | 20.24 |
| 0.0108177 | 20.1 |
| 0.0107817 | 19.97 |
| 0.0107458 | 19.84 |
| 0.01071 | 19.71 |
| 0.0106744 | 19.58 |
| 0.0106389 | 19.45 |
| 0.0106035 | 19.32 |
| 0.0105682 | 19.19 |
| 0.010533 | 19.06 |
| 0.010498 | 18.93 |
| 0.0104631 | 18.81 |
| 0.0104282 | 18.68 |
| 0.0103935 | 18.56 |
| 0.010359 | 18.44 |
| 0.0103245 | 18.31 |
| 0.0102901 | 18.19 |
| 0.0102559 | 18.07 |
| 0.0102218 | 17.95 |
| 0.0101878 | 17.83 |
| 0.0101539 | 17.71 |
| 0.0101201 | 17.6 |
| 0.0100864 | 17.48 |
| 0.0100528 | 17.36 |
| 0.0100194 | 17.25 |
| 0.00998604 | 17.13 |
| 0.00995281 | 17.02 |
| 0.00991969 | 16.91 |
| 0.00988668 | 16.79 |
| 0.00985378 | 16.68 |
| 0.00982099 | 16.57 |
| 0.00978831 | 16.46 |
| 0.00975574 | 16.35 |
| 0.00972328 | 16.24 |
| 0.00969092 | 16.13 |
| 0.00965868 | 16.03 |
| 0.00962654 | 15.92 |
| 0.0095945 | 15.82 |
| 0.00956258 | 15.71 |
| 0.00953076 | 15.61 |
| 0.00949904 | 15.5 |
| 0.00946744 | 15.4 |
| 0.00943593 | 15.3 |
| 0.00940453 | 15.2 |
| 0.00937324 | 15.09 |
| 0.00934205 | 14.99 |
| 0.00931097 | 14.89 |
| 0.00927998 | 14.8 |
| 0.0092491 | 14.7 |
| 0.00921833 | 14.6 |
| 0.00918765 | 14.5 |
| 0.00915708 | 14.41 |
| 0.00912661 | 14.31 |
| 0.00909624 | 14.22 |
| 0.00906597 | 14.12 |
| 0.0090358 | 14.03 |
| 0.00900574 | 13.93 |
| 0.00897577 | 13.84 |
| 0.0089459 | 13.75 |
| 0.00891614 | 13.66 |
| 0.00888647 | 13.57 |
| 0.0088569 | 13.48 |
| 0.00882742 | 13.39 |
| 0.00879805 | 13.3 |
| 0.00876877 | 13.21 |
| 0.0087396 | 13.12 |
| 0.00871051 | 13.04 |
| 0.00868153 | 12.95 |
| 0.00865264 | 12.86 |
| 0.00862385 | 12.78 |
| 0.00859515 | 12.69 |
| 0.00856655 | 12.61 |
| 0.00853805 | 12.52 |
| 0.00850964 | 12.44 |
| 0.00848132 | 12.36 |
| 0.0084531 | 12.28 |
| 0.00842497 | 12.2 |
| 0.00839694 | 12.11 |
| 0.00836899 | 12.03 |
| 0.00834115 | 11.95 |
| 0.00831339 | 11.87 |
| 0.00828573 | 11.8 |
| 0.00825816 | 11.72 |
| 0.00823068 | 11.64 |
| 0.00820329 | 11.56 |
| 0.00817599 | 11.49 |
| 0.00814879 | 11.41 |
| 0.00812167 | 11.33 |
| 0.00809465 | 11.26 |
| 0.00806771 | 11.18 |
| 0.00804087 | 11.11 |
| 0.00801411 | 11.04 |
| 0.00798744 | 10.96 |
| 0.00796086 | 10.89 |
| 0.00793437 | 10.82 |
| 0.00790797 | 10.74 |
| 0.00788166 | 10.67 |
| 0.00785543 | 10.6 |
| 0.00782929 | 10.53 |
| 0.00780324 | 10.46 |
| 0.00777727 | 10.39 |
| 0.00775139 | 10.32 |
| 0.0077256 | 10.26 |
| 0.00769989 | 10.19 |
| 0.00767427 | 10.12 |
| 0.00764874 | 10.05 |
| 0.00762328 | 9.985 |
| 0.00759792 | 9.919 |
| 0.00757263 | 9.853 |
| 0.00754744 | 9.788 |
| 0.00752232 | 9.723 |
| 0.00749729 | 9.658 |
| 0.00747234 | 9.594 |
| 0.00744748 | 9.53 |
| 0.0074227 | 9.467 |
| 0.007398 | 9.404 |
| 0.00737338 | 9.341 |
| 0.00734885 | 9.279 |
| 0.00732439 | 9.218 |
| 0.00730002 | 9.156 |
| 0.00727573 | 9.096 |
| 0.00725152 | 9.035 |
| 0.00722739 | 8.975 |
| 0.00720334 | 8.916 |
| 0.00717937 | 8.856 |
| 0.00715548 | 8.798 |
| 0.00713167 | 8.739 |
| 0.00710794 | 8.681 |
| 0.00708429 | 8.623 |
| 0.00706071 | 8.566 |
| 0.00703722 | 8.509 |
| 0.0070138 | 8.453 |
| 0.00699046 | 8.397 |
| 0.0069672 | 8.341 |
| 0.00694402 | 8.285 |
| 0.00692091 | 8.23 |
| 0.00689788 | 8.176 |
| 0.00687493 | 8.121 |
| 0.00685205 | 8.067 |
| 0.00682925 | 8.014 |
| 0.00680653 | 7.961 |
| 0.00678388 | 7.908 |
| 0.00676131 | 7.855 |
| 0.00673881 | 7.803 |
| 0.00671638 | 7.751 |
| 0.00669403 | 7.7 |
| 0.00667176 | 7.648 |
| 0.00664956 | 7.598 |
| 0.00662743 | 7.547 |
| 0.00660538 | 7.497 |
| 0.0065834 | 7.447 |
| 0.00656149 | 7.398 |
| 0.00653966 | 7.349 |
| 0.0065179 | 7.3 |
| 0.00649621 | 7.251 |
| 0.00647459 | 7.203 |
| 0.00645305 | 7.155 |
| 0.00643158 | 7.108 |
| 0.00641017 | 7.061 |
| 0.00638884 | 7.014 |
| 0.00636759 | 6.967 |
| 0.0063464 | 6.921 |
| 0.00632528 | 6.875 |
| 0.00630423 | 6.829 |
| 0.00628325 | 6.784 |
| 0.00626235 | 6.739 |
| 0.00624151 | 6.694 |
| 0.00622074 | 6.65 |
| 0.00620004 | 6.605 |
| 0.00617941 | 6.561 |
| 0.00615885 | 6.518 |
| 0.00613835 | 6.475 |
| 0.00611793 | 6.432 |
| 0.00609757 | 6.389 |
| 0.00607728 | 6.346 |
| 0.00605706 | 6.304 |
| 0.0060369 | 6.262 |
| 0.00601681 | 6.221 |
| 0.00599679 | 6.179 |
| 0.00597684 | 6.138 |
| 0.00595695 | 6.098 |
| 0.00593713 | 6.057 |
| 0.00591737 | 6.017 |
| 0.00589768 | 5.977 |
| 0.00587806 | 5.937 |
| 0.0058585 | 5.898 |
| 0.005839 | 5.859 |
| 0.00581957 | 5.82 |
| 0.00580021 | 5.781 |
| 0.00578091 | 5.743 |
| 0.00576167 | 5.704 |
| 0.0057425 | 5.667 |
| 0.00572339 | 5.629 |
| 0.00570435 | 5.592 |
| 0.00568536 | 5.554 |
| 0.00566645 | 5.517 |
| 0.00564759 | 5.481 |
| 0.0056288 | 5.444 |
| 0.00561007 | 5.408 |
| 0.0055914 | 5.372 |
| 0.0055728 | 5.337 |
| 0.00555425 | 5.301 |
| 0.00553577 | 5.266 |
| 0.00551735 | 5.231 |
| 0.00549899 | 5.196 |
| 0.00548069 | 5.162 |
| 0.00546245 | 5.127 |
| 0.00544428 | 5.093 |
| 0.00542616 | 5.06 |
| 0.00540811 | 5.026 |
| 0.00539011 | 4.993 |
| 0.00537217 | 4.959 |
| 0.0053543 | 4.926 |
| 0.00533648 | 4.894 |
| 0.00531872 | 4.861 |
| 0.00530103 | 4.829 |
| 0.00528339 | 4.797 |
| 0.00526581 | 4.765 |
| 0.00524828 | 4.733 |
| 0.00523082 | 4.702 |
| 0.00521341 | 4.671 |
| 0.00519607 | 4.64 |
| 0.00517878 | 4.609 |
| 0.00516154 | 4.578 |
| 0.00514437 | 4.548 |
| 0.00512725 | 4.518 |
| 0.00511019 | 4.488 |
| 0.00509318 | 4.458 |
| 0.00507624 | 4.428 |
| 0.00505935 | 4.399 |
| 0.00504251 | 4.37 |
| 0.00502573 | 4.34 |
| 0.00500901 | 4.312 |
| 0.00499234 | 4.283 |
| 0.00497573 | 4.255 |
| 0.00495917 | 4.226 |
| 0.00494267 | 4.198 |
| 0.00492622 | 4.17 |
| 0.00490983 | 4.143 |
| 0.00489349 | 4.115 |
| 0.00487721 | 4.088 |
| 0.00486098 | 4.061 |
| 0.0048448 | 4.034 |
| 0.00482868 | 4.007 |
| 0.00481262 | 3.98 |
| 0.0047966 | 3.954 |
| 0.00478064 | 3.928 |
| 0.00476473 | 3.901 |
| 0.00474888 | 3.876 |
| 0.00473308 | 3.85 |
| 0.00471733 | 3.824 |
| 0.00470163 | 3.799 |
| 0.00468598 | 3.774 |
| 0.00467039 | 3.749 |
| 0.00465485 | 3.724 |
| 0.00463936 | 3.699 |
| 0.00462392 | 3.674 |
| 0.00460854 | 3.65 |
| 0.0045932 | 3.626 |
| 0.00457792 | 3.602 |
| 0.00456269 | 3.578 |
| 0.0045475 | 3.554 |
| 0.00453237 | 3.53 |
| 0.00451729 | 3.507 |
| 0.00450226 | 3.484 |
| 0.00448728 | 3.46 |
| 0.00447234 | 3.437 |
| 0.00445746 | 3.415 |
| 0.00444263 | 3.392 |
| 0.00442785 | 3.369 |
| 0.00441311 | 3.347 |
| 0.00439843 | 3.325 |
| 0.00438379 | 3.303 |
| 0.00436921 | 3.281 |
| 0.00435467 | 3.259 |
| 0.00434018 | 3.237 |
| 0.00432573 | 3.216 |
| 0.00431134 | 3.194 |
| 0.00429699 | 3.173 |
| 0.0042827 | 3.152 |
| 0.00426844 | 3.131 |
| 0.00425424 | 3.11 |
| 0.00424008 | 3.09 |
| 0.00422598 | 3.069 |
| 0.00421191 | 3.049 |
| 0.0041979 | 3.029 |
| 0.00418393 | 3.008 |
| 0.00417001 | 2.988 |
| 0.00415613 | 2.969 |
| 0.0041423 | 2.949 |
| 0.00412852 | 2.929 |
| 0.00411478 | 2.91 |
| 0.00410109 | 2.89 |
| 0.00408744 | 2.871 |
| 0.00407384 | 2.852 |
| 0.00406028 | 2.833 |
| 0.00404677 | 2.814 |
| 0.00403331 | 2.796 |
| 0.00401989 | 2.777 |
| 0.00400651 | 2.759 |
| 0.00399318 | 2.74 |
| 0.00397989 | 2.722 |
| 0.00396665 | 2.704 |
| 0.00395345 | 2.686 |
| 0.00394029 | 2.668 |
| 0.00392718 | 2.651 |
| 0.00391411 | 2.633 |
| 0.00390109 | 2.615 |
| 0.00388811 | 2.598 |
| 0.00387517 | 2.581 |
| 0.00386228 | 2.564 |
| 0.00384942 | 2.547 |
| 0.00383662 | 2.53 |
| 0.00382385 | 2.513 |
| 0.00381112 | 2.496 |
| 0.00379844 | 2.48 |
| 0.0037858 | 2.463 |
| 0.00377321 | 2.447 |
| 0.00376065 | 2.431 |
| 0.00374814 | 2.414 |
| 0.00373566 | 2.398 |
| 0.00372323 | 2.382 |
| 0.00371084 | 2.367 |
| 0.0036985 | 2.351 |
| 0.00368619 | 2.335 |
| 0.00367392 | 2.32 |
| 0.0036617 | 2.304 |
| 0.00364951 | 2.289 |
| 0.00363737 | 2.274 |
| 0.00362527 | 2.259 |
| 0.0036132 | 2.244 |
| 0.00360118 | 2.229 |
| 0.0035892 | 2.214 |
| 0.00357725 | 2.199 |
| 0.00356535 | 2.185 |
| 0.00355349 | 2.17 |
| 0.00354166 | 2.156 |
| 0.00352988 | 2.141 |
| 0.00351813 | 2.127 |
| 0.00350643 | 2.113 |
| 0.00349476 | 2.099 |
| 0.00348313 | 2.085 |
| 0.00347154 | 2.071 |
| 0.00345999 | 2.058 |
| 0.00344847 | 2.044 |
| 0.003437 | 2.03 |
| 0.00342556 | 2.017 |
| 0.00341416 | 2.003 |
| 0.0034028 | 1.99 |
| 0.00339148 | 1.982 |
| 0.00338019 | 1.984 |
| 0.00336895 | 1.986 |
| 0.00335774 | 1.988 |
| 0.00334656 | 1.99 |
| 0.00333543 | 1.992 |
| 0.00332433 | 1.994 |
| 0.00331327 | 1.996 |
| 0.00330224 | 1.998 |
| 0.00329125 | 2 |
| 0.0032803 | 2.002 |
| 0.00326939 | 2.004 |
| 0.00325851 | 2.006 |
| 0.00324766 | 2.008 |
| 0.00323686 | 2.01 |
| 0.00322609 | 2.012 |
| 0.00321535 | 2.014 |
| 0.00320465 | 2.016 |
| 0.00319399 | 2.018 |
| 0.00318336 | 2.02 |
| 0.00317277 | 2.022 |
| 0.00316221 | 2.024 |
| 0.00315169 | 2.026 |
| 0.0031412 | 2.028 |
| 0.00313075 | 2.03 |
| 0.00312033 | 2.032 |
| 0.00310995 | 2.034 |
| 0.0030996 | 2.036 |
| 0.00308928 | 2.038 |
| 0.00307901 | 2.04 |
| 0.00306876 | 2.042 |
| 0.00305855 | 2.044 |
| 0.00304837 | 2.046 |
| 0.00303823 | 2.048 |
| 0.00302812 | 2.05 |
| 0.00301804 | 2.052 |
| 0.003008 | 2.054 |
| 0.00299799 | 2.057 |
| 0.00298801 | 2.059 |
| 0.00297807 | 2.061 |
| 0.00296816 | 2.063 |
| 0.00295828 | 2.065 |
| 0.00294844 | 2.067 |
| 0.00293863 | 2.069 |
| 0.00292885 | 2.071 |
| 0.0029191 | 2.073 |
| 0.00290939 | 2.075 |
| 0.00289971 | 2.077 |
| 0.00289006 | 2.079 |
| 0.00288044 | 2.081 |
| 0.00287086 | 2.083 |
| 0.00286131 | 2.085 |
| 0.00285179 | 2.088 |
| 0.0028423 | 2.09 |
| 0.00283284 | 2.092 |
| 0.00282341 | 2.094 |
| 0.00281402 | 2.096 |
| 0.00280465 | 2.098 |
| 0.00279532 | 2.1 |
| 0.00278602 | 2.102 |
| 0.00277675 | 2.104 |
| 0.00276751 | 2.106 |
| 0.0027583 | 2.109 |
| 0.00274912 | 2.111 |
| 0.00273997 | 2.113 |
| 0.00273086 | 2.115 |
| 0.00272177 | 2.117 |
| 0.00271271 | 2.119 |
| 0.00270369 | 2.121 |
| 0.00269469 | 2.123 |
| 0.00268572 | 2.125 |
| 0.00267679 | 2.128 |
| 0.00266788 | 2.13 |
| 0.002659 | 2.132 |
| 0.00265015 | 2.134 |
| 0.00264133 | 2.136 |
| 0.00263255 | 2.138 |
| 0.00262379 | 2.14 |
| 0.00261505 | 2.143 |
| 0.00260635 | 2.145 |
| 0.00259768 | 2.147 |
| 0.00258904 | 2.149 |
| 0.00258042 | 2.151 |
| 0.00257183 | 2.153 |
| 0.00256328 | 2.155 |
| 0.00255475 | 2.158 |
| 0.00254625 | 2.16 |
| 0.00253777 | 2.162 |
| 0.00252933 | 2.164 |
| 0.00252091 | 2.166 |
| 0.00251252 | 2.168 |
| 0.00250416 | 2.171 |
| 0.00249583 | 2.173 |
| 0.00248753 | 2.175 |
| 0.00247925 | 2.177 |
| 0.002471 | 2.179 |
| 0.00246278 | 2.181 |
| 0.00245458 | 2.184 |
| 0.00244641 | 2.186 |
| 0.00243827 | 2.188 |
| 0.00243016 | 2.19 |
| 0.00242207 | 2.192 |
| 0.00241401 | 2.195 |
| 0.00240598 | 2.197 |
| 0.00239798 | 2.199 |
| 0.00239 | 2.201 |
| 0.00238204 | 2.203 |
| 0.00237412 | 2.206 |
| 0.00236622 | 2.208 |
| 0.00235834 | 2.21 |
| 0.0023505 | 2.212 |
| 0.00234267 | 2.214 |
| 0.00233488 | 2.217 |
| 0.00232711 | 2.219 |
| 0.00231937 | 2.221 |
| 0.00231165 | 2.223 |
| 0.00230396 | 2.225 |
| 0.00229629 | 2.228 |
| 0.00228865 | 2.23 |
| 0.00228103 | 2.232 |
| 0.00227344 | 2.234 |
| 0.00226588 | 2.237 |
| 0.00225834 | 2.239 |
| 0.00225082 | 2.241 |
| 0.00224333 | 2.243 |
| 0.00223587 | 2.246 |
| 0.00222843 | 2.248 |
| 0.00222101 | 2.25 |
| 0.00221362 | 2.252 |
| 0.00220626 | 2.255 |
| 0.00219892 | 2.257 |
| 0.0021916 | 2.259 |
| 0.00218431 | 2.261 |
| 0.00217704 | 2.264 |
| 0.00216979 | 2.266 |
| 0.00216257 | 2.268 |
| 0.00215538 | 2.27 |
| 0.00214821 | 2.273 |
| 0.00214106 | 2.275 |
| 0.00213393 | 2.277 |
| 0.00212683 | 2.279 |
| 0.00211975 | 2.282 |
| 0.0021127 | 2.284 |
| 0.00210567 | 2.286 |
| 0.00209866 | 2.289 |
| 0.00209168 | 2.291 |
| 0.00208472 | 2.293 |
| 0.00207778 | 2.295 |
| 0.00207087 | 2.298 |
| 0.00206398 | 2.3 |
| 0.00205711 | 2.302 |
| 0.00205027 | 2.305 |
| 0.00204344 | 2.307 |
| 0.00203664 | 2.309 |
| 0.00202987 | 2.312 |
| 0.00202311 | 2.314 |
| 0.00201638 | 2.316 |
| 0.00200967 | 2.319 |
| 0.00200298 | 2.321 |
| 0.00199632 | 2.323 |
| 0.00198968 | 2.325 |
| 0.00198305 | 2.328 |
| 0.00197646 | 2.33 |
| 0.00196988 | 2.332 |
| 0.00196332 | 2.335 |
| 0.00195679 | 2.337 |
| 0.00195028 | 2.339 |
| 0.00194379 | 2.342 |
| 0.00193732 | 2.344 |
| 0.00193088 | 2.346 |
| 0.00192445 | 2.349 |
| 0.00191805 | 2.351 |
| 0.00191166 | 2.354 |
| 0.0019053 | 2.356 |
| 0.00189896 | 2.358 |
| 0.00189264 | 2.361 |
| 0.00188635 | 2.363 |
| 0.00188007 | 2.365 |
| 0.00187381 | 2.368 |
| 0.00186758 | 2.37 |
| 0.00186136 | 2.372 |
| 0.00185517 | 2.375 |
| 0.001849 | 2.377 |
| 0.00184284 | 2.38 |
| 0.00183671 | 2.382 |
| 0.0018306 | 2.384 |
| 0.00182451 | 2.387 |
| 0.00181844 | 2.389 |
| 0.00181239 | 2.391 |
| 0.00180636 | 2.394 |
| 0.00180035 | 2.396 |
| 0.00179436 | 2.399 |
| 0.00178838 | 2.401 |
| 0.00178243 | 2.403 |
| 0.0017765 | 2.406 |
| 0.00177059 | 2.408 |
| 0.0017647 | 2.411 |
| 0.00175883 | 2.413 |
| 0.00175297 | 2.415 |
| 0.00174714 | 2.418 |
| 0.00174133 | 2.42 |
| 0.00173553 | 2.423 |
| 0.00172976 | 2.425 |
| 0.001724 | 2.428 |
| 0.00171827 | 2.43 |
| 0.00171255 | 2.432 |
| 0.00170685 | 2.435 |
| 0.00170117 | 2.437 |
| 0.00169551 | 2.44 |
| 0.00168987 | 2.442 |
| 0.00168424 | 2.445 |
| 0.00167864 | 2.447 |
| 0.00167305 | 2.45 |
| 0.00166749 | 2.452 |
| 0.00166194 | 2.454 |
| 0.00165641 | 2.457 |
| 0.0016509 | 2.459 |
| 0.0016454 | 2.462 |
| 0.00163993 | 2.464 |
| 0.00163447 | 2.467 |
| 0.00162903 | 2.469 |
| 0.00162361 | 2.472 |
| 0.00161821 | 2.474 |
| 0.00161282 | 2.477 |
| 0.00160746 | 2.479 |
| 0.00160211 | 2.482 |
| 0.00159678 | 2.484 |
| 0.00159146 | 2.487 |
| 0.00158617 | 2.489 |
| 0.00158089 | 2.491 |
| 0.00157563 | 2.494 |
| 0.00157039 | 2.496 |
| 0.00156516 | 2.499 |
| 0.00155995 | 2.501 |
| 0.00155476 | 2.504 |
| 0.00154959 | 2.506 |
| 0.00154443 | 2.509 |
| 0.00153929 | 2.511 |
| 0.00153417 | 2.514 |
| 0.00152907 | 2.517 |
| 0.00152398 | 2.519 |
| 0.00151891 | 2.522 |
| 0.00151385 | 2.524 |
| 0.00150882 | 2.527 |
| 0.0015038 | 2.529 |
| 0.00149879 | 2.532 |
| 0.0014938 | 2.534 |
| 0.00148883 | 2.537 |
| 0.00148388 | 2.539 |
| 0.00147894 | 2.542 |
| 0.00147402 | 2.544 |
| 0.00146912 | 2.547 |
| 0.00146423 | 2.549 |
| 0.00145935 | 2.552 |
| 0.0014545 | 2.555 |
| 0.00144966 | 2.557 |
| 0.00144483 | 2.56 |
| 0.00144003 | 2.562 |
| 0.00143524 | 2.565 |
| 0.00143046 | 2.567 |
| 0.0014257 | 2.57 |
| 0.00142096 | 2.572 |
| 0.00141623 | 2.575 |
| 0.00141151 | 2.578 |
| 0.00140682 | 2.58 |
| 0.00140214 | 2.583 |
| 0.00139747 | 2.585 |
| 0.00139282 | 2.588 |
| 0.00138819 | 2.591 |
| 0.00138357 | 2.593 |
| 0.00137896 | 2.596 |
| 0.00137437 | 2.598 |
| 0.0013698 | 2.601 |
| 0.00136524 | 2.603 |
| 0.0013607 | 2.606 |
| 0.00135617 | 2.609 |
| 0.00135166 | 2.611 |
| 0.00134716 | 2.614 |
| 0.00134268 | 2.617 |
| 0.00133821 | 2.619 |
| 0.00133376 | 2.622 |
| 0.00132932 | 2.624 |
| 0.0013249 | 2.627 |
| 0.00132049 | 2.63 |
| 0.00131609 | 2.632 |
| 0.00131171 | 2.635 |
| 0.00130735 | 2.638 |
| 0.001303 | 2.64 |
| 0.00129866 | 2.643 |
| 0.00129434 | 2.645 |
| 0.00129004 | 2.648 |
| 0.00128574 | 2.651 |
| 0.00128146 | 2.653 |
| 0.0012772 | 2.656 |
| 0.00127295 | 2.659 |
| 0.00126871 | 2.661 |
| 0.00126449 | 2.664 |
| 0.00126029 | 2.667 |
| 0.00125609 | 2.669 |
| 0.00125191 | 2.672 |
| 0.00124775 | 2.675 |
| 0.00124359 | 2.677 |
| 0.00123946 | 2.68 |
| 0.00123533 | 2.683 |
| 0.00123122 | 2.685 |
| 0.00122712 | 2.688 |
| 0.00122304 | 2.691 |
| 0.00121897 | 2.693 |
| 0.00121491 | 2.696 |
| 0.00121087 | 2.699 |
| 0.00120684 | 2.702 |
| 0.00120283 | 2.704 |
| 0.00119882 | 2.707 |
| 0.00119484 | 2.71 |
| 0.00119086 | 2.712 |
| 0.0011869 | 2.715 |
| 0.00118295 | 2.718 |
| 0.00117901 | 2.721 |
| 0.00117509 | 2.723 |
| 0.00117118 | 2.726 |
| 0.00116728 | 2.729 |
| 0.0011634 | 2.731 |
| 0.00115953 | 2.734 |
| 0.00115567 | 2.737 |
| 0.00115182 | 2.74 |
| 0.00114799 | 2.742 |
| 0.00114417 | 2.745 |
| 0.00114036 | 2.748 |
| 0.00113657 | 2.751 |
| 0.00113278 | 2.753 |
| 0.00112902 | 2.756 |
| 0.00112526 | 2.759 |
| 0.00112151 | 2.762 |
| 0.00111778 | 2.764 |
| 0.00111406 | 2.767 |
| 0.00111036 | 2.77 |
| 0.00110666 | 2.773 |
| 0.00110298 | 2.775 |
| 0.00109931 | 2.778 |
| 0.00109565 | 2.781 |
| 0.001092 | 2.784 |
| 0.00108837 | 2.787 |
| 0.00108475 | 2.789 |
| 0.00108114 | 2.792 |
| 0.00107754 | 2.795 |
| 0.00107396 | 2.798 |
| 0.00107038 | 2.801 |
| 0.00106682 | 2.803 |
| 0.00106327 | 2.806 |
| 0.00105973 | 2.809 |
| 0.00105621 | 2.812 |
| 0.00105269 | 2.815 |
| 0.00104919 | 2.817 |
| 0.0010457 | 2.82 |
| 0.00104222 | 2.823 |
| 0.00103875 | 2.826 |
| 0.00103529 | 2.829 |
| 0.00103185 | 2.831 |
| 0.00102842 | 2.834 |
| 0.00102499 | 2.837 |
| 0.00102158 | 2.84 |
| 0.00101818 | 2.843 |
| 0.0010148 | 2.846 |
| 0.00101142 | 2.849 |
| 0.00100805 | 2.851 |
| 0.0010047 | 2.854 |
| 0.00100136 | 2.857 |
| 0.000998024 | 2.86 |
| 0.000994703 | 2.863 |
| 0.000991393 | 2.866 |
| 0.000988094 | 2.869 |
| 0.000984806 | 2.871 |
| 0.000981529 | 2.874 |
| 0.000978263 | 2.877 |
| 0.000975008 | 2.88 |
| 0.000971763 | 2.883 |
| 0.00096853 | 2.886 |
| 0.000965307 | 2.889 |
| 0.000962095 | 2.892 |
| 0.000958893 | 2.894 |
| 0.000955703 | 2.897 |
| 0.000952522 | 2.9 |
| 0.000949353 | 2.903 |
| 0.000946194 | 2.906 |
| 0.000943045 | 2.909 |
| 0.000939907 | 2.912 |
| 0.00093678 | 2.915 |
| 0.000933663 | 2.918 |
| 0.000930556 | 2.921 |
| 0.000927459 | 2.923 |
| 0.000924373 | 2.926 |
| 0.000921297 | 2.929 |
| 0.000918232 | 2.932 |
| 0.000915176 | 2.935 |
| 0.000912131 | 2.938 |
| 0.000909096 | 2.941 |
| 0.000906071 | 2.944 |
| 0.000903056 | 2.947 |
| 0.000900051 | 2.95 |
| 0.000897056 | 2.953 |
| 0.000894071 | 2.956 |
| 0.000891096 | 2.959 |
| 0.000888131 | 2.962 |
| 0.000885175 | 2.965 |
| 0.00088223 | 2.968 |
| 0.000879294 | 2.971 |
| 0.000876368 | 2.974 |
| 0.000873452 | 2.977 |
| 0.000870546 | 2.98 |
| 0.000867649 | 2.983 |
| 0.000864762 | 2.985 |
| 0.000861884 | 2.988 |
| 0.000859016 | 2.991 |
| 0.000856158 | 2.994 |
| 0.000853309 | 2.997 |
| 0.00085047 | 3 |
| 0.00084764 | 3.003 |
| 0.000844819 | 3.006 |
| 0.000842008 | 3.009 |
| 0.000839206 | 3.012 |
| 0.000836414 | 3.015 |
| 0.00083363 | 3.018 |
| 0.000830856 | 3.022 |
| 0.000828092 | 3.025 |
| 0.000825336 | 3.028 |
| 0.00082259 | 3.031 |
| 0.000819853 | 3.034 |
| 0.000817125 | 3.037 |
| 0.000814406 | 3.04 |
| 0.000811696 | 3.043 |
| 0.000808995 | 3.046 |
| 0.000806303 | 3.049 |
| 0.00080362 | 3.052 |
| 0.000800946 | 3.055 |
| 0.00079828 | 3.058 |
| 0.000795624 | 3.061 |
| 0.000792977 | 3.064 |
| 0.000790338 | 3.067 |
| 0.000787708 | 3.07 |
| 0.000785087 | 3.073 |
| 0.000782475 | 3.076 |
| 0.000779871 | 3.079 |
| 0.000777276 | 3.083 |
| 0.000774689 | 3.086 |
| 0.000772112 | 3.089 |
| 0.000769542 | 3.092 |
| 0.000766982 | 3.095 |
| 0.000764429 | 3.098 |
| 0.000761886 | 3.101 |
| 0.000759351 | 3.104 |
| 0.000756824 | 3.107 |
| 0.000754305 | 3.11 |
| 0.000751795 | 3.113 |
| 0.000749294 | 3.117 |
| 0.000746801 | 3.12 |
| 0.000744315 | 3.123 |
| 0.000741839 | 3.126 |
| 0.00073937 | 3.129 |
| 0.00073691 | 3.132 |
| 0.000734458 | 3.135 |
| 0.000732014 | 3.138 |
| 0.000729578 | 3.142 |
| 0.00072715 | 3.145 |
| 0.000724731 | 3.148 |
| 0.000722319 | 3.151 |
| 0.000719916 | 3.154 |
| 0.00071752 | 3.157 |
| 0.000715133 | 3.16 |
| 0.000712753 | 3.164 |
| 0.000710381 | 3.167 |
| 0.000708017 | 3.17 |
| 0.000705661 | 3.173 |
| 0.000703313 | 3.176 |
| 0.000700973 | 3.179 |
| 0.000698641 | 3.183 |
| 0.000696316 | 3.186 |
| 0.000693999 | 3.189 |
| 0.000691689 | 3.192 |
| 0.000689388 | 3.195 |
| 0.000687094 | 3.199 |
| 0.000684807 | 3.202 |
| 0.000682529 | 3.205 |
| 0.000680258 | 3.208 |
| 0.000677994 | 3.211 |
| 0.000675738 | 3.215 |
| 0.000673489 | 3.218 |
| 0.000671248 | 3.221 |
| 0.000669015 | 3.224 |
| 0.000666789 | 3.228 |
| 0.00066457 | 3.231 |
| 0.000662358 | 3.234 |
| 0.000660154 | 3.237 |
| 0.000657958 | 3.24 |
| 0.000655768 | 3.244 |
| 0.000653586 | 3.247 |
| 0.000651411 | 3.25 |
| 0.000649244 | 3.253 |
| 0.000647083 | 3.257 |
| 0.00064493 | 3.26 |
| 0.000642784 | 3.263 |
| 0.000640645 | 3.266 |
| 0.000638513 | 3.27 |
| 0.000636389 | 3.273 |
| 0.000634271 | 3.276 |
| 0.000632161 | 3.28 |
| 0.000630057 | 3.283 |
| 0.000627961 | 3.286 |
| 0.000625871 | 3.289 |
| 0.000623788 | 3.293 |
| 0.000621713 | 3.296 |
| 0.000619644 | 3.299 |
| 0.000617582 | 3.303 |
| 0.000615527 | 3.306 |
| 0.000613479 | 3.309 |
| 0.000611437 | 3.312 |
| 0.000609403 | 3.316 |
| 0.000607375 | 3.319 |
| 0.000605354 | 3.322 |
| 0.00060334 | 3.326 |
| 0.000601332 | 3.329 |
| 0.000599331 | 3.332 |
| 0.000597337 | 3.336 |
| 0.000595349 | 3.339 |
| 0.000593368 | 3.342 |
| 0.000591394 | 3.346 |
| 0.000589426 | 3.349 |
| 0.000587464 | 3.352 |
| 0.00058551 | 3.356 |
| 0.000583561 | 3.359 |
| 0.000581619 | 3.363 |
| 0.000579684 | 3.366 |
| 0.000577755 | 3.369 |
| 0.000575833 | 3.373 |
| 0.000573916 | 3.376 |
| 0.000572007 | 3.379 |
| 0.000570103 | 3.383 |
| 0.000568206 | 3.386 |
| 0.000566316 | 3.389 |
| 0.000564431 | 3.393 |
| 0.000562553 | 3.396 |
| 0.000560681 | 3.4 |
| 0.000558815 | 3.403 |
| 0.000556956 | 3.406 |
| 0.000555103 | 3.41 |
| 0.000553255 | 3.413 |
| 0.000551414 | 3.417 |
| 0.00054958 | 3.42 |
| 0.000547751 | 3.424 |
| 0.000545928 | 3.427 |
| 0.000544112 | 3.43 |
| 0.000542301 | 3.434 |
| 0.000540497 | 3.437 |
| 0.000538698 | 3.441 |
| 0.000536905 | 3.444 |
| 0.000535119 | 3.448 |
| 0.000533338 | 3.451 |
| 0.000531564 | 3.454 |
| 0.000529795 | 3.458 |
| 0.000528032 | 3.461 |
| 0.000526275 | 3.465 |
| 0.000524524 | 3.468 |
| 0.000522778 | 3.472 |
| 0.000521039 | 3.475 |
| 0.000519305 | 3.479 |
| 0.000517577 | 3.482 |
| 0.000515855 | 3.486 |
| 0.000514138 | 3.489 |
| 0.000512427 | 3.493 |
| 0.000510722 | 3.496 |
| 0.000509023 | 3.5 |
| 0.000507329 | 3.503 |
| 0.000505641 | 3.507 |
| 0.000503958 | 3.51 |
| 0.000502281 | 3.514 |
| 0.00050061 | 3.517 |
| 0.000498944 | 3.521 |
| 0.000497284 | 3.524 |
| 0.000495629 | 3.528 |
| 0.00049398 | 3.531 |
| 0.000492336 | 3.535 |
| 0.000490698 | 3.538 |
| 0.000489065 | 3.542 |
| 0.000487438 | 3.545 |
| 0.000485816 | 3.549 |
| 0.000484199 | 3.552 |
| 0.000482588 | 3.556 |
| 0.000480982 | 3.56 |
| 0.000479382 | 3.563 |
| 0.000477786 | 3.567 |
| 0.000476197 | 3.57 |
| 0.000474612 | 3.574 |
| 0.000473033 | 3.577 |
| 0.000471459 | 3.581 |
| 0.00046989 | 3.585 |
| 0.000468326 | 3.588 |
| 0.000466768 | 3.592 |
| 0.000465215 | 3.595 |
| 0.000463667 | 3.599 |
| 0.000462124 | 3.603 |
| 0.000460586 | 3.606 |
| 0.000459054 | 3.61 |
| 0.000457526 | 3.613 |
| 0.000456004 | 3.617 |
| 0.000454486 | 3.621 |
| 0.000452974 | 3.624 |
| 0.000451467 | 3.628 |
| 0.000449964 | 3.631 |
| 0.000448467 | 3.635 |
| 0.000446975 | 3.639 |
| 0.000445487 | 3.642 |
| 0.000444005 | 3.646 |
| 0.000442528 | 3.65 |
| 0.000441055 | 3.653 |
| 0.000439587 | 3.657 |
| 0.000438125 | 3.661 |
| 0.000436667 | 3.664 |
| 0.000435214 | 3.668 |
| 0.000433766 | 3.672 |
| 0.000432322 | 3.675 |
| 0.000430884 | 3.679 |
| 0.00042945 | 3.683 |
| 0.000428021 | 3.686 |
| 0.000426597 | 3.69 |
| 0.000425177 | 3.694 |
| 0.000423762 | 3.697 |
| 0.000422352 | 3.701 |
| 0.000420947 | 3.705 |
| 0.000419546 | 3.708 |
| 0.00041815 | 3.712 |
| 0.000416759 | 3.716 |
| 0.000415372 | 3.72 |
| 0.00041399 | 3.723 |
| 0.000412612 | 3.727 |
| 0.000411239 | 3.731 |
| 0.000409871 | 3.735 |
| 0.000408507 | 3.738 |
| 0.000407147 | 3.742 |
| 0.000405793 | 3.746 |
| 0.000404442 | 3.749 |
| 0.000403097 | 3.753 |
| 0.000401755 | 3.757 |
| 0.000400418 | 3.761 |
| 0.000399086 | 3.764 |
| 0.000397758 | 3.768 |
| 0.000396434 | 3.772 |
| 0.000395115 | 3.776 |
| 0.000393801 | 3.78 |
| 0.00039249 | 3.783 |
| 0.000391184 | 3.787 |
| 0.000389882 | 3.791 |
| 0.000388585 | 3.795 |
| 0.000387292 | 3.799 |
| 0.000386003 | 3.802 |
| 0.000384719 | 3.806 |
| 0.000383439 | 3.81 |
| 0.000382163 | 3.814 |
| 0.000380891 | 3.818 |
| 0.000379624 | 3.821 |
| 0.000378361 | 3.825 |
| 0.000377102 | 3.829 |
| 0.000375847 | 3.833 |
| 0.000374596 | 3.837 |
| 0.00037335 | 3.84 |
| 0.000372107 | 3.844 |
| 0.000370869 | 3.848 |
| 0.000369635 | 3.852 |
| 0.000368405 | 3.856 |
| 0.000367179 | 3.86 |
| 0.000365957 | 3.864 |
| 0.00036474 | 3.867 |
| 0.000363526 | 3.871 |
| 0.000362316 | 3.875 |
| 0.000361111 | 3.879 |
| 0.000359909 | 3.883 |
| 0.000358711 | 3.887 |
| 0.000357518 | 3.891 |
| 0.000356328 | 3.895 |
| 0.000355142 | 3.898 |
| 0.000353961 | 3.902 |
| 0.000352783 | 3.906 |
| 0.000351609 | 3.91 |
| 0.000350439 | 3.914 |
| 0.000349273 | 3.918 |
| 0.000348111 | 3.922 |
| 0.000346952 | 3.926 |
| 0.000345798 | 3.93 |
| 0.000344647 | 3.934 |
| 0.0003435 | 3.938 |
| 0.000342357 | 3.942 |
| 0.000341218 | 3.946 |
| 0.000340083 | 3.949 |
| 0.000338951 | 3.953 |
| 0.000337823 | 3.957 |
| 0.000336699 | 3.961 |
| 0.000335579 | 3.965 |
| 0.000334462 | 3.969 |
| 0.000333349 | 3.973 |
| 0.00033224 | 3.977 |
| 0.000331134 | 3.981 |
| 0.000330032 | 3.985 |
| 0.000328934 | 3.989 |
| 0.00032784 | 3.993 |
| 0.000326749 | 3.997 |
| 0.000325661 | 4.001 |
| 0.000324578 | 4.005 |
| 0.000323498 | 4.009 |
| 0.000322421 | 4.013 |
| 0.000321348 | 4.017 |
| 0.000320279 | 4.021 |
| 0.000319213 | 4.025 |
| 0.000318151 | 4.029 |
| 0.000317093 | 4.033 |
| 0.000316037 | 4.037 |
| 0.000314986 | 4.041 |
| 0.000313938 | 4.045 |
| 0.000312893 | 4.049 |
| 0.000311852 | 4.053 |
| 0.000310814 | 4.057 |
| 0.00030978 | 4.062 |
| 0.000308749 | 4.066 |
| 0.000307722 | 4.07 |
| 0.000306698 | 4.074 |
| 0.000305677 | 4.078 |
| 0.00030466 | 4.082 |
| 0.000303646 | 4.086 |
| 0.000302636 | 4.09 |
| 0.000301629 | 4.094 |
| 0.000300625 | 4.098 |
| 0.000299625 | 4.102 |
| 0.000298628 | 4.106 |
| 0.000297634 | 4.111 |
| 0.000296644 | 4.115 |
| 0.000295657 | 4.119 |
| 0.000294673 | 4.123 |
| 0.000293692 | 4.127 |
| 0.000292715 | 4.131 |
| 0.000291741 | 4.135 |
| 0.00029077 | 4.139 |
| 0.000289803 | 4.144 |
| 0.000288838 | 4.148 |
| 0.000287877 | 4.152 |
| 0.000286919 | 4.156 |
| 0.000285965 | 4.16 |
| 0.000285013 | 4.164 |
| 0.000284065 | 4.168 |
| 0.000283119 | 4.173 |
| 0.000282177 | 4.177 |
| 0.000281238 | 4.181 |
| 0.000280302 | 4.185 |
| 0.00027937 | 4.189 |
| 0.00027844 | 4.194 |
| 0.000277514 | 4.198 |
| 0.00027659 | 4.202 |
| 0.00027567 | 4.206 |
| 0.000274753 | 4.21 |
| 0.000273838 | 4.215 |
| 0.000272927 | 4.219 |
| 0.000272019 | 4.223 |
| 0.000271114 | 4.227 |
| 0.000270212 | 4.231 |
| 0.000269312 | 4.236 |
| 0.000268416 | 4.24 |
| 0.000267523 | 4.244 |
| 0.000266633 | 4.248 |
| 0.000265746 | 4.253 |
| 0.000264861 | 4.257 |
| 0.00026398 | 4.261 |
| 0.000263102 | 4.265 |
| 0.000262226 | 4.27 |
| 0.000261354 | 4.274 |
| 0.000260484 | 4.278 |
| 0.000259617 | 4.282 |
| 0.000258753 | 4.287 |
| 0.000257892 | 4.291 |
| 0.000257034 | 4.295 |
| 0.000256179 | 4.3 |
| 0.000255326 | 4.304 |
| 0.000254477 | 4.308 |
| 0.00025363 | 4.313 |
| 0.000252786 | 4.317 |
| 0.000251945 | 4.321 |
| 0.000251107 | 4.325 |
| 0.000250271 | 4.33 |
| 0.000249438 | 4.334 |
| 0.000248608 | 4.338 |
| 0.000247781 | 4.343 |
| 0.000246956 | 4.347 |
| 0.000246135 | 4.351 |
| 0.000245316 | 4.356 |
| 0.000244499 | 4.36 |
| 0.000243686 | 4.365 |
| 0.000242875 | 4.369 |
| 0.000242067 | 4.373 |
| 0.000241261 | 4.378 |
| 0.000240458 | 4.382 |
| 0.000239658 | 4.386 |
| 0.000238861 | 4.391 |
| 0.000238066 | 4.395 |
| 0.000237274 | 4.4 |
| 0.000236484 | 4.404 |
| 0.000235697 | 4.408 |
| 0.000234913 | 4.413 |
| 0.000234131 | 4.417 |
| 0.000233352 | 4.422 |
| 0.000232576 | 4.426 |
| 0.000231802 | 4.43 |
| 0.000231031 | 4.435 |
| 0.000230262 | 4.439 |
| 0.000229496 | 4.444 |
| 0.000228732 | 4.448 |
| 0.000227971 | 4.453 |
| 0.000227212 | 4.457 |
| 0.000226456 | 4.462 |
| 0.000225703 | 4.466 |
| 0.000224952 | 4.471 |
| 0.000224203 | 4.475 |
| 0.000223457 | 4.479 |
| 0.000222713 | 4.484 |
| 0.000221972 | 4.488 |
| 0.000221234 | 4.493 |
| 0.000220498 | 4.497 |
| 0.000219764 | 4.502 |
| 0.000219033 | 4.506 |
| 0.000218304 | 4.511 |
| 0.000217577 | 4.515 |
| 0.000216853 | 4.52 |
| 0.000216132 | 4.524 |
| 0.000215413 | 4.529 |
| 0.000214696 | 4.533 |
| 0.000213981 | 4.538 |
| 0.000213269 | 4.543 |
| 0.00021256 | 4.547 |
| 0.000211852 | 4.552 |
| 0.000211147 | 4.556 |
| 0.000210445 | 4.561 |
| 0.000209745 | 4.565 |
| 0.000209047 | 4.57 |
| 0.000208351 | 4.574 |
| 0.000207658 | 4.579 |
| 0.000206967 | 4.584 |
| 0.000206278 | 4.588 |
| 0.000205592 | 4.593 |
| 0.000204908 | 4.597 |
| 0.000204226 | 4.602 |
| 0.000203546 | 4.607 |
| 0.000202869 | 4.611 |
| 0.000202194 | 4.616 |
| 0.000201521 | 4.62 |
| 0.00020085 | 4.625 |
| 0.000200182 | 4.63 |
| 0.000199516 | 4.634 |
| 0.000198852 | 4.639 |
| 0.00019819 | 4.644 |
| 0.000197531 | 4.648 |
| 0.000196874 | 4.653 |
| 0.000196218 | 4.657 |
| 0.000195566 | 4.662 |
| 0.000194915 | 4.667 |
| 0.000194266 | 4.671 |
| 0.00019362 | 4.676 |
| 0.000192975 | 4.681 |
| 0.000192333 | 4.685 |
| 0.000191693 | 4.69 |
| 0.000191055 | 4.695 |
| 0.00019042 | 4.7 |
| 0.000189786 | 4.704 |
| 0.000189155 | 4.709 |
| 0.000188525 | 4.714 |
| 0.000187898 | 4.718 |
| 0.000187273 | 4.723 |
| 0.000186649 | 4.728 |
| 0.000186028 | 4.733 |
| 0.000185409 | 4.737 |
| 0.000184792 | 4.742 |
| 0.000184177 | 4.747 |
| 0.000183565 | 4.752 |
| 0.000182954 | 4.756 |
| 0.000182345 | 4.761 |
| 0.000181738 | 4.766 |
| 0.000181134 | 4.771 |
| 0.000180531 | 4.775 |
| 0.00017993 | 4.78 |
| 0.000179331 | 4.785 |
| 0.000178735 | 4.79 |
| 0.00017814 | 4.794 |
| 0.000177547 | 4.799 |
| 0.000176956 | 4.804 |
| 0.000176367 | 4.809 |
| 0.000175781 | 4.814 |
| 0.000175196 | 4.818 |
| 0.000174613 | 4.823 |
| 0.000174032 | 4.828 |
| 0.000173453 | 4.833 |
| 0.000172875 | 4.838 |
| 0.0001723 | 4.843 |
| 0.000171727 | 4.847 |
| 0.000171155 | 4.852 |
| 0.000170586 | 4.857 |
| 0.000170018 | 4.862 |
| 0.000169452 | 4.867 |
| 0.000168889 | 4.872 |
| 0.000168327 | 4.877 |
| 0.000167767 | 4.881 |
| 0.000167208 | 4.886 |
| 0.000166652 | 4.891 |
| 0.000166097 | 4.896 |
| 0.000165545 | 4.901 |
| 0.000164994 | 4.906 |
| 0.000164445 | 4.911 |
| 0.000163898 | 4.916 |
| 0.000163352 | 4.921 |
| 0.000162809 | 4.926 |
| 0.000162267 | 4.93 |
| 0.000161727 | 4.935 |
| 0.000161189 | 4.94 |
| 0.000160652 | 4.945 |
| 0.000160118 | 4.95 |
| 0.000159585 | 4.955 |
| 0.000159054 | 4.96 |
| 0.000158525 | 4.965 |
| 0.000157997 | 4.97 |
| 0.000157472 | 4.975 |
| 0.000156948 | 4.98 |
| 0.000156425 | 4.985 |
| 0.000155905 | 4.99 |
| 0.000155386 | 4.995 |
| 0.000154869 | 5 |
| 0.000154354 | 5.005 |
| 0.00015384 | 5.01 |
| 0.000153328 | 5.015 |
| 0.000152818 | 5.02 |
| 0.000152309 | 5.025 |
| 0.000151803 | 5.03 |
| 0.000151297 | 5.035 |
| 0.000150794 | 5.04 |
| 0.000150292 | 5.045 |
| 0.000149792 | 5.05 |
| 0.000149294 | 5.055 |
| 0.000148797 | 5.06 |
| 0.000148302 | 5.065 |
| 0.000147808 | 5.07 |
| 0.000147316 | 5.075 |
| 0.000146826 | 5.081 |
| 0.000146338 | 5.086 |
| 0.000145851 | 5.091 |
| 0.000145365 | 5.096 |
| 0.000144882 | 5.101 |
| 0.0001444 | 5.106 |
| 0.000143919 | 5.111 |
| 0.00014344 | 5.116 |
| 0.000142963 | 5.121 |
| 0.000142487 | 5.126 |
| 0.000142013 | 5.132 |
| 0.00014154 | 5.137 |
| 0.000141069 | 5.142 |
| 0.0001406 | 5.147 |
| 0.000140132 | 5.152 |
| 0.000139666 | 5.157 |
| 0.000139201 | 5.162 |
| 0.000138738 | 5.168 |
| 0.000138276 | 5.173 |
| 0.000137816 | 5.178 |
| 0.000137358 | 5.183 |
| 0.000136901 | 5.188 |
| 0.000136445 | 5.193 |
| 0.000135991 | 5.199 |
| 0.000135538 | 5.204 |
| 0.000135087 | 5.209 |
| 0.000134638 | 5.214 |
| 0.00013419 | 5.219 |
| 0.000133743 | 5.225 |
| 0.000133298 | 5.23 |
| 0.000132855 | 5.235 |
| 0.000132413 | 5.24 |
| 0.000131972 | 5.246 |
| 0.000131533 | 5.251 |
| 0.000131095 | 5.256 |
| 0.000130659 | 5.261 |
| 0.000130224 | 5.267 |
| 0.000129791 | 5.272 |
| 0.000129359 | 5.277 |
| 0.000128929 | 5.282 |
| 0.0001285 | 5.288 |
| 0.000128072 | 5.293 |
| 0.000127646 | 5.298 |
| 0.000127221 | 5.304 |
| 0.000126798 | 5.309 |
| 0.000126376 | 5.314 |
| 0.000125955 | 5.32 |
| 0.000125536 | 5.325 |
| 0.000125119 | 5.33 |
| 0.000124702 | 5.336 |
| 0.000124287 | 5.341 |
| 0.000123874 | 5.346 |
| 0.000123461 | 5.352 |
| 0.000123051 | 5.357 |
| 0.000122641 | 5.362 |
| 0.000122233 | 5.368 |
| 0.000121826 | 5.373 |
| 0.000121421 | 5.378 |
| 0.000121017 | 5.384 |
| 0.000120614 | 5.389 |
| 0.000120213 | 5.394 |
| 0.000119813 | 5.4 |
| 0.000119414 | 5.405 |
| 0.000119017 | 5.411 |
| 0.000118621 | 5.416 |
| 0.000118226 | 5.422 |
| 0.000117833 | 5.427 |
| 0.000117441 | 5.432 |
| 0.00011705 | 5.438 |
| 0.00011666 | 5.443 |
| 0.000116272 | 5.449 |
| 0.000115885 | 5.454 |
| 0.0001155 | 5.46 |
| 0.000115115 | 5.465 |
| 0.000114732 | 5.47 |
| 0.00011435 | 5.476 |
| 0.00011397 | 5.481 |
| 0.000113591 | 5.487 |
| 0.000113213 | 5.492 |
| 0.000112836 | 5.498 |
| 0.000112461 | 5.503 |
| 0.000112086 | 5.509 |
| 0.000111713 | 5.514 |
| 0.000111342 | 5.52 |
| 0.000110971 | 5.525 |
| 0.000110602 | 5.531 |
| 0.000110234 | 5.536 |
| 0.000109867 | 5.542 |
| 0.000109501 | 5.548 |
| 0.000109137 | 5.553 |
| 0.000108774 | 5.559 |
| 0.000108412 | 5.564 |
| 0.000108051 | 5.57 |
| 0.000107692 | 5.575 |
| 0.000107333 | 5.581 |
| 0.000106976 | 5.587 |
| 0.00010662 | 5.592 |
| 0.000106265 | 5.598 |
| 0.000105912 | 5.603 |
| 0.000105559 | 5.609 |
| 0.000105208 | 5.614 |
| 0.000104858 | 5.62 |
| 0.000104509 | 5.626 |
| 0.000104161 | 5.631 |
| 0.000103815 | 5.637 |
| 0.000103469 | 5.643 |
| 0.000103125 | 5.648 |
| 0.000102782 | 5.654 |
| 0.00010244 | 5.66 |
| 0.000102099 | 5.665 |
| 0.000101759 | 5.671 |
| 0.000101421 | 5.677 |
| 9.9737e-05 | 5.705 |
| 9.67964e-05 | 5.757 |
| 9.39426e-05 | 5.808 |
| 9.11729e-05 | 5.861 |
| 8.84849e-05 | 5.914 |
| 8.58761e-05 | 5.967 |
| 8.33442e-05 | 6.021 |
| 8.0887e-05 | 6.075 |
| 7.85022e-05 | 6.13 |
| 7.61877e-05 | 6.185 |
| 7.39415e-05 | 6.241 |
| 7.17615e-05 | 6.297 |
| 6.96457e-05 | 6.354 |
| 6.75924e-05 | 6.411 |
| 6.55996e-05 | 6.469 |
| 6.36655e-05 | 6.527 |
| 6.17885e-05 | 6.586 |
| 5.99668e-05 | 6.645 |
| 5.81988e-05 | 6.705 |
| 5.64829e-05 | 6.766 |
| 5.48176e-05 | 6.827 |
| 5.32014e-05 | 6.888 |
| 5.16329e-05 | 6.95 |
| 5.01106e-05 | 7.013 |
| 4.86332e-05 | 7.076 |
| 4.71994e-05 | 7.14 |
| 4.58078e-05 | 7.204 |
| 4.44572e-05 | 7.269 |
| 4.31465e-05 | 7.335 |
| 4.18744e-05 | 7.401 |
| 4.06399e-05 | 7.467 |
| 3.94417e-05 | 7.535 |
| 3.82788e-05 | 7.603 |
| 3.71502e-05 | 7.671 |
| 3.6055e-05 | 7.74 |
| 3.49919e-05 | 7.81 |
| 3.39603e-05 | 7.88 |
| 3.2959e-05 | 7.951 |
| 3.19873e-05 | 8.023 |
| 3.10442e-05 | 8.095 |
| 3.0129e-05 | 8.168 |
| 2.92407e-05 | 8.242 |
| 2.83786e-05 | 8.316 |
| 2.75419e-05 | 8.391 |
| 2.67299e-05 | 8.467 |
| 2.59418e-05 | 8.543 |
| 2.5177e-05 | 8.62 |
| 2.44347e-05 | 8.698 |
| 2.37143e-05 | 8.776 |
| 2.30151e-05 | 8.855 |
| 2.23366e-05 | 8.935 |
| 2.1678e-05 | 9.016 |
| 2.10389e-05 | 9.097 |
| 2.04186e-05 | 9.179 |
| 1.98166e-05 | 9.262 |
| 1.92323e-05 | 9.345 |
| 1.86653e-05 | 9.429 |
| 1.8115e-05 | 9.514 |
| 1.75809e-05 | 9.6 |
| 1.70626e-05 | 9.687 |
| 1.65595e-05 | 9.774 |
| 1.60713e-05 | 9.862 |
| 1.55975e-05 | 9.951 |
| 1.51376e-05 | 10.04 |
| 1.46913e-05 | 10.13 |
| 1.42582e-05 | 10.22 |
| 1.38378e-05 | 10.31 |
| 1.34298e-05 | 10.41 |
| 1.30339e-05 | 10.5 |
| 1.26496e-05 | 10.6 |
| 1.22767e-05 | 10.59 |
| 1.19147e-05 | 10.38 |
| 1.15634e-05 | 10.18 |
| 1.12225e-05 | 9.976 |
| 1.08916e-05 | 9.778 |
| 1.05705e-05 | 9.584 |
| 1.02589e-05 | 9.394 |
| 9.9564e-06 | 9.207 |
| 9.66286e-06 | 9.024 |
| 9.37797e-06 | 8.845 |
| 9.10148e-06 | 8.67 |
| 8.83314e-06 | 8.498 |
| 8.57272e-06 | 8.329 |
| 8.31997e-06 | 8.164 |
| 8.07467e-06 | 8.002 |
| 7.83661e-06 | 7.843 |
| 7.60556e-06 | 7.687 |
| 7.38133e-06 | 7.535 |
| 7.16371e-06 | 7.385 |
| 6.9525e-06 | 7.239 |
| 6.74752e-06 | 7.095 |
| 6.54858e-06 | 6.954 |
| 6.35551e-06 | 6.816 |
| 6.16813e-06 | 6.681 |
| 5.98628e-06 | 6.548 |
| 5.80979e-06 | 6.419 |
| 5.6385e-06 | 6.291 |
| 5.47226e-06 | 6.166 |
| 5.31092e-06 | 6.044 |
| 5.15434e-06 | 5.924 |
| 5.00237e-06 | 5.806 |
| 4.85489e-06 | 5.691 |
| 4.71175e-06 | 5.578 |
| 4.57284e-06 | 5.468 |
| 4.43802e-06 | 5.359 |
| 4.30717e-06 | 5.253 |
| 4.18018e-06 | 5.148 |
| 4.05694e-06 | 5.046 |
| 3.93733e-06 | 4.946 |
| 3.82125e-06 | 4.848 |
| 3.70858e-06 | 4.752 |
| 3.59924e-06 | 4.657 |
| 3.49313e-06 | 4.565 |
| 3.39014e-06 | 4.474 |
| 3.29019e-06 | 4.386 |
| 3.19319e-06 | 4.299 |
| 3.09904e-06 | 4.213 |
| 3.00767e-06 | 4.13 |
| 2.919e-06 | 4.048 |
| 2.83294e-06 | 3.967 |
| 2.74941e-06 | 3.889 |
| 2.66835e-06 | 3.812 |
| 2.58968e-06 | 3.736 |
| 2.51333e-06 | 3.662 |
| 2.43923e-06 | 3.589 |
| 2.36732e-06 | 3.518 |
| 2.29752e-06 | 3.448 |
| 2.22978e-06 | 3.38 |
| 2.16404e-06 | 3.313 |
| 2.10024e-06 | 3.247 |
| 2.03832e-06 | 3.182 |
| 1.97822e-06 | 3.119 |
| 1.9199e-06 | 3.057 |
| 1.8633e-06 | 2.997 |
| 1.80836e-06 | 2.937 |
| 1.75504e-06 | 2.879 |
| 1.7033e-06 | 2.822 |
| 1.65308e-06 | 2.766 |
| 1.60434e-06 | 2.711 |
| 1.55704e-06 | 2.657 |
| 1.51114e-06 | 2.604 |
| 1.46659e-06 | 2.553 |
| 1.42335e-06 | 2.502 |
| 1.38138e-06 | 2.452 |
| 1.34065e-06 | 2.404 |
| 1.30113e-06 | 2.356 |
| 1.26277e-06 | 2.309 |
| 1.22554e-06 | 2.263 |
| 1.1894e-06 | 2.219 |
| 1.15434e-06 | 2.174 |
| 1.1203e-06 | 2.131 |
| 1.08727e-06 | 2.089 |
| 1.05522e-06 | 2.048 |
| 1.02411e-06 | 2.007 |
| 9.93914e-07 | 1.967 |
| 9.64611e-07 | 1.928 |
| 9.36171e-07 | 1.89 |
| 9.0857e-07 | 1.852 |
| 8.81783e-07 | 1.816 |
| 8.55786e-07 | 1.78 |
| 8.30554e-07 | 1.744 |
| 8.06067e-07 | 1.71 |
| 7.82302e-07 | 1.676 |
| 7.59238e-07 | 1.642 |
| 7.36853e-07 | 1.61 |
| 7.15129e-07 | 1.578 |
| 6.94045e-07 | 1.547 |
| 6.73582e-07 | 1.516 |
| 6.53723e-07 | 1.486 |
| 6.34449e-07 | 1.456 |
| 6.15744e-07 | 1.427 |
| 5.9759e-07 | 1.399 |
| 5.79971e-07 | 1.371 |
| 5.62872e-07 | 1.344 |
| 5.46277e-07 | 1.317 |
| 5.30171e-07 | 1.291 |
| 5.1454e-07 | 1.266 |
| 4.9937e-07 | 1.241 |
| 4.84647e-07 | 1.216 |
| 4.70358e-07 | 1.192 |
| 4.56491e-07 | 1.168 |
| 4.43032e-07 | 1.145 |
| 4.2997e-07 | 1.122 |
| 4.17294e-07 | 1.1 |
| 4.04991e-07 | 1.078 |
| 3.9305e-07 | 1.057 |
| 3.81462e-07 | 1.036 |
| 3.70215e-07 | 1.015 |
| 3.593e-07 | 0.995 |
| 3.48707e-07 | 0.975 |
| 3.38426e-07 | 0.956 |
| 3.28449e-07 | 0.937 |
| 3.18765e-07 | 0.918 |
| 3.09367e-07 | 0.9 |
| 3.00246e-07 | 0.882 |
| 2.91394e-07 | 0.865 |
| 2.82803e-07 | 0.848 |
| 2.74465e-07 | 0.831 |
| 2.66373e-07 | 0.814 |
| 2.58519e-07 | 0.798 |
| 2.50897e-07 | 0.782 |
| 2.435e-07 | 0.767 |
| 2.36321e-07 | 0.752 |
| 2.29354e-07 | 0.737 |
| 2.22592e-07 | 0.722 |
| 2.16029e-07 | 0.708 |
| 2.0966e-07 | 0.694 |
| 2.03478e-07 | 0.68 |
| 1.97479e-07 | 0.666 |
| 1.91657e-07 | 0.653 |
| 1.86006e-07 | 0.64 |
| 1.80522e-07 | 0.628 |
| 1.752e-07 | 0.615 |
| 1.70035e-07 | 0.603 |
| 1.65022e-07 | 0.591 |
| 1.60156e-07 | 0.579 |
| 1.55434e-07 | 0.568 |
| 1.50852e-07 | 0.556 |
| 1.46404e-07 | 0.545 |
| 1.42088e-07 | 0.535 |
| 1.37899e-07 | 0.524 |
| 1.33833e-07 | 0.514 |
| 1.29887e-07 | 0.503 |
| 1.26058e-07 | 0.493 |
| 1.22341e-07 | 0.484 |
| 1.18734e-07 | 0.474 |
| 1.15234e-07 | 0.465 |
| 1.11836e-07 | 0.455 |
| 1.08539e-07 | 0.446 |
| 1.05339e-07 | 0.438 |
| 1.02233e-07 | 0.429 |
| 9.92191e-08 | 0.42 |
| 9.62938e-08 | 0.412 |
| 9.34548e-08 | 0.404 |
| 9.06995e-08 | 0.396 |
| 8.80254e-08 | 0.388 |
| 8.54302e-08 | 0.38 |
| 8.29115e-08 | 0.373 |
| 8.0467e-08 | 0.365 |
| 7.80946e-08 | 0.358 |
| 7.57921e-08 | 0.351 |
| 7.35576e-08 | 0.344 |
| 7.13889e-08 | 0.337 |
| 6.92841e-08 | 0.33 |
| 6.72414e-08 | 0.324 |
| 6.5259e-08 | 0.317 |
| 6.33349e-08 | 0.311 |
| 6.14676e-08 | 0.305 |
| 5.96554e-08 | 0.299 |
| 5.78966e-08 | 0.293 |
| 5.61896e-08 | 0.287 |
| 5.4533e-08 | 0.282 |
| 5.29252e-08 | 0.276 |
| 5.13648e-08 | 0.27 |
| 4.98504e-08 | 0.265 |
| 4.83807e-08 | 0.26 |
| 4.69543e-08 | 0.255 |
| 4.55699e-08 | 0.25 |
| 4.42264e-08 | 0.245 |
| 4.29225e-08 | 0.24 |
| 4.1657e-08 | 0.235 |
| 4.04288e-08 | 0.23 |
| 3.92369e-08 | 0.226 |
| 3.80801e-08 | 0.221 |
| 3.69574e-08 | 0.217 |
| 3.58677e-08 | 0.213 |
| 3.48103e-08 | 0.208 |
| 3.3784e-08 | 0.204 |
| 3.27879e-08 | 0.2 |
| 3.18212e-08 | 0.196 |
| 3.0883e-08 | 0.192 |
| 2.99725e-08 | 0.188 |
| 2.90888e-08 | 0.185 |
| 2.82312e-08 | 0.181 |
| 2.73989e-08 | 0.178 |
| 2.65911e-08 | 0.174 |
| 2.58071e-08 | 0.17 |
| 2.50462e-08 | 0.167 |
| 2.43078e-08 | 0.164 |
| 2.35911e-08 | 0.161 |
| 2.28956e-08 | 0.157 |
| 2.22206e-08 | 0.154 |
| 2.15654e-08 | 0.151 |
| 2.09296e-08 | 0.148 |
| 2.03126e-08 | 0.145 |
| 1.97137e-08 | 0.142 |
| 1.91325e-08 | 0.14 |
| 1.85684e-08 | 0.137 |
| 1.8021e-08 | 0.134 |
| 1.74896e-08 | 0.131 |
| 1.6974e-08 | 0.129 |
| 1.64736e-08 | 0.126 |
| 1.59879e-08 | 0.124 |
| 1.55165e-08 | 0.121 |
| 1.5059e-08 | 0.119 |
| 1.4615e-08 | 0.116 |
| 1.41842e-08 | 0.114 |
| 1.3766e-08 | 0.112 |
| 1.33601e-08 | 0.11 |
| 1.29662e-08 | 0.108 |